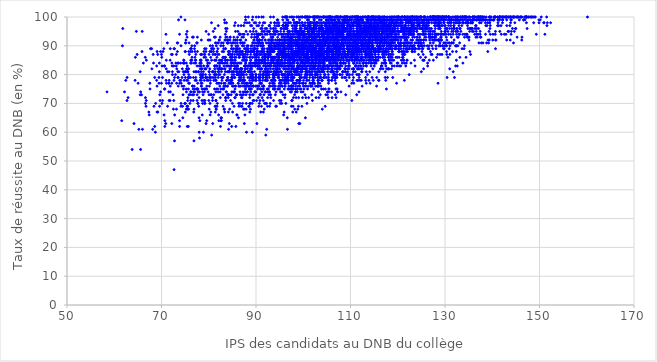
| Category | reu_brut_G |
|---|---|
| 98.0574247389712 | 77 |
| 108.193614128385 | 91 |
| 93.5356917426993 | 86 |
| 92.8418094473348 | 80 |
| 101.205676694996 | 96 |
| 116.446866718269 | 89 |
| 109.258582033633 | 90 |
| 111.375158061735 | 86 |
| 81.3347429428689 | 69 |
| 106.955762096414 | 79 |
| 111.204639375103 | 89 |
| 96.8448099599751 | 90 |
| 99.0614620617843 | 83 |
| 118.5859451224 | 92 |
| 108.109020622198 | 93 |
| 103.301721868707 | 81 |
| 120.106388388778 | 92 |
| 121.941097410415 | 96 |
| 116.118729919025 | 98 |
| 126.486569555355 | 99 |
| 116.167020654096 | 90 |
| 108.315897839998 | 97 |
| 114.581822259317 | 79 |
| 116.686599782313 | 95 |
| 122.552704291567 | 99 |
| 113.837405544335 | 85 |
| 117.96437181888 | 89 |
| 77.0780023997472 | 75 |
| 106.456765999776 | 81 |
| 107.01725673328 | 89 |
| 107.043779699806 | 82 |
| 110.637995663218 | 79 |
| 133.145594501586 | 86 |
| 109.605824070029 | 87 |
| 107.067110280555 | 90 |
| 121.437952500692 | 84 |
| 98.7329528992017 | 75 |
| 105.294921391208 | 78 |
| 85.9032099187627 | 82 |
| 97.5856100515473 | 83 |
| 102.027804708924 | 82 |
| 95.0484700527107 | 85 |
| 99.7457374137633 | 82 |
| 112.153949127509 | 83 |
| 114.113837464095 | 85 |
| 114.254080368575 | 98 |
| 113.263477756213 | 84 |
| 124.993335642129 | 81 |
| 95.5030437477275 | 74 |
| 113.231829508771 | 90 |
| 121.067253404027 | 96 |
| 102.33762497167 | 88 |
| 104.025497241884 | 78 |
| 121.815705125743 | 84 |
| 121.747476679914 | 90 |
| 116.389227861052 | 90 |
| 109.260514147983 | 94 |
| 118.226684289135 | 94 |
| 101.674026981906 | 80 |
| 96.0004730470147 | 88 |
| 83.5022837879018 | 76 |
| 71.8072071404106 | 71 |
| 99.7278803569167 | 81 |
| 99.4653942298451 | 79 |
| 99.6411804665782 | 92 |
| 91.9883689302437 | 78 |
| 104.063093188227 | 87 |
| 88.0046069839354 | 76 |
| 90.9920180135138 | 67 |
| 104.598450243948 | 86 |
| 80.0689516939292 | 73 |
| 102.703146605309 | 98 |
| 96.8004421657071 | 85 |
| 83.0701516807762 | 91 |
| 90.8840809101393 | 94 |
| 83.8784089952797 | 96 |
| 103.069580627837 | 82 |
| 65.2059770990001 | 61 |
| 92.5644137724826 | 81 |
| 78.0460605851833 | 58 |
| 93.8992744819904 | 76 |
| 96.9541776623181 | 87 |
| 100.576905750399 | 85 |
| 92.6222425913395 | 92 |
| 78.2162139168631 | 85 |
| 81.824517609393 | 70 |
| 88.3739179428429 | 76 |
| 99.426692316183 | 83 |
| 90.9054517611376 | 73 |
| 117.398801063767 | 91 |
| 103.974104948353 | 92 |
| 104.305712594663 | 96 |
| 115.957575967666 | 94 |
| 116.690049929823 | 98 |
| 103.205790893712 | 94 |
| 104.032813939675 | 89 |
| 79.4053929585136 | 88 |
| 87.7904919881352 | 83 |
| 98.7716899887666 | 78 |
| 62.1707063816819 | 74 |
| 94.2492921697877 | 74 |
| 89.9969502472228 | 74 |
| 84.0251683052644 | 79 |
| 95.8851634203459 | 88 |
| 105.79144386819 | 95 |
| 96.3426620957065 | 77 |
| 90.2780611427279 | 89 |
| 104.64829265874 | 69 |
| 96.8095213115768 | 77 |
| 93.2448667989566 | 78 |
| 82.6829598467108 | 79 |
| 113.251441880224 | 86 |
| 87.6744295666942 | 81 |
| 96.1726902980408 | 85 |
| 83.0339107670087 | 86 |
| 100.803885782538 | 78 |
| 97.2340987586138 | 91 |
| 97.0645779259505 | 84 |
| 101.710062764314 | 88 |
| 84.7225256098806 | 77 |
| 87.7332138432147 | 83 |
| 96.3153263943336 | 70 |
| 92.4569260892036 | 81 |
| 106.949494445913 | 100 |
| 95.6850049213676 | 89 |
| 110.350393178366 | 100 |
| 101.850577600192 | 88 |
| 99.7289132053266 | 90 |
| 98.5021347907808 | 87 |
| 90.0291035319273 | 95 |
| 104.874539059055 | 92 |
| 102.321736098607 | 89 |
| 100.248113556155 | 89 |
| 100.657506838771 | 81 |
| 75.0561528237236 | 81 |
| 108.888021981404 | 82 |
| 103.942974406324 | 88 |
| 110.894321900581 | 98 |
| 103.517396251497 | 93 |
| 98.1272471514093 | 85 |
| 95.3180967082642 | 94 |
| 86.2389095604921 | 97 |
| 103.186050723386 | 88 |
| 96.298395588593 | 83 |
| 100.932412392007 | 92 |
| 116.307114853338 | 99 |
| 108.215530364293 | 83 |
| 100.629757057938 | 88 |
| 94.5368254303244 | 81 |
| 100.944441624714 | 91 |
| 103.503391078981 | 81 |
| 108.946934697407 | 86 |
| 91.4398765168401 | 85 |
| 100.684081032557 | 82 |
| 94.9521149224812 | 83 |
| 97.0804344254613 | 86 |
| 102.560734757539 | 79 |
| 117.287401489386 | 93 |
| 102.974313574432 | 80 |
| 97.9068351540819 | 72 |
| 95.1882784006547 | 84 |
| 96.6186930693029 | 89 |
| 95.1977056424576 | 95 |
| 114.798568588777 | 92 |
| 100.872631020171 | 89 |
| 111.640345425327 | 92 |
| 102.60167468368 | 87 |
| 98.2962292350084 | 93 |
| 118.976758231174 | 95 |
| 107.269298451811 | 97 |
| 113.675951220406 | 100 |
| 123.019123774507 | 97 |
| 112.00855812854 | 92 |
| 111.192894467184 | 90 |
| 150.901952321083 | 98 |
| 111.805980054562 | 89 |
| 110.962759526253 | 94 |
| 118.676555552209 | 99 |
| 107.187130351579 | 94 |
| 110.21636373705 | 90 |
| 120.460707885276 | 99 |
| 104.86596622771 | 98 |
| 105.256393899577 | 97 |
| 110.394383006424 | 91 |
| 109.708482481194 | 97 |
| 122.633212263559 | 99 |
| 106.552620044588 | 95 |
| 107.261546831707 | 93 |
| 105.353442145622 | 78 |
| 105.152171490641 | 94 |
| 99.6817097223279 | 89 |
| 106.598401598027 | 90 |
| 81.5388260857913 | 91 |
| 112.804189039337 | 95 |
| 101.46717918471 | 92 |
| 97.4457556466883 | 89 |
| 114.45178445713 | 97 |
| 108.06693639027 | 95 |
| 118.330021630803 | 95 |
| 93.8630311409056 | 95 |
| 108.313920494036 | 92 |
| 81.4836914439088 | 83 |
| 106.830298157602 | 90 |
| 119.749790263322 | 100 |
| 122.57172685526 | 100 |
| 113.914221991477 | 100 |
| 123.082528395615 | 100 |
| 109.413259059074 | 100 |
| 127.729279650973 | 100 |
| 121.880069785269 | 99 |
| 106.350983620062 | 89 |
| 82.8499358402688 | 88 |
| 118.894450753376 | 100 |
| 72.315518823474 | 80 |
| 86.275504072547 | 77 |
| 90.8646658814288 | 87 |
| 106.273319095269 | 96 |
| 88.1757171798136 | 82 |
| 110.207422593523 | 93 |
| 69.7010297548434 | 71 |
| 84.0136020973719 | 85 |
| 83.1653700426442 | 88 |
| 116.380819015534 | 96 |
| 102.615362766181 | 89 |
| 132.790285507794 | 100 |
| 125.666218940558 | 100 |
| 64.1803841982182 | 63 |
| 94.0459445374687 | 89 |
| 74.6430741570371 | 75 |
| 99.0932600949378 | 85 |
| 113.996938788982 | 90 |
| 83.8985833255245 | 91 |
| 111.994327067766 | 98 |
| 115.009500497606 | 97 |
| 82.2121707029223 | 84 |
| 102.459444110861 | 94 |
| 96.8710483788591 | 88 |
| 88.8538684850587 | 97 |
| 89.1164344633275 | 80 |
| 118.104555790078 | 87 |
| 106.568365698264 | 91 |
| 85.8748105541331 | 88 |
| 105.736675447956 | 93 |
| 98.7573549854232 | 88 |
| 92.8604292134196 | 92 |
| 124.937933274909 | 96 |
| 110.610642875087 | 96 |
| 127.321988909502 | 100 |
| 134.298824924555 | 100 |
| 116.699067910876 | 98 |
| 133.748856214386 | 100 |
| 128.840878834378 | 100 |
| 141.565959078196 | 100 |
| 125.53114823215 | 99 |
| 100.700463887564 | 92 |
| 132.952946322859 | 98 |
| 122.473089167185 | 98 |
| 98.5498033674546 | 80 |
| 115.708488894155 | 95 |
| 115.072302358284 | 95 |
| 118.424240810692 | 99 |
| 110.451055334901 | 94 |
| 99.1114072723168 | 88 |
| 113.291996748088 | 95 |
| 123.355294989635 | 100 |
| 109.368526202601 | 94 |
| 142.163866212088 | 98 |
| 107.873673779139 | 98 |
| 146.641439750682 | 99 |
| 146.659181537649 | 99 |
| 115.592535516618 | 93 |
| 91.374119466831 | 86 |
| 98.5298176129301 | 96 |
| 113.318913273043 | 88 |
| 109.097076752031 | 100 |
| 103.608704762495 | 73 |
| 106.4700235177 | 92 |
| 103.143025258202 | 76 |
| 114.300248825494 | 92 |
| 99.8299577514553 | 92 |
| 105.901739381282 | 93 |
| 111.624162463741 | 88 |
| 102.09585190975599 | 92 |
| 100.158530493361 | 94 |
| 115.764542721635 | 99 |
| 108.601460815901 | 97 |
| 108.83665175844 | 98 |
| 96.8469498568071 | 98 |
| 113.047330855116 | 90 |
| 108.247916050497 | 80 |
| 102.73211448121 | 86 |
| 102.070674997897 | 90 |
| 103.02121178806 | 80 |
| 111.230343977809 | 95 |
| 108.803512854659 | 95 |
| 109.698867681161 | 76 |
| 100.57763853994 | 86 |
| 101.476646959692 | 98 |
| 87.5178302280522 | 83 |
| 105.142047068719 | 90 |
| 104.131251606494 | 89 |
| 103.199502799602 | 78 |
| 103.668482635804 | 89 |
| 106.593764449264 | 98 |
| 99.8918322391302 | 85 |
| 124.401326857653 | 90 |
| 122.675279211492 | 99 |
| 99.6227443953337 | 92 |
| 92.5295599339278 | 87 |
| 108.484678507965 | 84 |
| 108.248440670152 | 93 |
| 88.715761834736 | 79 |
| 110.187054202942 | 98 |
| 108.21749403257 | 79 |
| 89.8742894440454 | 89 |
| 86.6252401619704 | 74 |
| 89.6018706935523 | 88 |
| 118.254149643856 | 98 |
| 118.118007644136 | 98 |
| 78.4269917309882 | 78 |
| 81.2675195557081 | 83 |
| 90.3311348197297 | 94 |
| 92.6374982098962 | 89 |
| 83.9948213424662 | 92 |
| 69.2030385330398 | 87 |
| 98.1504294039256 | 96 |
| 101.991404252326 | 79 |
| 103.606729584363 | 83 |
| 87.188896946704 | 88 |
| 68.4071668043647 | 69 |
| 93.2738665257265 | 89 |
| 80.5740340507961 | 89 |
| 101.162177867007 | 100 |
| 115.290353821419 | 100 |
| 112.036213739794 | 99 |
| 91.0960368024663 | 84 |
| 90.0343217783026 | 100 |
| 99.4431652872274 | 84 |
| 87.260651958208 | 91 |
| 84.232934458741 | 87 |
| 104.908338444056 | 97 |
| 95.7077525290049 | 80 |
| 86.6979314540655 | 78 |
| 93.3384412949489 | 84 |
| 93.1715340875867 | 91 |
| 102.5539478344 | 93 |
| 91.96890607956 | 82 |
| 104.619552009873 | 92 |
| 110.638131126581 | 82 |
| 107.4189004928 | 95 |
| 105.303601722895 | 92 |
| 102.299416560467 | 98 |
| 100.179322917492 | 82 |
| 102.102402346717 | 84 |
| 117.575553595035 | 91 |
| 98.5713348032205 | 95 |
| 99.0265212365103 | 82 |
| 106.68711363418 | 85 |
| 109.370158043736 | 89 |
| 115.070474359653 | 99 |
| 94.7008915480288 | 84 |
| 91.7809469451007 | 87 |
| 103.714193224115 | 82 |
| 83.668444890223 | 74 |
| 94.583217533078 | 93 |
| 100.82409958373 | 86 |
| 100.400834329045 | 93 |
| 88.2985484992726 | 79 |
| 94.8691878501104 | 94 |
| 98.8300279174435 | 81 |
| 110.910966865129 | 88 |
| 71.2604492406317 | 81 |
| 112.620494492166 | 98 |
| 114.862866047861 | 100 |
| 123.8153321587 | 100 |
| 97.0993241957941 | 95 |
| 117.92466889256 | 97 |
| 88.3188440487565 | 88 |
| 111.309654796846 | 98 |
| 93.9241450902668 | 89 |
| 98.5854804664609 | 97 |
| 113.865871134319 | 96 |
| 98.075242716165 | 86 |
| 95.8150779895708 | 91 |
| 88.8873671748382 | 74 |
| 102.971809051643 | 84 |
| 87.9488435994388 | 85 |
| 101.763954966782 | 87 |
| 82.6195483169899 | 85 |
| 87.2473285407118 | 74 |
| 124.128995580773 | 100 |
| 127.653837704897 | 100 |
| 95.4059847288263 | 81 |
| 101.682655765948 | 87 |
| 108.183186425417 | 89 |
| 79.672252946835 | 83 |
| 104.899745131942 | 79 |
| 114.141461933959 | 92 |
| 98.4917509750934 | 72 |
| 90.8407244718507 | 82 |
| 124.792015789459 | 98 |
| 113.495444744105 | 99 |
| 114.692306413567 | 86 |
| 107.154944751846 | 75 |
| 87.0448455117371 | 72 |
| 107.228001429627 | 87 |
| 106.788457007778 | 79 |
| 96.8529612375812 | 80 |
| 90.1303657811656 | 71 |
| 96.9167947319566 | 82 |
| 97.5670624995927 | 100 |
| 107.134880330267 | 88 |
| 110.930029534395 | 94 |
| 95.9980890394858 | 84 |
| 86.4088793189587 | 84 |
| 98.0909810611521 | 86 |
| 95.1029637536384 | 78 |
| 106.278110484197 | 83 |
| 98.9413495016351 | 82 |
| 104.293235647462 | 86 |
| 99.6320077291649 | 87 |
| 100.335855422055 | 91 |
| 107.110349696792 | 93 |
| 115.136872725956 | 89 |
| 97.6606820299681 | 97 |
| 109.391768052197 | 100 |
| 96.8201777608856 | 98 |
| 103.126459759256 | 91 |
| 114.812376703172 | 90 |
| 103.751250510786 | 91 |
| 112.300747471582 | 99 |
| 115.648635212388 | 94 |
| 107.903679350106 | 100 |
| 105.237705230107 | 98 |
| 94.4384837146785 | 97 |
| 106.942307706977 | 100 |
| 107.083717211307 | 93 |
| 93.5378076658594 | 85 |
| 103.378886116722 | 92 |
| 114.767149465216 | 89 |
| 107.236402616969 | 97 |
| 106.129719099427 | 82 |
| 108.460452863807 | 95 |
| 107.775872187399 | 100 |
| 103.38872176537 | 93 |
| 105.279668117315 | 100 |
| 109.955549137674 | 97 |
| 107.706396224524 | 88 |
| 99.1874542356718 | 94 |
| 107.004410721853 | 89 |
| 120.722966958172 | 97 |
| 113.675643578392 | 98 |
| 84.1490555429446 | 67 |
| 107.414806888368 | 90 |
| 129.660276346593 | 94 |
| 120.704676743426 | 90 |
| 141.360031390042 | 97 |
| 119.157069325398 | 95 |
| 103.152312852561 | 77 |
| 107.559943892647 | 87 |
| 76.7585145932488 | 79 |
| 86.455676282647 | 88 |
| 117.829977594367 | 96 |
| 120.913137821835 | 93 |
| 108.081242169953 | 86 |
| 114.989126208928 | 94 |
| 122.741200505596 | 96 |
| 78.8126757230777 | 80 |
| 78.3072449879254 | 84 |
| 70.111328789388 | 83 |
| 76.1820341895981 | 74 |
| 75.6954104584861 | 75 |
| 110.333607071564 | 92 |
| 133.687229574321 | 98 |
| 104.274687507594 | 100 |
| 119.864251395734 | 99 |
| 130.756847727879 | 100 |
| 133.425554761582 | 100 |
| 114.652590342955 | 100 |
| 124.838186300422 | 100 |
| 114.119479413565 | 99 |
| 87.0780820727724 | 88 |
| 129.463891529811 | 97 |
| 92.4761533728266 | 81 |
| 73.3285300972531 | 91 |
| 123.144887157001 | 100 |
| 92.8650031148529 | 97 |
| 125.686244751991 | 100 |
| 137.666811241395 | 100 |
| 122.783079257083 | 100 |
| 110.133789976719 | 96 |
| 118.239900311317 | 90 |
| 100.551690433624 | 79 |
| 131.733284149573 | 81 |
| 72.0884461841473 | 87 |
| 79.6382647440004 | 78 |
| 99.9849490385245 | 85 |
| 100.366373522005 | 73 |
| 104.321410627146 | 95 |
| 90.914405086698 | 79 |
| 92.4582070270438 | 86 |
| 101.788502584628 | 94 |
| 96.5684224102461 | 100 |
| 114.561657976337 | 86 |
| 90.6131667888017 | 76 |
| 61.7356558485258 | 90 |
| 69.5482161585706 | 81 |
| 93.4211797797179 | 89 |
| 108.074778625177 | 96 |
| 103.933889536455 | 90 |
| 123.003940512744 | 90 |
| 119.632436313401 | 90 |
| 109.784371127199 | 97 |
| 102.485606563271 | 92 |
| 97.5226886188168 | 83 |
| 97.7981351896429 | 83 |
| 99.0255629934069 | 72 |
| 103.134984984588 | 82 |
| 105.185822574263 | 99 |
| 114.059288964611 | 88 |
| 71.8621967150278 | 89 |
| 77.9488569590919 | 72 |
| 103.724968395339 | 88 |
| 95.9351586538306 | 80 |
| 127.232638660656 | 90 |
| 116.203078393451 | 94 |
| 112.307869596897 | 92 |
| 107.85269944398 | 95 |
| 65.9134052296267 | 95 |
| 98.5511900547049 | 87 |
| 96.1256172557579 | 78 |
| 89.2354813158663 | 78 |
| 110.032994819661 | 87 |
| 97.1171862269252 | 89 |
| 75.0487994897378 | 70 |
| 112.372529935565 | 89 |
| 74.5516856474012 | 73 |
| 92.0560377282697 | 82 |
| 76.8872384658953 | 68 |
| 76.1954983751966 | 71 |
| 97.4569982340616 | 91 |
| 110.673477661624 | 82 |
| 96.3167228841219 | 93 |
| 111.823406009606 | 94 |
| 70.7069023615538 | 64 |
| 90.8170369984782 | 91 |
| 94.0470406859435 | 78 |
| 104.477565510517 | 88 |
| 93.837888348899 | 83 |
| 87.8453089924819 | 88 |
| 119.532611713299 | 95 |
| 130.621587259371 | 86 |
| 84.813168253172 | 78 |
| 72.3049310304474 | 81 |
| 95.1888609106681 | 81 |
| 123.098044173811 | 92 |
| 75.701811753467 | 82 |
| 69.9928431447097 | 87 |
| 64.8496892791668 | 87 |
| 68.9715591423696 | 78 |
| 103.793622466937 | 85 |
| 97.5789334558182 | 91 |
| 76.4502962165649 | 86 |
| 101.857486891813 | 89 |
| 89.6638934206404 | 81 |
| 91.1593678696764 | 82 |
| 74.1246689923551 | 90 |
| 117.116445606358 | 94 |
| 127.537516826348 | 91 |
| 84.9250437456378 | 80 |
| 106.454656880947 | 91 |
| 98.2587476132335 | 91 |
| 77.2570182553073 | 84 |
| 113.484817092387 | 87 |
| 70.2234737337398 | 79 |
| 115.907721822343 | 89 |
| 140.167308215522 | 99 |
| 132.303476731051 | 95 |
| 110.53981154498 | 94 |
| 118.216097171396 | 100 |
| 111.167185759224 | 100 |
| 130.366504991315 | 100 |
| 129.791379882124 | 100 |
| 147.201092604602 | 100 |
| 150.371337928995 | 100 |
| 142.673215329922 | 100 |
| 135.818051255579 | 98 |
| 127.80276087535 | 99 |
| 138.416141486947 | 100 |
| 119.264540383385 | 97 |
| 141.544218969166 | 100 |
| 131.749215847551 | 100 |
| 117.095859851655 | 95 |
| 129.68862357786 | 100 |
| 130.223893173349 | 100 |
| 139.378211075441 | 98 |
| 88.5648339736615 | 98 |
| 117.187572279873 | 98 |
| 120.958696479318 | 84 |
| 121.380829743927 | 91 |
| 126.830181793508 | 93 |
| 121.807757973737 | 98 |
| 114.776904374589 | 98 |
| 102.829249914848 | 86 |
| 123.450097926739 | 96 |
| 99.7914313032527 | 100 |
| 121.73378512085 | 93 |
| 126.32262283663 | 100 |
| 125.167676583775 | 94 |
| 89.6685320560567 | 90 |
| 133.093401167427 | 96 |
| 121.409043411796 | 100 |
| 112.473942253515 | 92 |
| 134.406629220092 | 98 |
| 124.71212018512 | 94 |
| 126.629123874374 | 96 |
| 117.912452435784 | 82 |
| 102.684594770442 | 89 |
| 120.678179090572 | 92 |
| 113.489723577909 | 100 |
| 105.19679774306 | 83 |
| 115.937268683967 | 93 |
| 90.6755786069048 | 83 |
| 72.4301032195479 | 73 |
| 71.5326657994567 | 77 |
| 127.955690862617 | 94 |
| 121.899984577135 | 96 |
| 102.5523051609 | 84 |
| 119.528720482842 | 90 |
| 86.2386647577274 | 82 |
| 124.38905928301 | 98 |
| 111.535126025457 | 88 |
| 93.234977815891 | 88 |
| 152.356745341408 | 98 |
| 104.430005987578 | 88 |
| 115.333748098815 | 93 |
| 101.160368085373 | 94 |
| 117.661985653028 | 96 |
| 111.420751534455 | 86 |
| 126.329229218386 | 83 |
| 98.4819354386853 | 92 |
| 116.749425634798 | 95 |
| 94.8110563437533 | 84 |
| 115.037537252939 | 83 |
| 120.885756909026 | 98 |
| 89.3886311974642 | 89 |
| 99.2177679175862 | 77 |
| 94.8781738542106 | 97 |
| 106.75308856433 | 98 |
| 102.099024060581 | 85 |
| 93.6544356848994 | 94 |
| 109.734884673331 | 93 |
| 96.081584543815 | 92 |
| 96.3393310858182 | 97 |
| 119.715152376759 | 98 |
| 107.631451461801 | 86 |
| 98.9142725634373 | 92 |
| 89.2633919234502 | 86 |
| 132.840715459333 | 99 |
| 133.750108987672 | 100 |
| 126.726686905363 | 99 |
| 95.8573319641989 | 90 |
| 100.684154947449 | 100 |
| 117.142634497193 | 100 |
| 106.08172787654 | 100 |
| 111.7706693775 | 99 |
| 125.647361586003 | 99 |
| 113.939744276573 | 98 |
| 105.683762869695 | 100 |
| 104.128182394135 | 83 |
| 79.9824384923656 | 94 |
| 92.0574890599149 | 84 |
| 85.4390086094475 | 74 |
| 88.7953763142047 | 83 |
| 115.980834223152 | 88 |
| 93.2341482838148 | 92 |
| 93.5303777091927 | 86 |
| 102.463976357862 | 87 |
| 112.287307760436 | 90 |
| 87.7879751328846 | 75 |
| 85.5981617957153 | 76 |
| 89.0468090984264 | 88 |
| 93.869660312836 | 86 |
| 126.881274474 | 91 |
| 105.822817523557 | 84 |
| 113.389431014109 | 95 |
| 101.426228439377 | 85 |
| 97.4334534347503 | 86 |
| 110.644052550261 | 87 |
| 111.929887325933 | 84 |
| 115.376589561007 | 85 |
| 108.362190839532 | 94 |
| 113.464311676706 | 91 |
| 113.296891112516 | 90 |
| 111.683910828283 | 88 |
| 127.219439459499 | 100 |
| 114.159088388391 | 77 |
| 115.746657898703 | 99 |
| 122.719804492403 | 99 |
| 105.478234312756 | 98 |
| 102.442447409752 | 81 |
| 98.5118280891376 | 67 |
| 96.4958620457255 | 78 |
| 107.684678737594 | 93 |
| 104.071369612082 | 81 |
| 99.8490117425122 | 100 |
| 106.070906132282 | 97 |
| 102.379743668878 | 86 |
| 98.3837676772011 | 95 |
| 100.938778795964 | 87 |
| 98.2898194851879 | 97 |
| 102.546708076979 | 92 |
| 107.649695873273 | 94 |
| 107.52830392833 | 100 |
| 101.519445866656 | 97 |
| 117.874454730034 | 93 |
| 120.497423567894 | 98 |
| 99.8870025530255 | 89 |
| 114.083324761297 | 100 |
| 106.153836209742 | 95 |
| 115.992171751121 | 81 |
| 105.28450569954 | 72 |
| 92.7874850467305 | 89 |
| 95.0928298870983 | 76 |
| 99.3619032019867 | 79 |
| 101.670264455219 | 91 |
| 103.461624790845 | 95 |
| 88.6373379339122 | 86 |
| 97.7337626823038 | 88 |
| 104.432879756115 | 89 |
| 102.726005591555 | 88 |
| 82.1593732133117 | 77 |
| 100.117736774474 | 94 |
| 94.5549058141544 | 95 |
| 96.6239749280344 | 65 |
| 123.606093943879 | 88 |
| 110.021098176495 | 100 |
| 105.247803273696 | 89 |
| 108.039536955068 | 90 |
| 109.165136298397 | 86 |
| 71.8456009206686 | 76 |
| 107.369239252493 | 92 |
| 63.7904244860599 | 54 |
| 107.551095699375 | 90 |
| 102.271881530282 | 77 |
| 89.0801091308945 | 82 |
| 80.7551928574126 | 89 |
| 100.617845621312 | 76 |
| 91.5188784200577 | 75 |
| 102.577564073054 | 83 |
| 107.687493942517 | 88 |
| 94.3368126340488 | 91 |
| 92.912070645119 | 83 |
| 114.663584139416 | 96 |
| 92.6093935188199 | 86 |
| 98.3319489457078 | 87 |
| 105.331744475253 | 93 |
| 126.089695409767 | 99 |
| 105.921553184842 | 95 |
| 100.061835564116 | 90 |
| 107.092646024886 | 96 |
| 102.511527999943 | 89 |
| 100.5402247585 | 91 |
| 105.087848641541 | 95 |
| 101.22908997382 | 83 |
| 102.057445999892 | 89 |
| 98.1611955376497 | 94 |
| 115.216703621331 | 87 |
| 102.272531441498 | 85 |
| 92.5410327826826 | 91 |
| 94.5107508165944 | 81 |
| 118.10543297415 | 94 |
| 110.71702016808 | 88 |
| 90.8286257085984 | 71 |
| 92.0951681258362 | 80 |
| 99.0412112910869 | 82 |
| 102.602309077199 | 76 |
| 103.069634129041 | 76 |
| 111.597974444926 | 90 |
| 99.9713000813143 | 87 |
| 105.535628530647 | 83 |
| 94.8275141414619 | 88 |
| 89.2235251669604 | 86 |
| 73.8378053255141 | 77 |
| 99.1452691707645 | 77 |
| 99.2795249421605 | 95 |
| 112.175964862168 | 86 |
| 128.688510091191 | 98 |
| 118.166828740943 | 96 |
| 111.355433006047 | 100 |
| 111.22125268253 | 93 |
| 107.127665093999 | 83 |
| 114.667760318861 | 87 |
| 119.763660125941 | 97 |
| 99.2679549109059 | 79 |
| 110.16080826013 | 88 |
| 102.370318297092 | 91 |
| 96.2550245836117 | 91 |
| 98.9295433417366 | 95 |
| 116.361940431599 | 96 |
| 104.132111370033 | 85 |
| 110.488717573683 | 89 |
| 112.016290315882 | 88 |
| 109.629724999891 | 88 |
| 109.329235896 | 85 |
| 100.200108521616 | 88 |
| 103.336963192542 | 95 |
| 115.872225602942 | 92 |
| 103.729273281586 | 79 |
| 95.1707565138724 | 77 |
| 90.2971389050407 | 84 |
| 130.578630462767 | 98 |
| 109.456795333923 | 85 |
| 118.807231914156 | 85 |
| 91.014315651739 | 77 |
| 102.029448683604 | 77 |
| 121.06637774435 | 86 |
| 94.6406824354787 | 89 |
| 101.758347213934 | 86 |
| 87.9016317431448 | 73 |
| 111.52788000706 | 97 |
| 95.5157080511129 | 94 |
| 100.915930590364 | 75 |
| 107.795320492909 | 95 |
| 109.514489034491 | 98 |
| 91.3400994207201 | 97 |
| 74.1429161851905 | 70 |
| 112.725319406952 | 94 |
| 101.548717835303 | 90 |
| 108.233745966227 | 86 |
| 102.34115504279 | 92 |
| 87.1132932514498 | 78 |
| 108.132282805996 | 90 |
| 105.357172069941 | 91 |
| 103.835603430483 | 99 |
| 93.856437240038 | 86 |
| 96.8828058348983 | 88 |
| 115.18617999776 | 96 |
| 103.117499474186 | 87 |
| 102.242564205466 | 82 |
| 86.8592051983127 | 69 |
| 84.5809362624159 | 82 |
| 96.2001399625291 | 91 |
| 107.763810833699 | 88 |
| 122.817607958844 | 96 |
| 101.934743649758 | 85 |
| 101.782403980241 | 87 |
| 103.380748454634 | 97 |
| 110.526150971392 | 97 |
| 97.2561705467288 | 91 |
| 102.434458739384 | 93 |
| 98.4943326308858 | 98 |
| 101.791874194115 | 83 |
| 108.13281282232 | 90 |
| 101.261591896525 | 91 |
| 109.557606879161 | 94 |
| 129.188681129145 | 99 |
| 104.737849643067 | 91 |
| 104.689474530303 | 91 |
| 102.601431738293 | 85 |
| 113.972647447347 | 86 |
| 101.194297025007 | 88 |
| 76.7016806107099 | 71 |
| 90.4818971585006 | 72 |
| 97.9111144202015 | 88 |
| 107.738199650509 | 89 |
| 106.058002418864 | 86 |
| 108.411842631894 | 90 |
| 110.767999597932 | 84 |
| 99.5970556048929 | 89 |
| 115.861721844335 | 97 |
| 111.726220409972 | 89 |
| 97.9448677576283 | 85 |
| 95.8090218115935 | 94 |
| 103.634000163594 | 80 |
| 91.1002970853017 | 82 |
| 103.463231273568 | 85 |
| 117.701855631687 | 94 |
| 114.262673403427 | 95 |
| 104.660753672903 | 92 |
| 114.506629376619 | 97 |
| 116.30258225653 | 93 |
| 99.8950906950568 | 90 |
| 106.678428141137 | 82 |
| 101.681561917788 | 91 |
| 95.7019736260428 | 73 |
| 117.732525272677 | 97 |
| 100.9153894186 | 87 |
| 127.99644018603 | 100 |
| 123.866231600403 | 99 |
| 125.059831787936 | 99 |
| 112.896361342685 | 95 |
| 92.9994369848379 | 92 |
| 113.213762576908 | 87 |
| 111.10084881847 | 92 |
| 118.958486843735 | 93 |
| 103.051362791763 | 91 |
| 132.98218222762 | 100 |
| 101.247114150924 | 93 |
| 98.760255166788 | 95 |
| 70.9397036793807 | 94 |
| 100.492306035549 | 81 |
| 108.45808038037 | 88 |
| 107.977475565769 | 87 |
| 87.0479496233052 | 87 |
| 93.2393097851956 | 88 |
| 114.055313351108 | 94 |
| 111.594374834029 | 80 |
| 100.780359889289 | 96 |
| 101.123614692538 | 91 |
| 111.872792721631 | 93 |
| 115.45626386533 | 93 |
| 109.51093393616 | 94 |
| 101.094809859896 | 81 |
| 121.788888496718 | 99 |
| 112.406076470456 | 91 |
| 124.131973929724 | 98 |
| 100.475852775236 | 92 |
| 106.774472608782 | 92 |
| 87.7783379933573 | 100 |
| 103.828409958 | 97 |
| 94.2503431966573 | 83 |
| 96.7692802537964 | 75 |
| 98.8180485048606 | 90 |
| 98.6375077275444 | 98 |
| 109.882029825229 | 89 |
| 112.021011586721 | 94 |
| 99.2595453984528 | 83 |
| 110.802826537725 | 88 |
| 111.470729159166 | 92 |
| 132.213862356589 | 90 |
| 109.077422083999 | 98 |
| 117.175830106215 | 92 |
| 116.291126857532 | 99 |
| 110.22561954466 | 99 |
| 97.7536970568364 | 95 |
| 100.124703523015 | 92 |
| 115.668721958405 | 100 |
| 107.221894578082 | 95 |
| 96.7077928741408 | 95 |
| 123.24177901678 | 97 |
| 107.347828667715 | 96 |
| 118.841259348566 | 91 |
| 105.208589300734 | 98 |
| 96.9138702269268 | 83 |
| 112.020633130044 | 85 |
| 103.212857226477 | 84 |
| 104.052861073988 | 96 |
| 125.234272669736 | 96 |
| 83.5125967298044 | 94 |
| 105.894028738012 | 96 |
| 118.208972319525 | 85 |
| 115.265517151906 | 94 |
| 95.50031206945 | 86 |
| 94.8661734382294 | 87 |
| 112.075517034189 | 92 |
| 103.414676013355 | 93 |
| 104.637569202645 | 95 |
| 104.54789847698 | 86 |
| 93.7739940435837 | 96 |
| 86.8437325431206 | 97 |
| 96.4011048810808 | 86 |
| 114.459314801993 | 91 |
| 93.6878980122505 | 80 |
| 101.449090840094 | 82 |
| 98.1549395479474 | 86 |
| 105.610608766506 | 100 |
| 107.653744385426 | 87 |
| 105.413063293173 | 88 |
| 95.8868925287928 | 82 |
| 124.600793752822 | 97 |
| 121.006342774854 | 98 |
| 105.614002058806 | 97 |
| 108.257288621381 | 97 |
| 105.583290807111 | 98 |
| 128.686110300952 | 90 |
| 122.251026196028 | 99 |
| 126.588349051174 | 93 |
| 134.337083276619 | 100 |
| 119.36092567121 | 96 |
| 105.299978597641 | 85 |
| 104.444359896266 | 92 |
| 104.607274678936 | 86 |
| 105.74439467773 | 100 |
| 98.8579923316857 | 90 |
| 100.871619423956 | 86 |
| 102.0931568665 | 92 |
| 97.3517181353931 | 86 |
| 107.659519154045 | 98 |
| 90.3428313276215 | 92 |
| 107.042497570935 | 100 |
| 106.606509631307 | 80 |
| 98.6644366862194 | 91 |
| 111.57354588439 | 86 |
| 104.543862313489 | 79 |
| 105.337946979453 | 96 |
| 107.667521369347 | 82 |
| 115.357873120098 | 86 |
| 102.80342092238 | 89 |
| 92.3685670741621 | 89 |
| 97.5021737944836 | 87 |
| 99.1716168332273 | 92 |
| 95.9020352222911 | 98 |
| 93.4418560178447 | 76 |
| 97.2083685112557 | 76 |
| 90.7649957367728 | 98 |
| 99.0166153998965 | 100 |
| 113.589653846451 | 80 |
| 95.9952867145209 | 84 |
| 97.5849302654531 | 89 |
| 104.425829223582 | 87 |
| 89.2665209081505 | 80 |
| 98.549067574029 | 88 |
| 103.186165540206 | 87 |
| 81.6130625499929 | 90 |
| 104.456605155804 | 93 |
| 97.6499688015675 | 82 |
| 97.4183319656241 | 93 |
| 97.3467388659549 | 83 |
| 106.382499872858 | 89 |
| 97.45521650071 | 89 |
| 93.3265311568825 | 91 |
| 116.329683624555 | 93 |
| 98.1691038643565 | 73 |
| 93.8406166948987 | 79 |
| 88.0449345414341 | 86 |
| 105.500482721528 | 85 |
| 96.1144828607582 | 85 |
| 108.089547119604 | 97 |
| 108.198769178681 | 92 |
| 97.1162371608797 | 80 |
| 104.961728249242 | 95 |
| 95.4455299763062 | 80 |
| 95.5423391235428 | 90 |
| 99.8569905770131 | 84 |
| 101.05459553421 | 87 |
| 97.6048410759674 | 88 |
| 94.7945597628137 | 85 |
| 118.806623105329 | 94 |
| 111.566181094211 | 82 |
| 126.109723726442 | 99 |
| 109.959899913312 | 86 |
| 87.9151593179305 | 68 |
| 109.477475566684 | 89 |
| 107.816669572833 | 82 |
| 128.763746973818 | 92 |
| 102.630003111933 | 93 |
| 94.6275272340745 | 79 |
| 99.1763561828042 | 94 |
| 97.8632604608302 | 76 |
| 88.4839220521667 | 76 |
| 107.334420272305 | 93 |
| 100.519548250925 | 94 |
| 109.463026905837 | 87 |
| 97.5036926150968 | 74 |
| 103.014855696771 | 88 |
| 97.8746754696702 | 94 |
| 97.6913905343256 | 84 |
| 81.3713895182119 | 78 |
| 90.5639218317642 | 97 |
| 101.499270108168 | 98 |
| 113.450757483946 | 98 |
| 112.766289505923 | 83 |
| 106.88679178328 | 93 |
| 121.664137497427 | 97 |
| 106.946271308185 | 98 |
| 96.3762563666834 | 100 |
| 75.5027104399085 | 68 |
| 98.6019248582213 | 95 |
| 100.023663410289 | 86 |
| 103.766631978824 | 90 |
| 114.158559135888 | 87 |
| 91.5562422601444 | 67 |
| 69.4697520682388 | 77 |
| 108.591761352115 | 89 |
| 96.6335570684876 | 80 |
| 90.3068161281296 | 87 |
| 106.599948447455 | 92 |
| 104.703908433699 | 88 |
| 90.0534529643268 | 87 |
| 90.4745452996699 | 83 |
| 119.174107721843 | 97 |
| 111.481248675915 | 89 |
| 70.1050913773486 | 70 |
| 82.9886125451519 | 86 |
| 96.6352412954491 | 83 |
| 114.634769510581 | 91 |
| 112.019880353982 | 92 |
| 128.592630467762 | 96 |
| 124.951485575479 | 100 |
| 105.552424414755 | 93 |
| 79.18001643064 | 82 |
| 113.220484911977 | 93 |
| 98.0617063386191 | 98 |
| 123.193358593026 | 95 |
| 99.7611889604359 | 91 |
| 113.476960652427 | 94 |
| 112.645734987717 | 98 |
| 122.021280165057 | 96 |
| 122.278948161593 | 94 |
| 118.635532552343 | 93 |
| 115.856469891801 | 98 |
| 109.268907643787 | 80 |
| 97.6984087031023 | 90 |
| 101.929549192784 | 84 |
| 107.747724435487 | 80 |
| 115.712864304045 | 92 |
| 87.4398437715391 | 79 |
| 97.820260383185 | 75 |
| 92.214544368644 | 78 |
| 118.890033831372 | 88 |
| 106.274098861633 | 96 |
| 97.8373584941504 | 77 |
| 115.048087238494 | 88 |
| 115.371145370442 | 98 |
| 122.876055882116 | 98 |
| 114.706449350125 | 92 |
| 110.915974669442 | 91 |
| 114.489920202069 | 94 |
| 101.256148540923 | 81 |
| 100.884235340007 | 89 |
| 106.223945096316 | 88 |
| 78.5898769737238 | 77 |
| 93.9275762633024 | 81 |
| 99.8165032630348 | 83 |
| 95.5366884144514 | 76 |
| 117.231113732288 | 87 |
| 95.6586787340018 | 92 |
| 113.263397421395 | 92 |
| 91.678101902565 | 73 |
| 111.256115918027 | 91 |
| 118.182123594004 | 93 |
| 82.3418948838389 | 84 |
| 105.76371052537 | 90 |
| 106.791766720011 | 92 |
| 75.5280820397444 | 69 |
| 76.8707164170175 | 57 |
| 109.626667537276 | 93 |
| 108.943384093611 | 84 |
| 106.111636872124 | 72 |
| 101.175466600678 | 90 |
| 136.181184230614 | 100 |
| 116.588137600758 | 96 |
| 116.429427784264 | 91 |
| 123.870217713141 | 100 |
| 124.267841730717 | 92 |
| 94.4296560617701 | 87 |
| 102.348700584281 | 96 |
| 112.785890584981 | 93 |
| 83.5772497023083 | 89 |
| 92.7980818614206 | 95 |
| 98.4298481054265 | 88 |
| 103.348899489737 | 90 |
| 98.8809353586973 | 94 |
| 101.430222109785 | 80 |
| 92.3558965891542 | 75 |
| 95.6076740913615 | 88 |
| 105.087234136392 | 88 |
| 93.4118602516577 | 89 |
| 101.541635852327 | 91 |
| 104.441427783133 | 91 |
| 83.9250229321161 | 91 |
| 95.3413490896867 | 90 |
| 99.2545614048961 | 78 |
| 99.9689659539108 | 90 |
| 114.618373472866 | 100 |
| 104.597184102571 | 95 |
| 109.336955958496 | 95 |
| 118.764719203845 | 100 |
| 117.842035636424 | 100 |
| 102.318749344627 | 89 |
| 90.0282683710569 | 78 |
| 107.496446343069 | 91 |
| 94.1034167537382 | 94 |
| 98.0335552430245 | 84 |
| 84.1802537680469 | 87 |
| 108.285641286671 | 96 |
| 98.7338966858728 | 87 |
| 104.905951856266 | 85 |
| 94.0870191143697 | 73 |
| 88.790443558144 | 80 |
| 116.178606546115 | 96 |
| 105.143044778458 | 89 |
| 117.505682685828 | 96 |
| 123.129645440095 | 99 |
| 103.392340965591 | 85 |
| 98.3945288198235 | 81 |
| 103.378651200761 | 83 |
| 102.584330213546 | 97 |
| 80.9506800492201 | 95 |
| 113.551523564803 | 89 |
| 87.2386423853529 | 86 |
| 94.3291150911747 | 83 |
| 112.705465664402 | 93 |
| 89.1756106039427 | 90 |
| 105.026935435434 | 83 |
| 113.10691615459 | 87 |
| 95.3578691185814 | 83 |
| 89.6409361222679 | 89 |
| 102.471031741741 | 84 |
| 106.578424179311 | 80 |
| 128.72090482543 | 97 |
| 114.890446419133 | 88 |
| 120.882903908569 | 93 |
| 120.119038237681 | 95 |
| 106.972069246694 | 96 |
| 104.519884139458 | 95 |
| 100.267496934288 | 86 |
| 101.27546705838 | 81 |
| 108.603839797238 | 89 |
| 101.14267978534 | 86 |
| 107.481132297583 | 85 |
| 93.069772057766 | 84 |
| 101.631301828199 | 87 |
| 89.6538641149385 | 84 |
| 107.12405064716 | 86 |
| 112.326510421603 | 95 |
| 82.9961119198624 | 73 |
| 116.674506824907 | 96 |
| 97.0333848581179 | 83 |
| 113.198638708201 | 89 |
| 93.2621870008126 | 78 |
| 97.7461530306619 | 86 |
| 84.2670684225127 | 87 |
| 99.0699102905374 | 78 |
| 117.140619236913 | 96 |
| 113.93760462752 | 89 |
| 107.982884088043 | 94 |
| 118.411689573148 | 84 |
| 118.038154633704 | 87 |
| 100.828701517411 | 88 |
| 77.2534145336025 | 85 |
| 98.441421694367 | 74 |
| 89.7998115578936 | 84 |
| 116.215995488768 | 91 |
| 105.491877710039 | 78 |
| 104.271819446685 | 81 |
| 84.6016524638882 | 78 |
| 106.810705576802 | 85 |
| 98.3954620084446 | 76 |
| 101.348777164143 | 89 |
| 93.5389694444004 | 80 |
| 88.6198080857857 | 84 |
| 95.1286777167171 | 88 |
| 121.431006048131 | 93 |
| 112.269986672527 | 78 |
| 80.5990877757948 | 85 |
| 91.4737273004344 | 87 |
| 117.997483065684 | 91 |
| 127.947736991028 | 99 |
| 117.134586371181 | 91 |
| 111.159819848365 | 89 |
| 113.856129385872 | 87 |
| 89.2905295412174 | 83 |
| 124.511401834577 | 94 |
| 112.987184124247 | 96 |
| 111.876395399478 | 96 |
| 112.797123459799 | 95 |
| 102.290972095634 | 96 |
| 119.979640975092 | 93 |
| 102.035107982506 | 90 |
| 112.931735644189 | 92 |
| 110.729748804739 | 97 |
| 106.801484966957 | 93 |
| 104.619463664685 | 88 |
| 97.8591739782967 | 91 |
| 101.506250571142 | 96 |
| 99.6057413032724 | 100 |
| 115.814226198966 | 97 |
| 108.262897977084 | 88 |
| 110.309474162009 | 98 |
| 116.505368561783 | 100 |
| 117.907683580622 | 93 |
| 92.9872040564248 | 94 |
| 103.864806649911 | 85 |
| 108.126380176322 | 92 |
| 101.942527339462 | 95 |
| 107.388556146051 | 96 |
| 102.502315806811 | 92 |
| 106.562265146641 | 84 |
| 72.7888928091301 | 66 |
| 119.569637741551 | 100 |
| 89.2073047289647 | 78 |
| 117.191456437285 | 97 |
| 114.417826776947 | 94 |
| 117.952660310966 | 99 |
| 105.709401764861 | 100 |
| 97.4647687922736 | 91 |
| 118.342720594212 | 98 |
| 105.984140217454 | 99 |
| 110.302035065322 | 98 |
| 102.99563073215 | 91 |
| 93.8897303369055 | 98 |
| 115.719023556295 | 90 |
| 102.345485202755 | 97 |
| 120.76394466929 | 96 |
| 121.06815167394 | 86 |
| 109.398074223266 | 97 |
| 102.769471507108 | 94 |
| 113.474977082867 | 99 |
| 107.839914547463 | 83 |
| 96.1411745283361 | 96 |
| 90.1931853072755 | 63 |
| 99.797677520271 | 97 |
| 120.374403676952 | 88 |
| 105.681789053127 | 92 |
| 102.694333423967 | 88 |
| 114.125434399641 | 97 |
| 106.613186954538 | 92 |
| 115.054147251213 | 96 |
| 117.977982932777 | 93 |
| 118.612845937116 | 87 |
| 113.470455499828 | 95 |
| 100.413952070485 | 80 |
| 100.930964668394 | 85 |
| 109.228159999334 | 99 |
| 108.818021925331 | 93 |
| 112.210160241337 | 95 |
| 106.85243904235 | 100 |
| 118.505740017 | 96 |
| 113.210631348237 | 78 |
| 124.853859380352 | 100 |
| 119.431858126913 | 92 |
| 114.2818216805 | 99 |
| 124.81506896904 | 86 |
| 108.777564602964 | 92 |
| 118.15964253717 | 91 |
| 125.725839867959 | 100 |
| 137.570135656884 | 100 |
| 114.329986599947 | 97 |
| 111.736001681752 | 97 |
| 113.819673817797 | 95 |
| 115.32772418684 | 99 |
| 112.197269798148 | 99 |
| 115.387627948059 | 99 |
| 126.417504220466 | 99 |
| 113.879418526372 | 91 |
| 119.881536132494 | 92 |
| 115.98119372401 | 96 |
| 114.791937575176 | 95 |
| 119.508938752312 | 93 |
| 125.980235462321 | 96 |
| 113.251215296019 | 91 |
| 90.2141547049227 | 93 |
| 135.883990421236 | 100 |
| 142.882142953599 | 100 |
| 106.988728982411 | 95 |
| 98.6151838492956 | 81 |
| 100.355203072896 | 96 |
| 86.2880272631512 | 65 |
| 64.4103808959872 | 78 |
| 100.613749584497 | 85 |
| 110.289153730408 | 77 |
| 109.256025185187 | 86 |
| 98.1998361794921 | 68 |
| 84.73662953885 | 73 |
| 106.959346884146 | 72 |
| 98.9709974501049 | 87 |
| 113.205054714284 | 91 |
| 108.786403114674 | 82 |
| 106.114005303194 | 87 |
| 77.9798698169082 | 60 |
| 79.5732208915878 | 64 |
| 125.352200002672 | 94 |
| 117.868123724479 | 94 |
| 108.017754922723 | 93 |
| 85.8112382543045 | 73 |
| 116.278971600328 | 100 |
| 111.342973504707 | 97 |
| 131.38527869573 | 99 |
| 68.5684528427788 | 62 |
| 116.974402069933 | 97 |
| 116.373169593473 | 82 |
| 91.2707025218584 | 85 |
| 120.033914921634 | 84 |
| 86.348926934832 | 76 |
| 114.048033242306 | 89 |
| 82.3423033290117 | 76 |
| 81.2926930728417 | 96 |
| 81.1028880949423 | 79 |
| 87.8300527460745 | 84 |
| 95.6441627349638 | 79 |
| 84.8904753800191 | 74 |
| 85.3293090831129 | 80 |
| 109.44457604127 | 88 |
| 99.1609118182105 | 78 |
| 104.06507140769 | 93 |
| 125.373885861194 | 95 |
| 112.445942193352 | 81 |
| 109.379911958814 | 92 |
| 84.5782882236312 | 85 |
| 109.102497586777 | 93 |
| 104.824938307775 | 86 |
| 99.9505358422176 | 74 |
| 100.843944636103 | 80 |
| 107.600743413944 | 89 |
| 119.070645502658 | 99 |
| 114.349206547919 | 96 |
| 120.115800574465 | 98 |
| 114.751901339807 | 99 |
| 116.694065122301 | 96 |
| 105.222887190464 | 94 |
| 118.323757337932 | 89 |
| 106.229605123233 | 91 |
| 116.840376640457 | 92 |
| 100.152597871508 | 75 |
| 110.294936685733 | 86 |
| 123.105082505702 | 99 |
| 105.87322897051 | 85 |
| 101.661263252723 | 76 |
| 107.14333923663 | 94 |
| 104.645934444402 | 91 |
| 111.529821841963 | 96 |
| 101.167207540518 | 91 |
| 106.728309567675 | 93 |
| 107.902171943061 | 85 |
| 109.771679454956 | 92 |
| 97.0349909246755 | 87 |
| 125.501101738288 | 97 |
| 112.280622227367 | 91 |
| 94.4243902630238 | 89 |
| 109.952109480598 | 93 |
| 109.978368656118 | 86 |
| 117.48714154925 | 93 |
| 103.867085449282 | 75 |
| 103.371285910168 | 88 |
| 112.20461690797 | 93 |
| 115.411115311674 | 86 |
| 77.2399056875005 | 81 |
| 123.085297513799 | 94 |
| 101.483957020361 | 80 |
| 116.253998598341 | 88 |
| 127.78801701971 | 93 |
| 92.356743368871 | 81 |
| 91.6735963747975 | 76 |
| 126.251564776115 | 96 |
| 118.200091296381 | 96 |
| 126.951145248615 | 99 |
| 113.117521360063 | 100 |
| 122.101926316609 | 99 |
| 127.914803245951 | 100 |
| 141.182036166749 | 99 |
| 97.467674574907 | 80 |
| 102.944295485416 | 87 |
| 69.0591299465203 | 67 |
| 124.338505812131 | 89 |
| 110.360572245543 | 85 |
| 112.772781187731 | 88 |
| 130.337352343126 | 88 |
| 84.8307572321155 | 85 |
| 81.5526883715812 | 68 |
| 130.632289571994 | 95 |
| 99.3479168914764 | 86 |
| 92.0443464465993 | 70 |
| 101.293749418748 | 84 |
| 121.73293653664 | 92 |
| 124.003719405134 | 92 |
| 108.125117149312 | 86 |
| 117.449816500601 | 84 |
| 125.072020914683 | 90 |
| 139.581119729169 | 97 |
| 136.030835037307 | 95 |
| 112.715504792755 | 85 |
| 113.896303649807 | 78 |
| 112.009746599546 | 95 |
| 117.824088746181 | 79 |
| 137.285172853926 | 99 |
| 111.064326372564 | 90 |
| 122.563331212494 | 91 |
| 126.917106192926 | 94 |
| 99.4301202478639 | 81 |
| 121.953821228509 | 92 |
| 136.294388133633 | 94 |
| 107.250193758738 | 91 |
| 117.051991117566 | 93 |
| 87.8805528819748 | 77 |
| 118.058117849308 | 88 |
| 121.424030790696 | 96 |
| 125.260311941815 | 89 |
| 109.4306368837 | 96 |
| 112.514167540756 | 92 |
| 101.378810203148 | 82 |
| 126.758958218181 | 92 |
| 97.6166836173121 | 78 |
| 118.628498373955 | 84 |
| 145.512805528164 | 100 |
| 131.227620790329 | 99 |
| 140.507123010495 | 100 |
| 135.480526250817 | 99 |
| 136.048083988722 | 99 |
| 108.074559621275 | 95 |
| 142.956946390943 | 100 |
| 119.637757393532 | 86 |
| 133.787910147356 | 84 |
| 107.973764822236 | 74 |
| 129.731169501616 | 98 |
| 118.411296353536 | 86 |
| 127.534743202211 | 85 |
| 134.635858885853 | 94 |
| 116.466266356243 | 94 |
| 112.221043416516 | 88 |
| 122.725632121384 | 90 |
| 136.537270161273 | 93 |
| 117.894142708919 | 90 |
| 114.490380765709 | 85 |
| 118.935805997077 | 91 |
| 108.580050407979 | 95 |
| 127.676379459994 | 95 |
| 122.352194151006 | 95 |
| 125.192962599062 | 96 |
| 113.585144463176 | 90 |
| 136.738407430816 | 96 |
| 134.667134905894 | 94 |
| 113.408894796725 | 94 |
| 104.270727790474 | 84 |
| 118.009824435464 | 86 |
| 113.684334045366 | 87 |
| 108.735327139984 | 88 |
| 99.0412038290876 | 91 |
| 94.3385145785678 | 90 |
| 100.045864297154 | 88 |
| 116.569450635549 | 94 |
| 114.146125184198 | 93 |
| 106.322309886071 | 95 |
| 128.357009230959 | 94 |
| 120.655928707658 | 93 |
| 98.9702434286854 | 86 |
| 96.806798905858 | 94 |
| 107.178095515824 | 94 |
| 114.085776424126 | 93 |
| 108.537782879385 | 96 |
| 104.575483530475 | 94 |
| 143.761036676396 | 100 |
| 107.004717114165 | 91 |
| 93.7265824225904 | 85 |
| 109.797446881992 | 89 |
| 104.492248307976 | 86 |
| 104.612835700731 | 95 |
| 119.835296372799 | 100 |
| 120.437675012608 | 99 |
| 127.023196139103 | 93 |
| 115.423895830651 | 84 |
| 103.390085688869 | 92 |
| 102.780142061532 | 86 |
| 111.637985336422 | 85 |
| 98.7922316287028 | 83 |
| 86.9978779234333 | 81 |
| 118.936911258477 | 79 |
| 131.430230708843 | 95 |
| 102.003686121058 | 87 |
| 100.115668431975 | 83 |
| 113.952158600764 | 85 |
| 100.051986169968 | 77 |
| 103.34711981601 | 87 |
| 103.703160004003 | 89 |
| 84.0463875904388 | 73 |
| 88.1948330185199 | 74 |
| 96.6398494561198 | 81 |
| 110.358762566982 | 82 |
| 94.9760826126313 | 78 |
| 99.6458832399594 | 85 |
| 94.1167211384709 | 82 |
| 125.440405132891 | 91 |
| 106.429156287437 | 83 |
| 94.3336447536296 | 69 |
| 103.767318262062 | 86 |
| 89.1406851786732 | 81 |
| 99.8986630832803 | 89 |
| 100.168135597051 | 90 |
| 115.163338708092 | 84 |
| 87.039056643157 | 69 |
| 113.214592421411 | 79 |
| 107.581199340345 | 87 |
| 110.870856930119 | 90 |
| 122.74794937163 | 94 |
| 143.723219264682 | 97 |
| 110.529798127805 | 91 |
| 93.7221924023982 | 71 |
| 129.256324414714 | 97 |
| 133.846619825623 | 99 |
| 119.928278609347 | 86 |
| 126.035755352649 | 99 |
| 106.114357644501 | 100 |
| 112.271263861087 | 94 |
| 138.005493714174 | 100 |
| 135.91674922607 | 100 |
| 122.209451741523 | 100 |
| 103.893916311139 | 94 |
| 119.265714564237 | 95 |
| 93.6525475401007 | 75 |
| 105.575568575533 | 87 |
| 93.9313055437845 | 89 |
| 105.370182670358 | 82 |
| 74.9323871701231 | 70 |
| 127.260442997457 | 87 |
| 82.4478277764479 | 72 |
| 127.730967056862 | 93 |
| 126.241591415431 | 90 |
| 114.210519868158 | 96 |
| 143.075913518135 | 97 |
| 130.40653345036 | 92 |
| 123.539547752096 | 85 |
| 114.936001349146 | 88 |
| 101.270365354228 | 89 |
| 115.107600674488 | 88 |
| 125.954936564916 | 93 |
| 90.9387654372011 | 75 |
| 120.20998801835 | 88 |
| 99.4828955039164 | 86 |
| 126.695660325806 | 94 |
| 118.443785531043 | 91 |
| 90.6543575660305 | 78 |
| 90.0518254045028 | 84 |
| 85.9595933089282 | 80 |
| 94.8170050805031 | 79 |
| 113.544120613096 | 88 |
| 81.4483221643327 | 85 |
| 83.7477878067861 | 74 |
| 86.9131893971065 | 72 |
| 107.057290615445 | 91 |
| 114.715539266665 | 92 |
| 128.128806788913 | 92 |
| 96.6564646955533 | 61 |
| 113.374124244505 | 83 |
| 110.437334206389 | 86 |
| 107.389164196758 | 82 |
| 126.316403652303 | 84 |
| 121.261689617429 | 90 |
| 100.61207730994 | 90 |
| 115.914960709664 | 93 |
| 93.0147446287822 | 70 |
| 102.782866616146 | 93 |
| 111.363473274467 | 95 |
| 112.418861331856 | 87 |
| 103.149981435789 | 90 |
| 134.441300844897 | 94 |
| 125.927367677832 | 95 |
| 101.808147848428 | 73 |
| 121.923676271155 | 85 |
| 113.387342569972 | 97 |
| 124.523355106682 | 98 |
| 136.461648462754 | 97 |
| 129.044535132209 | 94 |
| 139.522925094771 | 100 |
| 136.259083724723 | 100 |
| 129.60922789352 | 100 |
| 132.583292797105 | 100 |
| 131.416091594106 | 99 |
| 109.167833900493 | 89 |
| 108.849517439771 | 87 |
| 113.095079181441 | 86 |
| 111.227487095774 | 83 |
| 107.41039377494 | 88 |
| 97.625269137724 | 82 |
| 124.141742398159 | 97 |
| 119.748899821025 | 77 |
| 125.467568609503 | 82 |
| 106.375052490105 | 89 |
| 118.081491915261 | 82 |
| 134.86718337643 | 96 |
| 117.456667527038 | 78 |
| 110.926740609174 | 93 |
| 102.590372468091 | 86 |
| 110.679327728708 | 90 |
| 121.366795858996 | 87 |
| 95.1138260715865 | 70 |
| 95.7004696532296 | 84 |
| 117.409228435795 | 84 |
| 115.753582953062 | 88 |
| 91.0525001054294 | 84 |
| 81.7544175230981 | 69 |
| 99.7843859475636 | 81 |
| 105.308931371648 | 82 |
| 101.232735533182 | 78 |
| 77.7280121083186 | 70 |
| 106.965353999437 | 79 |
| 95.2494096183724 | 89 |
| 94.1756205288506 | 69 |
| 143.053511963274 | 92 |
| 105.473396892681 | 75 |
| 105.991754023596 | 83 |
| 103.373318531197 | 79 |
| 112.92936707824 | 85 |
| 101.882254384688 | 86 |
| 98.6841108823734 | 81 |
| 106.748495385588 | 96 |
| 118.370758507384 | 91 |
| 77.6555755324894 | 77 |
| 127.798362832488 | 93 |
| 99.7655567784393 | 77 |
| 118.420054392092 | 97 |
| 97.4342345008166 | 90 |
| 79.1614585890485 | 87 |
| 96.835437416958 | 91 |
| 70.7172232530698 | 75 |
| 107.396538484604 | 88 |
| 126.868660937704 | 100 |
| 119.422840832357 | 93 |
| 137.578977286781 | 99 |
| 134.793644959271 | 98 |
| 116.567554818575 | 98 |
| 116.62110066162 | 99 |
| 121.871410981522 | 94 |
| 110.256756431538 | 87 |
| 111.440430542872 | 99 |
| 113.097125337921 | 98 |
| 100.385380182949 | 98 |
| 117.536746231347 | 95 |
| 131.509380130295 | 100 |
| 139.605443727303 | 99 |
| 118.805810459324 | 92 |
| 121.24230373647 | 89 |
| 123.581184334205 | 100 |
| 92.8179134953137 | 79 |
| 104.411891857997 | 85 |
| 112.666614329401 | 84 |
| 110.99942088534 | 86 |
| 118.647871827231 | 82 |
| 122.505199686553 | 96 |
| 89.223055345347 | 60 |
| 79.3250091878048 | 79 |
| 95.4509299150309 | 70 |
| 120.629367268582 | 83 |
| 101.943497719619 | 71 |
| 122.444659402964 | 89 |
| 79.772728786284 | 84 |
| 121.497456835527 | 87 |
| 82.9720979025293 | 75 |
| 109.998156037089 | 94 |
| 104.846883699734 | 91 |
| 121.530699939886 | 88 |
| 114.610468231427 | 90 |
| 108.509350346405 | 85 |
| 102.095475658636 | 78 |
| 113.562863397285 | 89 |
| 113.423816008401 | 87 |
| 120.304664756777 | 83 |
| 122.519836674575 | 96 |
| 85.4227222859559 | 83 |
| 114.64754895969 | 96 |
| 130.059483129597 | 97 |
| 128.392533251028 | 97 |
| 107.334563309482 | 91 |
| 131.702267906767 | 94 |
| 114.52869061702 | 93 |
| 92.4355089036623 | 78 |
| 131.447797445021 | 96 |
| 104.411481404969 | 83 |
| 111.875311489857 | 80 |
| 100.128668829012 | 89 |
| 110.531014213084 | 87 |
| 112.757236039837 | 84 |
| 105.151011471617 | 92 |
| 119.928996039257 | 99 |
| 102.409530825286 | 82 |
| 100.575934463599 | 86 |
| 75.2527835386591 | 68 |
| 114.455895882415 | 89 |
| 112.803735294 | 89 |
| 133.860763756728 | 98 |
| 104.784319210383 | 73 |
| 127.928566512579 | 94 |
| 106.481200262656 | 86 |
| 100.677952982321 | 81 |
| 95.8169096519602 | 84 |
| 113.172057011658 | 91 |
| 137.116195887211 | 96 |
| 118.093620438351 | 93 |
| 98.4083849556065 | 87 |
| 93.1813295871628 | 94 |
| 91.4289050064774 | 78 |
| 115.50522570706 | 95 |
| 113.710996573691 | 97 |
| 112.079848289646 | 93 |
| 97.2413596328206 | 93 |
| 85.746979968306 | 89 |
| 124.074027276561 | 93 |
| 102.147246909085 | 83 |
| 107.618572799275 | 88 |
| 108.538434138623 | 98 |
| 107.444333918841 | 95 |
| 123.382349008211 | 95 |
| 116.878555411201 | 100 |
| 137.946253220712 | 99 |
| 127.514082406826 | 99 |
| 120.573680545785 | 99 |
| 122.813795419707 | 95 |
| 119.12837970011 | 100 |
| 132.698352394868 | 95 |
| 102.838011736183 | 98 |
| 107.610493211327 | 96 |
| 126.839380574436 | 95 |
| 108.435621245797 | 94 |
| 117.165747413556 | 100 |
| 125.952146995045 | 99 |
| 113.101828800909 | 97 |
| 98.6682820194587 | 100 |
| 105.446519868642 | 100 |
| 110.671373851903 | 100 |
| 126.451783659626 | 99 |
| 106.546501548108 | 100 |
| 97.4886806723775 | 93 |
| 113.804131261833 | 99 |
| 104.138840941931 | 94 |
| 102.494678635182 | 100 |
| 102.004484795089 | 93 |
| 109.848552231777 | 99 |
| 99.3636657553522 | 100 |
| 116.405422599703 | 98 |
| 128.68732735589 | 97 |
| 113.459744090643 | 98 |
| 113.744289933357 | 91 |
| 85.5638283937378 | 75 |
| 110.868140328459 | 85 |
| 95.720508504072 | 87 |
| 111.689561618552 | 92 |
| 96.9350502933096 | 76 |
| 122.376610746585 | 94 |
| 101.360441253974 | 98 |
| 95.6064031521278 | 88 |
| 102.384756985073 | 88 |
| 110.632021020584 | 91 |
| 137.43983445546 | 95 |
| 111.231672733753 | 98 |
| 124.636484128313 | 92 |
| 113.986808640173 | 97 |
| 111.636307670174 | 90 |
| 113.863406292081 | 88 |
| 97.0358654525703 | 80 |
| 116.131776761749 | 89 |
| 117.44280455285 | 94 |
| 96.2165152094996 | 78 |
| 79.391386498652 | 79 |
| 116.242288184042 | 92 |
| 118.558964437369 | 93 |
| 96.703247322949 | 91 |
| 134.91691214818 | 98 |
| 104.412505240316 | 93 |
| 105.045685042963 | 83 |
| 106.087543264663 | 86 |
| 101.919767995829 | 87 |
| 119.768985103082 | 90 |
| 140.234692415423 | 99 |
| 139.757127504879 | 99 |
| 127.858240552988 | 97 |
| 120.820594075892 | 88 |
| 104.405079903337 | 90 |
| 131.072731708037 | 99 |
| 119.496301338695 | 93 |
| 123.862786836329 | 91 |
| 133.676579488118 | 100 |
| 109.455101715824 | 92 |
| 119.521042541434 | 92 |
| 99.959119561508 | 85 |
| 116.980574035064 | 87 |
| 133.550565505855 | 97 |
| 115.670014898364 | 96 |
| 104.50349538837 | 85 |
| 114.678522723493 | 89 |
| 128.530663562691 | 100 |
| 123.041779970074 | 98 |
| 95.8372549001641 | 88 |
| 109.531440754474 | 91 |
| 96.8400362057025 | 94 |
| 94.4988243439973 | 83 |
| 96.9297651878525 | 92 |
| 103.404571540384 | 96 |
| 92.0438794753419 | 86 |
| 100.525706554592 | 89 |
| 99.8886252752906 | 82 |
| 86.3773967885869 | 86 |
| 99.8911390660571 | 77 |
| 101.114753979947 | 86 |
| 97.1412902104718 | 86 |
| 108.422702583022 | 95 |
| 96.5944927083154 | 96 |
| 69.0541730053963 | 76 |
| 102.715127602148 | 91 |
| 91.7583222026508 | 68 |
| 91.371967609865 | 88 |
| 120.607035972125 | 98 |
| 113.315554292962 | 95 |
| 112.112975941669 | 94 |
| 105.8049020672 | 91 |
| 101.240487512882 | 93 |
| 106.763765440378 | 89 |
| 95.3646890982293 | 90 |
| 97.7848442636557 | 78 |
| 98.6020447272919 | 77 |
| 92.1706721120697 | 91 |
| 100.319299568575 | 89 |
| 110.982843387229 | 88 |
| 96.5039512131232 | 86 |
| 105.608812287451 | 96 |
| 105.498869045541 | 97 |
| 106.831901704651 | 93 |
| 80.0545698731466 | 87 |
| 100.285565917069 | 92 |
| 104.460826587876 | 80 |
| 92.5369625029093 | 84 |
| 102.061322474444 | 89 |
| 97.9824599711384 | 86 |
| 115.554328291817 | 79 |
| 97.365838276667 | 78 |
| 70.8992069731961 | 63 |
| 143.472363191931 | 100 |
| 121.669853483808 | 96 |
| 126.029300380119 | 97 |
| 113.843561196132 | 87 |
| 103.864954152657 | 84 |
| 120.069748531981 | 95 |
| 132.993360423462 | 94 |
| 123.532744094236 | 98 |
| 123.300044882474 | 97 |
| 90.7256676879803 | 84 |
| 113.982965855082 | 92 |
| 75.1469591299916 | 91 |
| 102.237858005606 | 100 |
| 105.161408786348 | 88 |
| 84.8377716600223 | 81 |
| 76.2795159390381 | 89 |
| 112.21422904554 | 88 |
| 118.768970331815 | 88 |
| 114.035834385969 | 91 |
| 104.373948588306 | 84 |
| 104.864919976182 | 85 |
| 99.6674563566459 | 85 |
| 130.972182496226 | 96 |
| 107.200073980147 | 84 |
| 112.966353856229 | 94 |
| 108.248356191633 | 97 |
| 103.898032251185 | 82 |
| 113.279866787203 | 88 |
| 104.865188976723 | 91 |
| 107.725919033173 | 88 |
| 112.160478205377 | 93 |
| 132.208665578601 | 99 |
| 100.735608335257 | 92 |
| 101.847469597568 | 87 |
| 123.537752574048 | 89 |
| 104.582450600558 | 88 |
| 100.917773897611 | 100 |
| 118.914040693833 | 98 |
| 101.40953351599 | 88 |
| 114.301243631501 | 98 |
| 106.337745618268 | 85 |
| 103.533014780823 | 79 |
| 124.504678953614 | 97 |
| 121.540374239525 | 95 |
| 138.042351069997 | 91 |
| 131.812600371395 | 99 |
| 115.573640591653 | 93 |
| 94.6160902389577 | 82 |
| 129.215629634102 | 95 |
| 126.931084258265 | 93 |
| 104.742526941713 | 95 |
| 120.118624790957 | 89 |
| 104.485002648539 | 91 |
| 113.309472480504 | 91 |
| 95.543810153454 | 78 |
| 84.8509219909175 | 62 |
| 102.406235592183 | 86 |
| 132.414338746971 | 85 |
| 112.721270152578 | 91 |
| 116.191912869898 | 90 |
| 110.832827495545 | 92 |
| 117.660606016797 | 93 |
| 97.4359161575714 | 76 |
| 99.1824402539888 | 89 |
| 109.665836230007 | 82 |
| 84.1255432034378 | 72 |
| 113.864688009902 | 100 |
| 130.735934982819 | 94 |
| 112.11231077146 | 91 |
| 110.679780379743 | 98 |
| 86.4561287653899 | 87 |
| 112.949991269157 | 89 |
| 99.4027032469409 | 86 |
| 110.981213434791 | 93 |
| 110.092171633082 | 92 |
| 105.157845879867 | 81 |
| 105.569770079445 | 85 |
| 98.4318832052279 | 87 |
| 92.748298714376 | 83 |
| 83.8824959696796 | 76 |
| 132.397354381806 | 98 |
| 114.612552351569 | 99 |
| 100.863768217656 | 92 |
| 134.422041997607 | 100 |
| 135.767080263133 | 98 |
| 111.712848562474 | 94 |
| 128.949343308489 | 96 |
| 114.266263109936 | 97 |
| 119.111574647234 | 98 |
| 111.046061876544 | 83 |
| 139.312450880317 | 95 |
| 128.170737797436 | 98 |
| 118.349577430738 | 90 |
| 70.6833659068673 | 83 |
| 91.1510669696764 | 88 |
| 92.7787114893044 | 90 |
| 75.2404953729814 | 75 |
| 124.346303812175 | 97 |
| 103.027514705697 | 79 |
| 119.400962581608 | 89 |
| 72.761062808125 | 89 |
| 112.299493468342 | 88 |
| 119.768842932185 | 94 |
| 115.728612618681 | 94 |
| 138.804054871976 | 91 |
| 124.604116628597 | 89 |
| 96.2122540604399 | 80 |
| 77.9509574732929 | 65 |
| 124.555610575289 | 96 |
| 141.595611482745 | 95 |
| 101.042854219816 | 85 |
| 118.344108346601 | 90 |
| 77.8797356877355 | 69 |
| 92.4469861963736 | 88 |
| 124.295745770771 | 94 |
| 111.648955396276 | 82 |
| 110.250500944136 | 86 |
| 102.202419519127 | 75 |
| 88.6885496833279 | 75 |
| 105.251828742291 | 83 |
| 121.374211191156 | 95 |
| 135.491122600895 | 98 |
| 110.334074711046 | 90 |
| 114.093232424804 | 92 |
| 121.471490523147 | 93 |
| 106.793425602224 | 86 |
| 103.550785465857 | 83 |
| 103.52759559907 | 77 |
| 133.241560550776 | 96 |
| 109.651291067399 | 88 |
| 131.082626431569 | 98 |
| 134.112181558574 | 90 |
| 131.752009918657 | 91 |
| 94.9498755032747 | 71 |
| 109.708124504981 | 83 |
| 144.048041146134 | 99 |
| 123.911135533432 | 96 |
| 105.672105430785 | 97 |
| 120.632449478786 | 99 |
| 129.40908751725 | 100 |
| 108.573559691486 | 93 |
| 118.620823871072 | 90 |
| 111.321840965499 | 89 |
| 101.399625775301 | 79 |
| 131.030944392443 | 87 |
| 127.942242481252 | 96 |
| 81.3968268612701 | 87 |
| 95.3261253763219 | 85 |
| 129.94898174478 | 95 |
| 89.5676067842028 | 71 |
| 116.90372612938 | 88 |
| 147.811368681007 | 100 |
| 100.819588771167 | 85 |
| 118.802363290587 | 89 |
| 124.759114945502 | 92 |
| 115.868031311914 | 86 |
| 109.27206246391 | 93 |
| 90.370375831945 | 82 |
| 116.515862615853 | 92 |
| 117.253833449607 | 86 |
| 115.956160133298 | 100 |
| 96.0958299301644 | 72 |
| 110.521332566279 | 87 |
| 100.935960925067 | 87 |
| 111.577534602529 | 94 |
| 112.047821784666 | 93 |
| 102.844025717032 | 86 |
| 111.905451384002 | 95 |
| 86.7536857968832 | 94 |
| 94.8373827954449 | 80 |
| 106.202261563265 | 91 |
| 108.200444536039 | 100 |
| 104.770690852529 | 97 |
| 102.776898012593 | 96 |
| 91.6917809930066 | 84 |
| 97.6322592699128 | 93 |
| 102.709946918433 | 90 |
| 96.9450283550272 | 92 |
| 95.4405505968807 | 86 |
| 106.872632801011 | 77 |
| 103.510662071345 | 93 |
| 109.576450449683 | 94 |
| 100.877282928801 | 99 |
| 93.1257395356454 | 72 |
| 110.611538005906 | 93 |
| 104.234662530178 | 87 |
| 104.898659506176 | 88 |
| 93.0716131091321 | 89 |
| 112.883515263555 | 90 |
| 86.9415567834951 | 80 |
| 111.795261155222 | 74 |
| 105.785835229912 | 86 |
| 108.876678741792 | 82 |
| 102.394755439003 | 95 |
| 108.771135087968 | 96 |
| 99.7294508814843 | 82 |
| 91.8551170975721 | 84 |
| 103.93078178461 | 96 |
| 116.082352646048 | 91 |
| 102.931057612299 | 98 |
| 107.16164241069 | 92 |
| 96.0370028802153 | 77 |
| 104.10402541018 | 86 |
| 100.334450074845 | 100 |
| 104.902997062367 | 86 |
| 104.003561634096 | 97 |
| 97.152273721567 | 85 |
| 96.5410028530165 | 92 |
| 102.81895922327 | 95 |
| 105.288853579667 | 90 |
| 104.391510721438 | 100 |
| 106.161240717051 | 93 |
| 115.114922494846 | 98 |
| 108.860309318964 | 100 |
| 108.839172626838 | 100 |
| 100.023068309158 | 95 |
| 104.670587784977 | 88 |
| 111.481255602469 | 85 |
| 108.190859060183 | 98 |
| 92.7205995118152 | 91 |
| 102.190812198606 | 88 |
| 103.8651971767 | 94 |
| 106.120456754961 | 86 |
| 93.9281108601504 | 81 |
| 99.3667703333635 | 93 |
| 109.621893492342 | 92 |
| 108.185955811171 | 87 |
| 106.219876903954 | 94 |
| 106.241502640447 | 85 |
| 110.877236060112 | 85 |
| 117.722521701623 | 95 |
| 108.408543572248 | 93 |
| 117.127108627977 | 91 |
| 104.396156621265 | 84 |
| 120.702612879611 | 97 |
| 116.023625535658 | 78 |
| 104.838346032042 | 85 |
| 110.722110354629 | 84 |
| 93.7094893130132 | 88 |
| 112.282325570961 | 90 |
| 76.3458138981539 | 84 |
| 116.564004249379 | 96 |
| 103.741135042181 | 88 |
| 98.9031535343213 | 92 |
| 97.7205035166398 | 85 |
| 107.233559186483 | 83 |
| 102.406953065578 | 83 |
| 105.277665425004 | 90 |
| 96.1691820532642 | 92 |
| 104.650666406147 | 86 |
| 115.854200071507 | 86 |
| 103.261672735788 | 86 |
| 87.4149453336814 | 97 |
| 88.8024740153515 | 83 |
| 100.586717222894 | 80 |
| 99.2051033600544 | 83 |
| 86.9879854912648 | 80 |
| 110.786397976812 | 94 |
| 106.276729745557 | 91 |
| 124.380966227854 | 90 |
| 89.6225611766827 | 84 |
| 117.083363247936 | 95 |
| 110.975771850201 | 89 |
| 87.6331405546048 | 86 |
| 99.6756324014516 | 82 |
| 115.736648453519 | 89 |
| 112.712437554688 | 97 |
| 117.299443581667 | 85 |
| 80.019069807036 | 71 |
| 100.832771388694 | 89 |
| 102.483688413798 | 91 |
| 129.660547436119 | 99 |
| 66.6064527952781 | 72 |
| 108.7937069339 | 100 |
| 105.418750885914 | 86 |
| 109.440132018694 | 80 |
| 101.851842504077 | 95 |
| 103.951767355242 | 94 |
| 108.068312110834 | 87 |
| 93.3283379726051 | 85 |
| 102.134321287953 | 83 |
| 107.75464676024 | 96 |
| 102.901481745778 | 100 |
| 73.8312664888991 | 62 |
| 88.1163448960881 | 74 |
| 101.053600380451 | 88 |
| 85.0524255767398 | 67 |
| 115.622885022855 | 98 |
| 117.897754132163 | 94 |
| 116.52932330055 | 99 |
| 118.218747531831 | 96 |
| 115.356866978668 | 96 |
| 97.3383491387753 | 79 |
| 105.396453402536 | 87 |
| 102.3702015627 | 77 |
| 101.389338105171 | 90 |
| 104.039048429637 | 91 |
| 111.805992074592 | 92 |
| 109.322502523904 | 89 |
| 103.742284199326 | 91 |
| 67.5754942647092 | 75 |
| 66.5645234691988 | 86 |
| 95.9519989513478 | 82 |
| 108.035692183244 | 84 |
| 96.9592379295707 | 90 |
| 101.342698097392 | 94 |
| 102.947334285944 | 88 |
| 89.8716426553185 | 85 |
| 109.825257309875 | 91 |
| 102.756884997218 | 98 |
| 122.394388631315 | 98 |
| 94.2017311227785 | 83 |
| 81.2588929552216 | 82 |
| 102.359089129687 | 82 |
| 120.259619377717 | 88 |
| 108.872669966985 | 99 |
| 90.7154604027716 | 70 |
| 103.39530250991 | 86 |
| 88.4170154742255 | 83 |
| 103.480921011737 | 85 |
| 93.0658836631346 | 82 |
| 81.9670050175339 | 77 |
| 98.8440934626293 | 84 |
| 86.8539497267967 | 84 |
| 71.5703970490223 | 77 |
| 87.8018607348177 | 84 |
| 69.2283073513564 | 67 |
| 114.870578886251 | 85 |
| 116.7584783411 | 91 |
| 102.096973651203 | 83 |
| 118.747724426258 | 99 |
| 98.4539430545411 | 88 |
| 112.089433740948 | 97 |
| 104.579718696585 | 97 |
| 117.87491698584 | 99 |
| 98.5919239167616 | 91 |
| 121.158649731133 | 95 |
| 85.1701487330539 | 74 |
| 84.2700337755472 | 78 |
| 100.374858723359 | 85 |
| 117.220611563385 | 92 |
| 109.009391686445 | 95 |
| 97.812834641958 | 93 |
| 100.948824538579 | 83 |
| 111.597336111193 | 78 |
| 114.561233311185 | 100 |
| 108.539835756218 | 89 |
| 88.7803820900225 | 70 |
| 111.361749343038 | 99 |
| 96.0804438667281 | 79 |
| 108.934889801986 | 96 |
| 104.921922233682 | 94 |
| 104.659357126434 | 90 |
| 110.550484962581 | 97 |
| 102.370998335391 | 87 |
| 101.445932028469 | 98 |
| 101.666752945944 | 94 |
| 102.320235029219 | 100 |
| 99.1151803011591 | 98 |
| 95.7559429951025 | 97 |
| 107.274965118859 | 92 |
| 112.742004848015 | 95 |
| 101.2397798276 | 94 |
| 104.909820888384 | 96 |
| 109.534558051413 | 98 |
| 108.504120070735 | 100 |
| 110.841293916455 | 100 |
| 111.349328909047 | 99 |
| 99.7366236823582 | 95 |
| 92.8634394314897 | 97 |
| 118.713520368131 | 95 |
| 112.520711439394 | 90 |
| 96.5001921006016 | 87 |
| 99.7091753487008 | 85 |
| 120.682162248094 | 89 |
| 101.869373779088 | 77 |
| 131.924409254693 | 92 |
| 122.076709076614 | 89 |
| 115.184084166462 | 84 |
| 141.846310578184 | 97 |
| 118.723819869436 | 92 |
| 127.267589083944 | 93 |
| 99.3488166542919 | 97 |
| 119.157115373436 | 85 |
| 117.696269181872 | 90 |
| 111.635957089013 | 98 |
| 129.932527092819 | 94 |
| 103.803908340047 | 91 |
| 125.611801300077 | 97 |
| 111.375887506431 | 90 |
| 112.292055909525 | 95 |
| 122.603039509423 | 94 |
| 116.012459332358 | 97 |
| 122.143513662588 | 99 |
| 104.884529579896 | 99 |
| 122.052256091145 | 95 |
| 104.402786355154 | 93 |
| 101.141536779783 | 95 |
| 123.17767009402 | 96 |
| 118.666195633223 | 95 |
| 112.785149936538 | 100 |
| 89.1400024338339 | 88 |
| 110.295428056891 | 71 |
| 125.966880955677 | 92 |
| 110.717159636544 | 98 |
| 100.665005743875 | 92 |
| 107.022343160465 | 98 |
| 117.765692869818 | 97 |
| 110.001501761503 | 95 |
| 107.440098698427 | 93 |
| 116.320255391993 | 96 |
| 124.913781364691 | 96 |
| 123.448465181948 | 99 |
| 103.080680105906 | 88 |
| 101.718954627278 | 93 |
| 114.26735752152 | 97 |
| 110.281092164718 | 94 |
| 111.355361632138 | 96 |
| 101.279307444129 | 93 |
| 116.04530920798 | 99 |
| 115.132796177076 | 99 |
| 113.683107296693 | 99 |
| 99.6201889658795 | 95 |
| 128.952454901947 | 96 |
| 109.18041423982 | 78 |
| 80.2553850481945 | 70 |
| 140.732955995826 | 92 |
| 66.7756095119898 | 71 |
| 108.524874166652 | 91 |
| 111.135252535132 | 94 |
| 111.71666211809 | 86 |
| 104.743091914047 | 82 |
| 94.2115906189744 | 84 |
| 107.545358483602 | 87 |
| 71.6097910151572 | 71 |
| 90.5773813245587 | 79 |
| 103.628154786855 | 87 |
| 111.487568000722 | 93 |
| 116.304858129919 | 92 |
| 89.2219088185033 | 80 |
| 109.509461199094 | 94 |
| 132.391222759911 | 99 |
| 102.654144661001 | 87 |
| 105.08557762346 | 74 |
| 98.9834431941323 | 69 |
| 114.368430652528 | 95 |
| 93.7162418521367 | 81 |
| 102.022207868955 | 88 |
| 106.192855487044 | 81 |
| 128.046842539887 | 94 |
| 123.095462288546 | 89 |
| 74.3413993455465 | 76 |
| 100.787026147732 | 70 |
| 104.12916914653 | 85 |
| 72.516864151798 | 68 |
| 88.0785455127986 | 89 |
| 117.551923655145 | 91 |
| 98.8444968300881 | 90 |
| 117.320443863461 | 91 |
| 114.798842243683 | 95 |
| 116.916176238879 | 89 |
| 117.242117280076 | 91 |
| 84.8976518826197 | 84 |
| 97.5748070289655 | 93 |
| 140.793008794095 | 92 |
| 129.390865776691 | 94 |
| 131.323618605391 | 98 |
| 118.776898166315 | 92 |
| 121.577226092171 | 93 |
| 94.6882393599772 | 90 |
| 92.0152741944231 | 83 |
| 118.929756862304 | 99 |
| 107.075747399905 | 93 |
| 113.828345111071 | 98 |
| 143.051369140148 | 100 |
| 136.65763399727 | 99 |
| 134.845755450671 | 98 |
| 140.721983383664 | 100 |
| 123.406093455767 | 95 |
| 137.834543566162 | 99 |
| 135.010247690494 | 93 |
| 135.812099757546 | 99 |
| 100.83055253694 | 96 |
| 130.795346869068 | 100 |
| 126.52229077367 | 98 |
| 133.110724920457 | 98 |
| 118.0268503782 | 91 |
| 131.867408984225 | 97 |
| 114.297559112192 | 86 |
| 132.003311535382 | 79 |
| 107.846776960611 | 94 |
| 126.962420730037 | 95 |
| 110.617945740159 | 81 |
| 130.836882433295 | 100 |
| 122.652999704096 | 99 |
| 125.960902388299 | 96 |
| 111.385699533109 | 78 |
| 123.562477819997 | 97 |
| 112.516843803502 | 94 |
| 114.167612899521 | 94 |
| 113.811978263212 | 98 |
| 110.664227377544 | 93 |
| 119.810350129274 | 93 |
| 109.176329678096 | 93 |
| 109.792964016137 | 94 |
| 111.106732658852 | 83 |
| 109.854219355872 | 97 |
| 101.503632237397 | 83 |
| 106.170098016083 | 88 |
| 87.5298755572595 | 86 |
| 95.7505803495255 | 80 |
| 87.9222952271149 | 88 |
| 97.5237958397374 | 88 |
| 97.4343953373881 | 90 |
| 99.7649408909378 | 85 |
| 119.274732732254 | 94 |
| 104.740645626638 | 83 |
| 111.633771095635 | 92 |
| 87.9916334217006 | 60 |
| 103.299200910192 | 72 |
| 121.012590732151 | 88 |
| 121.781938405471 | 91 |
| 91.2304959198256 | 74 |
| 104.200161379866 | 93 |
| 97.4824693817911 | 81 |
| 84.8667058068311 | 86 |
| 115.964446732482 | 86 |
| 138.079240731993 | 99 |
| 125.203390466405 | 98 |
| 111.511720244077 | 100 |
| 107.346144515219 | 89 |
| 96.0838188277715 | 78 |
| 107.731295987373 | 91 |
| 95.2988945368461 | 71 |
| 88.0956390745436 | 83 |
| 90.9840196526183 | 90 |
| 84.8267127918746 | 83 |
| 78.6329733648952 | 66 |
| 81.0573220993228 | 89 |
| 105.471380935648 | 95 |
| 73.201001859227 | 77 |
| 102.179935397189 | 90 |
| 91.9387866480774 | 96 |
| 115.627870142425 | 93 |
| 108.858006959346 | 92 |
| 78.5192359752222 | 87 |
| 122.766532492852 | 92 |
| 120.667859330554 | 95 |
| 88.0451083291011 | 77 |
| 90.9042870680054 | 81 |
| 99.1108567251993 | 80 |
| 75.4319322698512 | 95 |
| 87.805069710997 | 99 |
| 107.146683552818 | 79 |
| 128.757907970013 | 99 |
| 137.301658280625 | 98 |
| 113.925609170457 | 90 |
| 100.115684047432 | 90 |
| 130.910276495917 | 98 |
| 129.75254589318 | 98 |
| 114.141480518958 | 91 |
| 88.8253014020862 | 68 |
| 127.801104690837 | 97 |
| 114.528404357616 | 90 |
| 106.742542472251 | 89 |
| 80.8968043220106 | 87 |
| 116.736025195536 | 87 |
| 92.0063443084977 | 74 |
| 101.992405846431 | 95 |
| 117.283085442042 | 95 |
| 105.824955038329 | 89 |
| 114.782106416773 | 93 |
| 119.83540353713 | 98 |
| 88.2366156751604 | 77 |
| 94.3002764913559 | 81 |
| 105.32703598306 | 93 |
| 117.109989267187 | 85 |
| 128.005693342106 | 98 |
| 110.730767749744 | 91 |
| 102.389102050577 | 88 |
| 99.073146698865 | 95 |
| 97.3839329817371 | 83 |
| 108.93629634398 | 92 |
| 117.847215844855 | 96 |
| 105.782983480632 | 95 |
| 108.577473734713 | 92 |
| 106.721621598527 | 80 |
| 102.824180614953 | 87 |
| 107.87967800513 | 95 |
| 100.801717385359 | 93 |
| 117.633602935928 | 91 |
| 112.327428614224 | 90 |
| 110.845950048261 | 100 |
| 110.659566759096 | 81 |
| 101.176609990253 | 84 |
| 89.0362637805587 | 75 |
| 97.4145798463977 | 89 |
| 103.888422447359 | 86 |
| 94.9977657404913 | 83 |
| 97.340511719633 | 92 |
| 96.5247438235837 | 82 |
| 106.048387643032 | 78 |
| 103.232773342609 | 88 |
| 103.554324573024 | 90 |
| 100.000823537308 | 95 |
| 91.5561704506117 | 76 |
| 94.9911553678653 | 84 |
| 102.453144187034 | 93 |
| 98.7522660962333 | 82 |
| 85.1565404800282 | 91 |
| 94.0896145392096 | 89 |
| 92.8690920183452 | 69 |
| 101.791735698437 | 88 |
| 88.7354164297379 | 83 |
| 87.262112185411 | 76 |
| 95.104161350835 | 87 |
| 97.638849827073 | 78 |
| 103.239987021585 | 85 |
| 82.644220985421 | 64 |
| 95.210304756515 | 84 |
| 99.6999902650577 | 85 |
| 94.0054525610255 | 78 |
| 113.702797321851 | 92 |
| 109.769072287632 | 90 |
| 105.319388242116 | 95 |
| 111.0643993256 | 89 |
| 116.906879419554 | 97 |
| 106.751093096505 | 97 |
| 120.968383530435 | 96 |
| 113.394484990017 | 95 |
| 110.298763508381 | 100 |
| 115.196432840718 | 93 |
| 128.069548116633 | 93 |
| 102.348082783379 | 95 |
| 117.728017822276 | 92 |
| 94.5363169228626 | 82 |
| 90.732964284935 | 91 |
| 99.2143008825905 | 89 |
| 105.014532547041 | 88 |
| 111.348938857812 | 92 |
| 93.6624110193179 | 96 |
| 101.539540377 | 77 |
| 118.695339101417 | 94 |
| 98.9438012370444 | 89 |
| 88.7392854470668 | 86 |
| 96.7176000605838 | 79 |
| 88.4697458892181 | 69 |
| 115.404229751814 | 95 |
| 84.2574060514001 | 77 |
| 112.220875202926 | 89 |
| 62.6923459620288 | 71 |
| 98.6569290361395 | 78 |
| 65.973459702475 | 61 |
| 116.882377810963 | 95 |
| 124.798598735824 | 100 |
| 102.557576656129 | 100 |
| 119.17942235064 | 96 |
| 106.406267633874 | 91 |
| 105.882305086457 | 92 |
| 106.688564985365 | 96 |
| 111.319309437495 | 94 |
| 102.264403117085 | 100 |
| 113.426059026035 | 96 |
| 106.731402089085 | 99 |
| 107.2991516903 | 100 |
| 113.595553977795 | 96 |
| 118.56058794528 | 94 |
| 103.695385779102 | 100 |
| 102.856987546975 | 100 |
| 103.116000005772 | 100 |
| 99.9129945102607 | 97 |
| 102.317016218649 | 98 |
| 93.137896697025 | 98 |
| 96.0392750093509 | 100 |
| 107.392948433499 | 100 |
| 106.426225878153 | 96 |
| 105.864485797009 | 99 |
| 100.980778042035 | 98 |
| 102.573972988837 | 96 |
| 109.765995369647 | 99 |
| 102.205791465115 | 97 |
| 95.1675072293451 | 76 |
| 104.62546444897 | 92 |
| 86.3555868851283 | 78 |
| 91.7045377148825 | 85 |
| 112.351975220653 | 81 |
| 99.2217510321673 | 87 |
| 109.918835628773 | 91 |
| 113.984422803865 | 91 |
| 115.47421924654 | 93 |
| 84.9348430283098 | 78 |
| 124.500446810499 | 98 |
| 116.817071529684 | 93 |
| 105.568470061874 | 88 |
| 91.4371274355408 | 86 |
| 111.118840516917 | 91 |
| 118.60724250521 | 97 |
| 97.135022326723 | 85 |
| 116.760699370853 | 91 |
| 82.0611395768216 | 81 |
| 77.5078152103438 | 91 |
| 99.8381788144275 | 91 |
| 102.319955100523 | 94 |
| 84.9556378865845 | 86 |
| 87.6887292879317 | 74 |
| 115.325851417115 | 96 |
| 104.20664380555 | 94 |
| 101.297489721733 | 94 |
| 109.424466395468 | 94 |
| 134.478102475476 | 100 |
| 122.186240833693 | 98 |
| 136.733598880595 | 99 |
| 112.54005255383 | 99 |
| 114.569681972788 | 100 |
| 127.335491149321 | 100 |
| 121.891847739242 | 93 |
| 118.669802710656 | 98 |
| 115.388161496226 | 96 |
| 106.801211812585 | 88 |
| 103.447381660638 | 90 |
| 96.0990064210322 | 93 |
| 97.9258104044242 | 99 |
| 94.5346443741243 | 84 |
| 99.2336623322336 | 92 |
| 96.7762649993489 | 78 |
| 101.93600521702 | 77 |
| 98.138804804524 | 95 |
| 106.849587537878 | 89 |
| 94.7069371271983 | 85 |
| 100.536803656359 | 90 |
| 89.6781486262305 | 93 |
| 118.639507565546 | 94 |
| 99.2090252574839 | 86 |
| 94.7452651313797 | 97 |
| 97.3882060387975 | 85 |
| 96.0852902420823 | 89 |
| 96.9215385282005 | 85 |
| 110.87373995682 | 92 |
| 101.037911804469 | 92 |
| 105.056540204303 | 92 |
| 95.0366294488917 | 90 |
| 95.9742279380331 | 89 |
| 105.565590576833 | 88 |
| 96.3221583257694 | 98 |
| 99.7100216462115 | 89 |
| 104.927801289745 | 96 |
| 99.2560532480572 | 93 |
| 112.300358593674 | 85 |
| 105.834051279988 | 93 |
| 105.321077064645 | 89 |
| 108.647053262778 | 95 |
| 106.454454517037 | 97 |
| 103.41724767559 | 99 |
| 112.386594289485 | 94 |
| 104.73347751244 | 100 |
| 106.166216290644 | 97 |
| 99.8394483395722 | 98 |
| 111.308128575505 | 100 |
| 82.0810940151046 | 80 |
| 112.287373107462 | 85 |
| 99.4231470022932 | 92 |
| 98.123441569368 | 98 |
| 98.864271980427 | 87 |
| 110.58374899831 | 95 |
| 102.269648547035 | 91 |
| 98.7883152279097 | 85 |
| 96.0125007129408 | 92 |
| 95.1512607426451 | 89 |
| 95.073311793389 | 81 |
| 100.757577660771 | 100 |
| 86.9356254072047 | 82 |
| 97.3367852103109 | 91 |
| 98.9227393257098 | 89 |
| 120.295840225765 | 100 |
| 117.091725566506 | 99 |
| 113.755701145428 | 100 |
| 109.792447945449 | 96 |
| 118.228035387196 | 92 |
| 103.379937562117 | 100 |
| 93.0646003955389 | 100 |
| 117.364001067763 | 81 |
| 95.579579696946 | 84 |
| 101.695236180758 | 92 |
| 106.879779761102 | 89 |
| 94.938134986141 | 90 |
| 98.0433092258896 | 86 |
| 88.812099827838 | 84 |
| 93.3192275396481 | 89 |
| 88.3776114437399 | 100 |
| 98.8894849817349 | 94 |
| 97.5532536398309 | 71 |
| 110.708141161264 | 91 |
| 75.0203394820521 | 88 |
| 121.424716510944 | 96 |
| 114.998391416907 | 98 |
| 86.2004936911703 | 80 |
| 98.6768249682014 | 92 |
| 94.3445111708343 | 80 |
| 101.422602634403 | 90 |
| 106.977361849888 | 97 |
| 90.5069370422974 | 84 |
| 125.495030403779 | 92 |
| 92.8728618940767 | 87 |
| 71.5949120868858 | 81 |
| 118.672677519023 | 99 |
| 132.739365632176 | 98 |
| 107.84088553728 | 100 |
| 108.734904500892 | 99 |
| 112.213018807259 | 99 |
| 108.807291338267 | 96 |
| 98.0219287858629 | 100 |
| 116.879861825845 | 100 |
| 103.609424097913 | 86 |
| 108.619239742982 | 97 |
| 101.810660172886 | 92 |
| 111.400359498837 | 90 |
| 105.962066780998 | 88 |
| 95.3831400473186 | 77 |
| 79.3228456179368 | 80 |
| 109.068649039002 | 91 |
| 64.6795117187943 | 95 |
| 84.1203947137582 | 81 |
| 88.9593707830002 | 82 |
| 97.8687163447028 | 92 |
| 109.37480648944 | 100 |
| 88.7497552850739 | 81 |
| 107.522518857613 | 99 |
| 85.621792905425 | 98 |
| 93.6089642248818 | 82 |
| 85.1018591506733 | 91 |
| 99.6462150723212 | 94 |
| 94.7374371073655 | 88 |
| 121.746043789913 | 99 |
| 90.0460162280032 | 93 |
| 108.710203439078 | 100 |
| 131.448936038819 | 99 |
| 128.662432871513 | 100 |
| 75.0398176142321 | 79 |
| 97.7361713973213 | 85 |
| 110.984184832953 | 98 |
| 93.2524458463878 | 86 |
| 96.7425815210443 | 97 |
| 92.8791033194129 | 90 |
| 102.126590981949 | 93 |
| 90.2156810879733 | 97 |
| 99.4996075031915 | 90 |
| 91.2774902892929 | 88 |
| 90.3241025914207 | 92 |
| 107.404314430462 | 98 |
| 107.865213636199 | 85 |
| 98.743185789017 | 87 |
| 76.1455986132493 | 88 |
| 83.8459369278009 | 78 |
| 92.545549513001 | 75 |
| 91.3440394457402 | 76 |
| 96.2594625270605 | 82 |
| 96.0398144412534 | 88 |
| 116.646664151187 | 88 |
| 90.7013879736343 | 85 |
| 103.255997286208 | 96 |
| 90.8099040956948 | 91 |
| 87.9187947460187 | 95 |
| 91.8625081415713 | 81 |
| 111.147018165878 | 100 |
| 102.842802353234 | 100 |
| 112.285586153966 | 98 |
| 96.998528011126 | 98 |
| 110.14553989306 | 93 |
| 93.1028934550558 | 89 |
| 105.397825791494 | 95 |
| 104.008064585668 | 87 |
| 114.763283265661 | 89 |
| 100.98159213342 | 90 |
| 100.181853519487 | 84 |
| 101.022163805907 | 93 |
| 93.1366914064066 | 90 |
| 92.052314952776 | 79 |
| 116.982957491751 | 98 |
| 105.234856550459 | 93 |
| 94.4839457428563 | 99 |
| 96.2738281070091 | 100 |
| 110.678621729002 | 98 |
| 104.203917703575 | 91 |
| 100.428649264615 | 100 |
| 97.6880042757337 | 93 |
| 94.2269075226709 | 95 |
| 93.2650382834238 | 91 |
| 104.17884868346 | 91 |
| 112.618881236441 | 95 |
| 90.8550484709332 | 88 |
| 98.5891926104511 | 91 |
| 85.6359428665351 | 92 |
| 100.347280359298 | 100 |
| 111.061192533037 | 100 |
| 108.306702791604 | 81 |
| 106.700324112111 | 92 |
| 107.792631003476 | 95 |
| 95.9231476392905 | 95 |
| 101.746512937782 | 98 |
| 93.7699690966019 | 89 |
| 108.883935711123 | 91 |
| 106.361096097617 | 93 |
| 108.345373891749 | 98 |
| 124.916323975718 | 100 |
| 105.581921096472 | 100 |
| 112.150946751569 | 86 |
| 98.0222930465015 | 83 |
| 103.742850960858 | 96 |
| 98.6677033366702 | 91 |
| 99.9322795698252 | 87 |
| 94.832268771239 | 86 |
| 103.407377344578 | 87 |
| 114.354538398403 | 88 |
| 102.0054150251 | 92 |
| 118.832021479033 | 96 |
| 106.476396204593 | 87 |
| 105.015916468134 | 88 |
| 104.145760540155 | 90 |
| 114.731786855207 | 93 |
| 114.969271423537 | 85 |
| 105.113638907016 | 86 |
| 113.499441848976 | 99 |
| 115.234494017952 | 96 |
| 70.3209858567225 | 88 |
| 127.790236798179 | 95 |
| 106.292853547776 | 93 |
| 89.4630533712222 | 76 |
| 100.014498470287 | 76 |
| 84.7877052206698 | 89 |
| 113.248816221268 | 93 |
| 120.975275323924 | 87 |
| 104.495397930433 | 90 |
| 82.5454739277164 | 90 |
| 139.572727584297 | 100 |
| 112.850223584969 | 95 |
| 92.267568009213 | 61 |
| 75.3305695134502 | 82 |
| 99.2085373122571 | 94 |
| 113.03547454842 | 95 |
| 98.7005730845651 | 80 |
| 91.7547380874792 | 86 |
| 91.9458165667791 | 84 |
| 82.6817926052939 | 81 |
| 106.291865348583 | 97 |
| 137.069735496687 | 100 |
| 111.613529599827 | 95 |
| 117.856256550861 | 99 |
| 109.747796591977 | 95 |
| 74.7179990550844 | 84 |
| 95.4769180119895 | 93 |
| 75.5456511608999 | 71 |
| 122.413587904028 | 95 |
| 91.5534724598803 | 81 |
| 85.9456807815742 | 73 |
| 97.8951002841636 | 79 |
| 109.423613002142 | 87 |
| 118.502704354953 | 89 |
| 99.9441567054706 | 92 |
| 106.582871976397 | 92 |
| 112.46739076959 | 92 |
| 97.0264568389306 | 89 |
| 83.8995828170172 | 84 |
| 113.940599302072 | 92 |
| 108.489903676946 | 86 |
| 125.746476641814 | 96 |
| 130.13208288116 | 91 |
| 79.1194641798892 | 89 |
| 108.635535117191 | 96 |
| 113.137235512797 | 94 |
| 119.034061056165 | 95 |
| 99.148788420843 | 98 |
| 114.330757433898 | 85 |
| 137.337813896875 | 100 |
| 126.139836801039 | 99 |
| 93.8096646273164 | 88 |
| 112.531254662447 | 95 |
| 93.7383972676667 | 84 |
| 107.575674577342 | 86 |
| 83.4665730505548 | 84 |
| 97.1896267478808 | 86 |
| 84.5469741412554 | 93 |
| 90.6659815663825 | 79 |
| 96.8919996461753 | 87 |
| 99.8049336981492 | 91 |
| 92.340258401234 | 78 |
| 84.8564870585883 | 90 |
| 95.622917253979 | 87 |
| 95.7961285024854 | 97 |
| 115.706237666249 | 97 |
| 95.1092149306149 | 92 |
| 97.0813018715643 | 95 |
| 114.504107196 | 100 |
| 108.36403655304 | 86 |
| 81.9300086712755 | 75 |
| 106.259597982819 | 93 |
| 92.0500071266073 | 83 |
| 105.757772530254 | 95 |
| 102.57368709086 | 89 |
| 100.804151943497 | 86 |
| 98.8010808547667 | 84 |
| 99.3251111734506 | 90 |
| 109.745143111221 | 94 |
| 96.2785477296117 | 100 |
| 119.774713765099 | 93 |
| 119.443482873088 | 89 |
| 114.680554403238 | 94 |
| 93.5561000822275 | 88 |
| 109.324879206376 | 80 |
| 98.4270086521164 | 93 |
| 100.582628202656 | 91 |
| 110.019343565009 | 96 |
| 96.66646454152 | 80 |
| 106.441057147702 | 90 |
| 91.5683229994578 | 95 |
| 100.857812179798 | 92 |
| 105.854619741362 | 100 |
| 107.084566692178 | 92 |
| 107.592420676567 | 91 |
| 91.5832712088264 | 93 |
| 115.583443845101 | 91 |
| 120.478154272821 | 93 |
| 97.0686172389515 | 93 |
| 114.236795401941 | 88 |
| 101.790946493597 | 93 |
| 75.5171245886227 | 81 |
| 103.270421528998 | 96 |
| 132.688450415108 | 99 |
| 109.730448403238 | 99 |
| 111.574834084347 | 99 |
| 110.307254453027 | 92 |
| 120.187845112685 | 100 |
| 110.104886011059 | 89 |
| 103.369263508657 | 94 |
| 116.183319839104 | 96 |
| 111.845973066737 | 97 |
| 109.876823065497 | 100 |
| 121.688822095756 | 98 |
| 103.321155260001 | 98 |
| 107.544537065415 | 98 |
| 125.178305011024 | 96 |
| 106.569894943599 | 99 |
| 101.076820634413 | 95 |
| 105.582752965502 | 100 |
| 104.788916021799 | 91 |
| 101.278194544975 | 97 |
| 102.438370220176 | 100 |
| 100.09853788402 | 93 |
| 103.90364403558 | 90 |
| 106.215504540157 | 94 |
| 104.226953144612 | 84 |
| 107.263310059429 | 82 |
| 105.110329560877 | 96 |
| 126.126094120093 | 97 |
| 103.817926021961 | 91 |
| 96.1695255739604 | 73 |
| 102.693846877557 | 96 |
| 107.539991231628 | 96 |
| 94.4009678056151 | 90 |
| 101.999532094543 | 96 |
| 103.668538015741 | 98 |
| 98.8998425561379 | 95 |
| 109.361448769799 | 99 |
| 99.0081931511219 | 93 |
| 109.609304816871 | 93 |
| 98.2038472707309 | 91 |
| 102.292761183148 | 99 |
| 98.5219757390128 | 88 |
| 114.334330178742 | 96 |
| 103.195338965881 | 94 |
| 114.965529687265 | 96 |
| 102.484560518451 | 97 |
| 86.5986553961355 | 78 |
| 129.415356445027 | 99 |
| 114.877510922473 | 97 |
| 100.810250939958 | 94 |
| 122.69980368776 | 95 |
| 116.363685801845 | 99 |
| 115.22088736036 | 93 |
| 130.283541180517 | 100 |
| 116.173647147299 | 98 |
| 111.884021569366 | 98 |
| 115.726745130301 | 99 |
| 104.939980645592 | 87 |
| 107.097075465343 | 88 |
| 93.1186841074802 | 86 |
| 108.35967091657 | 97 |
| 102.721720918029 | 92 |
| 112.931398155749 | 97 |
| 112.36356609018 | 97 |
| 76.2361048076059 | 74 |
| 91.955123366525 | 86 |
| 98.7227355509373 | 88 |
| 100.498342933001 | 96 |
| 98.3116554571466 | 85 |
| 104.006233342487 | 87 |
| 82.1641232414283 | 87 |
| 101.580653096347 | 76 |
| 58.4626984527195 | 74 |
| 121.786554997987 | 95 |
| 105.545342525143 | 84 |
| 99.602471881572 | 94 |
| 110.993062723436 | 100 |
| 112.352658662287 | 99 |
| 79.5919944493048 | 75 |
| 72.7533703786716 | 57 |
| 75.7207106603318 | 82 |
| 103.088438589625 | 87 |
| 101.326539898627 | 92 |
| 114.150405310657 | 92 |
| 89.0770559093602 | 83 |
| 116.364333678912 | 92 |
| 111.466463165392 | 90 |
| 88.8049911065858 | 77 |
| 99.1423911184531 | 88 |
| 93.6066535462278 | 88 |
| 92.6423341467011 | 86 |
| 87.5233429870844 | 87 |
| 113.987969381601 | 93 |
| 111.426949817958 | 93 |
| 112.596405595621 | 95 |
| 97.25664622989 | 84 |
| 104.22084599444 | 87 |
| 92.1665692784772 | 82 |
| 81.0512042123006 | 73 |
| 90.5101712407839 | 94 |
| 85.0585874507605 | 79 |
| 101.986097500708 | 82 |
| 88.5789135611569 | 75 |
| 90.3920867935488 | 94 |
| 104.311910233586 | 92 |
| 71.0483195069133 | 77 |
| 92.8629379808054 | 89 |
| 99.0387282870974 | 91 |
| 125.640599470413 | 90 |
| 85.3174919481488 | 84 |
| 121.906227903463 | 92 |
| 100.647227296486 | 92 |
| 124.681536023032 | 90 |
| 115.562760535539 | 92 |
| 94.9270102656975 | 77 |
| 99.2227299826835 | 99 |
| 103.271987764968 | 90 |
| 109.028678447026 | 91 |
| 103.841276361711 | 87 |
| 112.364737417134 | 85 |
| 92.8625971683212 | 90 |
| 78.4372269531644 | 92 |
| 96.0015867229905 | 86 |
| 99.7399765073951 | 95 |
| 77.1759583005416 | 85 |
| 79.4389773465239 | 95 |
| 102.058782189292 | 95 |
| 72.5870888713041 | 83 |
| 103.091255992259 | 78 |
| 98.6733047269743 | 86 |
| 93.4423063653624 | 85 |
| 103.678385082706 | 89 |
| 84.2710658357972 | 73 |
| 106.233751223975 | 93 |
| 96.0729186289666 | 90 |
| 74.591925056281 | 81 |
| 97.7783976354383 | 92 |
| 115.36658439653 | 88 |
| 120.452363541915 | 95 |
| 101.042568381704 | 87 |
| 104.538089149859 | 83 |
| 90.3510397545832 | 75 |
| 103.699863747116 | 88 |
| 99.9684600988764 | 92 |
| 98.2405304652566 | 91 |
| 112.964063246289 | 93 |
| 132.257706784448 | 98 |
| 130.402635672121 | 96 |
| 107.528853539 | 96 |
| 123.631236773243 | 99 |
| 117.569506789019 | 95 |
| 127.439797860765 | 100 |
| 120.033730413144 | 100 |
| 99.9531284434441 | 91 |
| 65.8728209043738 | 88 |
| 78.394413628231 | 84 |
| 96.7523513525297 | 94 |
| 114.154836204959 | 93 |
| 110.059241016265 | 90 |
| 96.4862579354327 | 97 |
| 104.702646049088 | 92 |
| 113.900503542505 | 90 |
| 96.713932110811 | 93 |
| 102.668394697252 | 93 |
| 96.8891390250156 | 95 |
| 104.996951232869 | 83 |
| 107.377213380576 | 86 |
| 96.0392953415099 | 91 |
| 124.96322853141 | 90 |
| 117.255619222224 | 88 |
| 85.7366159846685 | 62 |
| 103.075921529365 | 87 |
| 95.5558609882876 | 76 |
| 105.599433940859 | 91 |
| 100.764614533838 | 79 |
| 100.934661435846 | 98 |
| 100.136654702533 | 91 |
| 95.3638461307994 | 92 |
| 108.499598941022 | 90 |
| 94.1041450974459 | 76 |
| 105.919993819934 | 86 |
| 81.5969229697127 | 68 |
| 72.5973455098707 | 71 |
| 90.4584555964599 | 85 |
| 109.34220239265 | 98 |
| 79.7804064107329 | 85 |
| 79.8616912960201 | 74 |
| 75.2873627033515 | 74 |
| 93.7070144099977 | 100 |
| 121.699463698728 | 93 |
| 83.1415267681989 | 89 |
| 70.6286662297483 | 75 |
| 90.3620661341193 | 87 |
| 111.559314152111 | 93 |
| 98.1381522165722 | 91 |
| 75.5275736533413 | 81 |
| 90.1481875917289 | 86 |
| 93.2027005270466 | 92 |
| 89.6348826695971 | 92 |
| 74.7901813151101 | 78 |
| 109.657151881138 | 90 |
| 85.3029604041221 | 92 |
| 117.22639390848 | 88 |
| 90.1687758284783 | 85 |
| 87.0004183852581 | 88 |
| 90.3505948285349 | 76 |
| 80.203592649834 | 79 |
| 120.384619705375 | 97 |
| 91.6449902935362 | 80 |
| 110.545950034485 | 89 |
| 62.7233217399871 | 79 |
| 65.4960258833739 | 73 |
| 83.5813001543247 | 85 |
| 91.4647227031552 | 90 |
| 119.004745213972 | 95 |
| 101.836128134169 | 91 |
| 87.6102841046899 | 76 |
| 76.6885293903204 | 75 |
| 91.7461322436893 | 85 |
| 85.7552708348949 | 86 |
| 75.3780565393062 | 82 |
| 111.8339950289 | 93 |
| 73.5385404888902 | 76 |
| 104.286769426678 | 90 |
| 91.893974153308 | 87 |
| 83.6276997582104 | 72 |
| 87.6346156191431 | 83 |
| 85.5502522199052 | 91 |
| 99.0512029976755 | 100 |
| 125.368064333245 | 99 |
| 128.552501840799 | 100 |
| 112.587708243735 | 100 |
| 128.77265951303 | 97 |
| 114.117951843724 | 100 |
| 115.192924398789 | 100 |
| 139.569747298618 | 99 |
| 115.142793400792 | 100 |
| 112.89101471274 | 100 |
| 122.264677132434 | 97 |
| 111.073830594436 | 98 |
| 114.451745793649 | 97 |
| 110.357007633027 | 100 |
| 108.498742181637 | 98 |
| 133.21204052902 | 99 |
| 95.6416982421188 | 100 |
| 114.441323958152 | 98 |
| 106.958015398209 | 98 |
| 106.265648739604 | 98 |
| 105.733195168771 | 99 |
| 121.077791216653 | 97 |
| 108.84461669309 | 98 |
| 91.9115018467425 | 92 |
| 130.864653974171 | 99 |
| 109.096898999499 | 100 |
| 96.4462524627411 | 96 |
| 132.652553327131 | 99 |
| 95.6709550342102 | 99 |
| 91.2044431436336 | 100 |
| 93.6346113893467 | 86 |
| 115.723191141963 | 96 |
| 118.650764177447 | 99 |
| 107.172000469811 | 95 |
| 116.109124494859 | 100 |
| 107.630305434334 | 99 |
| 110.488819366812 | 100 |
| 139.587512558724 | 94 |
| 117.184997306617 | 100 |
| 87.3503993866978 | 93 |
| 80.8220233872896 | 90 |
| 87.1909553314679 | 78 |
| 100.039064491316 | 89 |
| 87.1929667766491 | 80 |
| 93.4545121301811 | 77 |
| 80.3412177286608 | 78 |
| 107.693602738753 | 82 |
| 107.277198094216 | 83 |
| 103.961024819521 | 96 |
| 109.37331952417 | 96 |
| 125.496509777591 | 94 |
| 119.028820812305 | 93 |
| 112.372719150997 | 86 |
| 102.106379628255 | 93 |
| 89.0994874780038 | 77 |
| 107.180128023027 | 92 |
| 97.1745219824883 | 90 |
| 96.7115593967891 | 87 |
| 91.4021290755532 | 85 |
| 91.1581216865223 | 91 |
| 102.733185895211 | 97 |
| 78.1746853433767 | 80 |
| 88.8976153870328 | 89 |
| 89.9529025008047 | 86 |
| 108.334912876669 | 93 |
| 87.4614186545195 | 81 |
| 65.5784620941346 | 54 |
| 119.111245774102 | 92 |
| 114.301401720678 | 93 |
| 111.068470498288 | 93 |
| 101.418297501242 | 96 |
| 84.8258301491957 | 79 |
| 90.9828573543567 | 80 |
| 84.3529864813135 | 63 |
| 72.6418655913189 | 78 |
| 95.3388575684612 | 85 |
| 92.406366430507 | 79 |
| 105.827012512269 | 88 |
| 90.2212251630849 | 87 |
| 108.155188946204 | 95 |
| 78.6956405302074 | 74 |
| 105.382681463906 | 85 |
| 72.1882500705708 | 84 |
| 82.0069586114768 | 97 |
| 110.208854513403 | 96 |
| 65.6015638202229 | 74 |
| 106.151292968364 | 90 |
| 90.7009465921367 | 85 |
| 96.3143671633403 | 87 |
| 88.0901388170974 | 90 |
| 94.5734241907357 | 90 |
| 85.9897621674822 | 87 |
| 67.3254904383264 | 67 |
| 99.5000625085506 | 90 |
| 97.9414870216343 | 87 |
| 65.7774816939402 | 73 |
| 121.412892504998 | 97 |
| 105.048267511046 | 89 |
| 81.3940375434386 | 67 |
| 115.086313815003 | 93 |
| 70.0596923306893 | 86 |
| 81.2562803192629 | 83 |
| 110.374506698563 | 90 |
| 73.4501188472616 | 81 |
| 87.4876483383157 | 85 |
| 80.4472024528172 | 67 |
| 100.125009883112 | 93 |
| 68.7591528329717 | 70 |
| 73.0408470433839 | 84 |
| 77.5061886184199 | 91 |
| 81.5242055280652 | 71 |
| 91.4116862314138 | 79 |
| 80.440230200975 | 73 |
| 77.3708799645217 | 78 |
| 62.4375848599656 | 78 |
| 106.381450264154 | 87 |
| 67.9643591039827 | 82 |
| 88.7921384945312 | 76 |
| 84.9113310781711 | 79 |
| 77.8768190143103 | 81 |
| 80.8534783720599 | 81 |
| 101.794253889633 | 91 |
| 76.9267810276615 | 76 |
| 86.1152478237766 | 83 |
| 76.8319753831531 | 67 |
| 73.2323786487824 | 82 |
| 103.585015065993 | 96 |
| 112.441907559747 | 96 |
| 82.005337011098 | 74 |
| 89.228047229131 | 99 |
| 70.9705156090398 | 78 |
| 119.585133649959 | 98 |
| 102.293039946847 | 96 |
| 77.5546458907886 | 75 |
| 89.9609434156765 | 79 |
| 102.704252908441 | 90 |
| 79.1925708267729 | 71 |
| 86.6688511965668 | 73 |
| 96.9832128890918 | 80 |
| 87.4259568337898 | 90 |
| 120.108292207248 | 91 |
| 89.9451450033002 | 78 |
| 77.6739101716741 | 70 |
| 108.956925354964 | 98 |
| 103.960255195166 | 98 |
| 82.2395454477386 | 85 |
| 91.4458348257203 | 93 |
| 98.564041942647 | 94 |
| 96.2267388390621 | 86 |
| 96.1938341692149 | 86 |
| 92.5789982702814 | 86 |
| 94.4982280004524 | 87 |
| 111.306449780054 | 100 |
| 89.4190017424721 | 95 |
| 123.445639304561 | 90 |
| 103.276940245865 | 100 |
| 86.1068433262535 | 88 |
| 81.3730331020928 | 81 |
| 98.6419191971664 | 78 |
| 106.254315841454 | 81 |
| 121.995846799387 | 93 |
| 81.1866338552128 | 93 |
| 71.8714124673142 | 74 |
| 88.9547687557521 | 84 |
| 102.917222126381 | 98 |
| 113.23572203289 | 84 |
| 115.620502151348 | 90 |
| 122.198610976727 | 91 |
| 99.2798692097425 | 88 |
| 97.7946892644439 | 89 |
| 91.4325355761967 | 91 |
| 81.4219323890101 | 79 |
| 93.7669062124506 | 88 |
| 77.0002761674536 | 74 |
| 82.5450331532655 | 84 |
| 139.447376189782 | 100 |
| 102.098105805838 | 95 |
| 80.7444483534482 | 81 |
| 80.2214088141083 | 82 |
| 135.991100218057 | 100 |
| 127.317094397904 | 100 |
| 109.341886658846 | 80 |
| 106.933414401068 | 98 |
| 135.298280438531 | 99 |
| 89.3159848389067 | 100 |
| 121.162786633154 | 99 |
| 99.3056397417616 | 75 |
| 125.2592397262 | 97 |
| 125.479173476815 | 100 |
| 130.028506111497 | 96 |
| 112.205792296903 | 99 |
| 140.429100349418 | 100 |
| 144.266347417663 | 100 |
| 111.475954896214 | 99 |
| 124.995549752779 | 100 |
| 117.051092626181 | 99 |
| 136.334520234504 | 100 |
| 104.457976026802 | 98 |
| 88.7888318600972 | 83 |
| 120.18458098269 | 94 |
| 103.797387132972 | 95 |
| 112.170793095519 | 83 |
| 85.6654780421503 | 95 |
| 108.255310692635 | 95 |
| 91.0226628341588 | 96 |
| 98.9369808155561 | 94 |
| 74.3463441511422 | 79 |
| 113.05089578072 | 94 |
| 99.7039779308763 | 95 |
| 112.369960579248 | 99 |
| 84.5817832667615 | 77 |
| 89.808541238151 | 91 |
| 84.678107303347 | 91 |
| 81.3485056919254 | 87 |
| 111.481722890917 | 99 |
| 81.3810095015395 | 80 |
| 129.169145358484 | 99 |
| 107.718710658762 | 95 |
| 80.2827944178966 | 92 |
| 109.628055227459 | 98 |
| 80.1579848846518 | 84 |
| 113.100168442833 | 93 |
| 81.7057433809404 | 77 |
| 66.7302925335954 | 69 |
| 101.785570472176 | 92 |
| 103.937682478256 | 81 |
| 92.0310597810593 | 83 |
| 95.8074915924165 | 91 |
| 85.0059671729645 | 70 |
| 107.649367953439 | 88 |
| 97.7831099631357 | 67 |
| 116.671967179432 | 83 |
| 107.597859557687 | 87 |
| 123.198932186025 | 96 |
| 116.367672105773 | 97 |
| 130.657029071858 | 99 |
| 128.341364924729 | 99 |
| 116.782921009765 | 99 |
| 138.222443030966 | 100 |
| 114.214715045119 | 95 |
| 112.475374206397 | 91 |
| 111.702101813443 | 100 |
| 101.69766858516 | 88 |
| 75.2893048320102 | 78 |
| 82.8152363893606 | 85 |
| 86.5311881700212 | 86 |
| 89.7459927691818 | 74 |
| 110.701572791474 | 77 |
| 97.5808107978071 | 92 |
| 79.1670941503114 | 75 |
| 84.358457146378 | 81 |
| 125.479361734618 | 98 |
| 105.232636430428 | 82 |
| 96.6875313176804 | 87 |
| 99.2115582059953 | 83 |
| 97.8248853793735 | 91 |
| 107.563569023468 | 82 |
| 86.4547778347284 | 76 |
| 93.7000162323266 | 79 |
| 101.090995684481 | 76 |
| 113.247625934109 | 88 |
| 122.024369664897 | 91 |
| 92.4841036943199 | 80 |
| 103.979407138685 | 82 |
| 106.027885273863 | 78 |
| 123.22014522289 | 94 |
| 106.788947482245 | 73 |
| 107.193066862975 | 90 |
| 99.3982217403019 | 81 |
| 94.0644521836851 | 80 |
| 98.0646505165284 | 82 |
| 105.781522143485 | 84 |
| 89.4155311920365 | 73 |
| 87.4760005067274 | 77 |
| 102.96622123613 | 76 |
| 101.538214916471 | 90 |
| 126.63371776344 | 90 |
| 77.0314977469015 | 90 |
| 85.7499014549016 | 82 |
| 122.419962735296 | 80 |
| 103.623035716746 | 92 |
| 94.2091975199797 | 86 |
| 124.46422331601 | 91 |
| 109.694739964927 | 86 |
| 104.277199371273 | 82 |
| 88.6417068173669 | 78 |
| 110.392784077262 | 80 |
| 109.942201725388 | 93 |
| 110.774469215314 | 86 |
| 131.228398189778 | 97 |
| 106.534528890589 | 86 |
| 114.105157818242 | 86 |
| 106.296505272086 | 84 |
| 98.7387971981844 | 91 |
| 94.2872518401919 | 81 |
| 109.639261180372 | 84 |
| 107.140258066664 | 88 |
| 100.449736941669 | 86 |
| 103.220309993287 | 78 |
| 93.1799466685649 | 81 |
| 96.1674333308618 | 94 |
| 100.450572274123 | 94 |
| 96.4650149126265 | 92 |
| 99.6311768454993 | 91 |
| 96.5676000787264 | 100 |
| 105.371433176072 | 95 |
| 100.577826720062 | 85 |
| 92.3006221949765 | 83 |
| 95.4227289015776 | 96 |
| 92.7412885864518 | 73 |
| 108.650368505298 | 93 |
| 98.7726370365781 | 90 |
| 80.1426950093057 | 79 |
| 106.29020862694 | 97 |
| 103.97357490244 | 94 |
| 105.959990502592 | 89 |
| 106.369621851079 | 94 |
| 92.0070433647576 | 86 |
| 108.452446575067 | 94 |
| 117.377001564746 | 97 |
| 91.9875425227932 | 80 |
| 95.0450307533139 | 82 |
| 96.5498394219276 | 100 |
| 95.9905883826931 | 87 |
| 92.8025019088976 | 90 |
| 98.1583577343418 | 88 |
| 67.6639608417591 | 89 |
| 118.888422127702 | 98 |
| 112.038990904334 | 97 |
| 116.061775948819 | 100 |
| 107.753987031404 | 93 |
| 113.671525196622 | 100 |
| 89.4834043078742 | 88 |
| 95.4403181394458 | 94 |
| 91.5522061587132 | 98 |
| 104.377887795816 | 85 |
| 109.911008245468 | 99 |
| 77.5257543259202 | 83 |
| 90.6696582291915 | 94 |
| 93.8581562897496 | 90 |
| 95.3448589628723 | 87 |
| 83.970856453421 | 76 |
| 90.5695288348193 | 76 |
| 108.056512303468 | 90 |
| 80.586029063889 | 98 |
| 61.8022415752127 | 96 |
| 83.5453998058606 | 86 |
| 94.4909630993574 | 85 |
| 103.471066596515 | 91 |
| 83.3373959125718 | 99 |
| 90.7635172614551 | 92 |
| 92.5639825490307 | 85 |
| 86.7988751220598 | 92 |
| 84.1912542105911 | 73 |
| 94.8992393348723 | 92 |
| 88.0917587643729 | 98 |
| 96.2869028982789 | 87 |
| 79.4291754158998 | 89 |
| 91.8824096636279 | 94 |
| 95.7559505620477 | 97 |
| 89.6416938330845 | 88 |
| 86.7688789891967 | 91 |
| 98.1659376809396 | 86 |
| 81.0163015860286 | 88 |
| 102.317197140008 | 99 |
| 73.8245216299575 | 94 |
| 104.295700102757 | 98 |
| 81.7729570677808 | 88 |
| 98.5555523978789 | 91 |
| 93.4422469007893 | 93 |
| 83.8667210461703 | 93 |
| 99.9891366762705 | 95 |
| 84.5448725196196 | 86 |
| 91.4911254020638 | 88 |
| 76.1566036032654 | 84 |
| 108.36845806262 | 97 |
| 121.155661498396 | 94 |
| 97.4041800928931 | 92 |
| 94.4171370938103 | 95 |
| 93.9873248916819 | 98 |
| 82.0668517483213 | 81 |
| 93.2675726131335 | 84 |
| 105.667120384302 | 88 |
| 86.5112762818829 | 94 |
| 96.745599146501 | 99 |
| 78.6384791702423 | 79 |
| 99.8254125146922 | 94 |
| 87.2555128600943 | 94 |
| 86.4681514481749 | 94 |
| 114.784359895476 | 100 |
| 128.333619647639 | 99 |
| 105.071977677539 | 100 |
| 121.567688570711 | 99 |
| 106.164962655851 | 99 |
| 109.035868631429 | 100 |
| 116.038724303073 | 99 |
| 120.092677675204 | 100 |
| 94.8407698376865 | 98 |
| 107.328057418294 | 100 |
| 130.752310001881 | 100 |
| 111.990340957259 | 99 |
| 120.646063169136 | 98 |
| 106.893891862365 | 97 |
| 101.557634907282 | 96 |
| 114.766043901859 | 100 |
| 111.724000854553 | 98 |
| 107.307192976684 | 99 |
| 102.271930045104 | 97 |
| 107.057781700727 | 100 |
| 117.011616775796 | 99 |
| 97.1791759713018 | 100 |
| 109.297568204959 | 97 |
| 83.9546923843119 | 79 |
| 85.0701773681094 | 85 |
| 85.7484343011055 | 88 |
| 95.0049079188593 | 92 |
| 92.9505910274805 | 88 |
| 88.7855489687233 | 88 |
| 87.0300429022466 | 93 |
| 69.7974152606953 | 88 |
| 118.218545995166 | 99 |
| 76.4351576463625 | 85 |
| 82.0047161617509 | 79 |
| 76.4792097610565 | 88 |
| 87.501136505165 | 94 |
| 76.5535047627126 | 93 |
| 80.0367896702929 | 92 |
| 81.7278713521431 | 86 |
| 111.722270673849 | 95 |
| 83.5991919564682 | 93 |
| 91.2843456497302 | 94 |
| 99.4605426468299 | 86 |
| 86.0247183751588 | 80 |
| 91.4225181174334 | 90 |
| 85.4390119069101 | 97 |
| 93.116231438397 | 96 |
| 91.5598662849178 | 90 |
| 66.7963891785015 | 85 |
| 87.1691481939137 | 87 |
| 107.976677956977 | 92 |
| 83.2323339438581 | 86 |
| 78.5909261891805 | 82 |
| 92.4594856446734 | 72 |
| 75.7540183926705 | 79 |
| 96.1170550163424 | 89 |
| 84.2634780178102 | 81 |
| 100.216472219091 | 87 |
| 104.315267482056 | 92 |
| 90.5651316989952 | 86 |
| 110.769559368596 | 99 |
| 105.242412929033 | 92 |
| 97.495173120932 | 92 |
| 88.3671787216885 | 89 |
| 97.3829871796078 | 94 |
| 73.4529167019231 | 79 |
| 88.8975824233167 | 85 |
| 97.5040797716062 | 91 |
| 91.2886411437111 | 96 |
| 75.5703176838519 | 81 |
| 83.5645029318773 | 92 |
| 85.5715837985421 | 84 |
| 91.9735123874096 | 81 |
| 96.715274528466 | 93 |
| 107.868756454226 | 90 |
| 104.973454084758 | 97 |
| 85.9066027250608 | 89 |
| 87.1299945330984 | 91 |
| 84.1697579714596 | 91 |
| 83.0834909234356 | 90 |
| 91.2807998098361 | 92 |
| 92.3722077160189 | 95 |
| 104.212819187967 | 91 |
| 96.2349494501681 | 97 |
| 83.5686704608902 | 96 |
| 80.4217685980299 | 86 |
| 84.500889896394 | 92 |
| 90.3290535377653 | 93 |
| 124.357073535546 | 99 |
| 113.64121195147 | 99 |
| 132.240371554161 | 100 |
| 130.36828572775 | 100 |
| 125.078772630839 | 99 |
| 122.752029922811 | 98 |
| 91.4085241343382 | 93 |
| 110.660727615835 | 97 |
| 78.4132006882747 | 79 |
| 87.427919125607 | 80 |
| 114.108180474555 | 92 |
| 115.630681834222 | 94 |
| 108.47942935005 | 96 |
| 115.307578096699 | 95 |
| 117.17846019848 | 93 |
| 114.020534879116 | 95 |
| 110.00155579238 | 95 |
| 103.179089540681 | 95 |
| 100.866093323791 | 97 |
| 113.183014279567 | 93 |
| 97.670014898133 | 80 |
| 113.647291374501 | 96 |
| 103.12375823848 | 87 |
| 90.1524208600969 | 93 |
| 107.015299383676 | 88 |
| 123.255907917812 | 98 |
| 95.9736924165304 | 87 |
| 116.194312727291 | 93 |
| 113.8963618409 | 94 |
| 116.251294779208 | 91 |
| 108.7066019208 | 87 |
| 141.644558695183 | 100 |
| 109.449896206825 | 81 |
| 110.227729182794 | 98 |
| 107.460874535117 | 96 |
| 113.959242647818 | 93 |
| 114.715145977129 | 90 |
| 76.0200963627142 | 73 |
| 117.629728628708 | 93 |
| 132.596443133555 | 93 |
| 99.5258373736799 | 75 |
| 99.7689421568927 | 92 |
| 102.68111061017 | 83 |
| 75.59295984384 | 72 |
| 88.926310225832 | 83 |
| 109.712084752523 | 79 |
| 99.0670482230905 | 80 |
| 99.3349489683407 | 90 |
| 106.941082135493 | 90 |
| 117.995120347045 | 89 |
| 125.364592318158 | 96 |
| 105.869371200013 | 85 |
| 94.9767726951926 | 90 |
| 78.7630928710264 | 79 |
| 97.1053366099985 | 86 |
| 74.9692587417165 | 81 |
| 98.6300445285308 | 95 |
| 117.467259912489 | 83 |
| 102.673837598255 | 84 |
| 112.465971967337 | 86 |
| 121.42610205283 | 100 |
| 125.815524498072 | 100 |
| 113.017846129395 | 96 |
| 113.236818303961 | 100 |
| 124.212360831381 | 99 |
| 89.6474590051564 | 87 |
| 113.66084538783 | 95 |
| 99.5476097038781 | 84 |
| 111.902923618445 | 89 |
| 107.607735583292 | 97 |
| 107.217099710391 | 98 |
| 105.038349233559 | 86 |
| 103.693891693356 | 90 |
| 104.256287530344 | 82 |
| 98.7757175101084 | 98 |
| 121.23770971524 | 93 |
| 105.735133563954 | 92 |
| 100.748279203616 | 90 |
| 110.629889199681 | 82 |
| 110.223981903305 | 93 |
| 105.96198130735 | 99 |
| 115.030734260189 | 95 |
| 101.086215659758 | 91 |
| 101.787879860701 | 96 |
| 101.730882336388 | 94 |
| 123.371033899913 | 94 |
| 119.477483980576 | 97 |
| 130.921019747508 | 99 |
| 113.218318447848 | 100 |
| 111.989096133415 | 96 |
| 104.220426247265 | 82 |
| 136.600385759183 | 100 |
| 115.63259192335 | 100 |
| 99.2989105951894 | 94 |
| 128.512561044642 | 98 |
| 119.189861983478 | 90 |
| 104.503778545185 | 100 |
| 111.161916750147 | 89 |
| 111.678041376189 | 100 |
| 102.944014966413 | 100 |
| 113.60154603605 | 93 |
| 130.896645808593 | 89 |
| 105.144237277432 | 93 |
| 101.003509223556 | 89 |
| 105.258632790116 | 93 |
| 110.927465740186 | 86 |
| 107.017341829296 | 98 |
| 106.797108657441 | 87 |
| 123.988458240455 | 95 |
| 92.5049510855054 | 80 |
| 81.5755243938151 | 85 |
| 98.4638266627752 | 98 |
| 122.327340496225 | 96 |
| 113.240809308239 | 95 |
| 103.975328505496 | 91 |
| 108.737274798324 | 98 |
| 111.070052780136 | 91 |
| 115.264913774606 | 86 |
| 128.213705014387 | 94 |
| 125.304185665076 | 89 |
| 115.336475056355 | 94 |
| 108.423283186709 | 87 |
| 114.858758353622 | 89 |
| 91.2345796543253 | 85 |
| 122.79439887775 | 98 |
| 128.517558625565 | 100 |
| 101.410740973244 | 94 |
| 120.677027723483 | 99 |
| 112.250659248504 | 94 |
| 119.301415641755 | 99 |
| 120.66832842075 | 90 |
| 112.047362743012 | 91 |
| 91.2616607851757 | 95 |
| 114.538322381725 | 99 |
| 103.196083921825 | 91 |
| 104.276625154688 | 94 |
| 107.432860115969 | 91 |
| 90.5425147738757 | 79 |
| 102.392714455402 | 89 |
| 87.9759529085389 | 80 |
| 119.74067310035 | 90 |
| 101.694088344522 | 81 |
| 100.242022047091 | 84 |
| 104.642190633935 | 97 |
| 105.642450007279 | 93 |
| 110.888533637181 | 95 |
| 103.358043599092 | 83 |
| 118.444895765908 | 95 |
| 115.723757335303 | 97 |
| 111.861272239388 | 97 |
| 105.930700426544 | 98 |
| 117.104956133782 | 99 |
| 117.624942651159 | 97 |
| 115.076106904279 | 96 |
| 98.3280718862294 | 92 |
| 99.5576922636251 | 80 |
| 101.875101572353 | 86 |
| 78.4726888605047 | 87 |
| 78.7023337596165 | 70 |
| 84.6579337470285 | 86 |
| 104.631055575062 | 80 |
| 99.6319263223032 | 88 |
| 98.1228252288676 | 81 |
| 107.306421045227 | 86 |
| 95.8911448652984 | 88 |
| 100.322692422935 | 79 |
| 109.717417691176 | 83 |
| 66.1589250168515 | 84 |
| 117.915577341331 | 97 |
| 122.596894999735 | 98 |
| 106.213562141961 | 98 |
| 115.41575114661 | 97 |
| 102.985529490566 | 86 |
| 94.6482907704586 | 90 |
| 110.623944880135 | 84 |
| 65.4869387684025 | 81 |
| 100.460655321276 | 89 |
| 118.542875330182 | 94 |
| 107.287111247025 | 74 |
| 101.219410510055 | 86 |
| 122.744955005995 | 99 |
| 107.201613943942 | 89 |
| 108.272154314486 | 96 |
| 106.322867027107 | 91 |
| 88.6220064321972 | 81 |
| 106.828472607105 | 95 |
| 103.403768080508 | 89 |
| 88.7750161763172 | 95 |
| 112.230021718143 | 92 |
| 115.338274179049 | 89 |
| 99.7220129868355 | 90 |
| 106.55171753464 | 90 |
| 110.698067604079 | 98 |
| 96.8964295537039 | 82 |
| 98.7365459813885 | 98 |
| 84.1269631181774 | 73 |
| 82.6330512681569 | 77 |
| 93.1544918440377 | 90 |
| 106.588097855664 | 99 |
| 107.67822463228 | 96 |
| 123.6219039294 | 91 |
| 91.6465099482067 | 76 |
| 77.9731038528414 | 83 |
| 78.1241522012636 | 84 |
| 85.9898512280064 | 81 |
| 102.213361411511 | 82 |
| 99.1826529787669 | 90 |
| 101.109181191875 | 97 |
| 105.531842577652 | 91 |
| 98.2245240128889 | 85 |
| 98.8481767427242 | 89 |
| 113.548807522429 | 94 |
| 125.525344344659 | 98 |
| 123.422154280907 | 89 |
| 132.318974513403 | 99 |
| 136.317323863486 | 100 |
| 116.10064689571 | 100 |
| 121.647911068655 | 97 |
| 101.99711328021 | 98 |
| 127.349345919602 | 94 |
| 85.5409179720124 | 79 |
| 75.6901898644014 | 62 |
| 68.2364813683 | 87 |
| 93.6302973905089 | 88 |
| 87.6303941472663 | 68 |
| 107.020556395111 | 93 |
| 97.1750877339276 | 92 |
| 99.5049516149588 | 85 |
| 96.5018485144715 | 94 |
| 73.1518181391437 | 87 |
| 118.371301866559 | 96 |
| 69.0687819991039 | 88 |
| 102.135646192949 | 91 |
| 102.342187361697 | 94 |
| 109.82968424674 | 91 |
| 72.7665085929981 | 79 |
| 119.632549495253 | 98 |
| 115.919948805986 | 97 |
| 99.6714458229296 | 94 |
| 122.622833562232 | 98 |
| 111.604758693015 | 88 |
| 99.6267070714987 | 98 |
| 119.830727988879 | 95 |
| 103.255627152068 | 91 |
| 116.359357871845 | 89 |
| 115.630833677149 | 93 |
| 99.9777955793462 | 94 |
| 104.927597861586 | 93 |
| 101.525736168382 | 98 |
| 107.598142716388 | 91 |
| 103.15961514262 | 85 |
| 116.574367188118 | 97 |
| 115.474896894084 | 88 |
| 109.613739709791 | 87 |
| 83.7455278258695 | 83 |
| 102.615038124311 | 97 |
| 107.645292970261 | 97 |
| 109.911973963084 | 94 |
| 86.4352402930326 | 79 |
| 87.7935839377733 | 87 |
| 110.40485499342 | 97 |
| 126.215166148798 | 96 |
| 109.128501064128 | 98 |
| 106.679956378377 | 90 |
| 100.614081444177 | 86 |
| 131.865005086384 | 98 |
| 116.528318489517 | 98 |
| 114.78215109641 | 96 |
| 109.659257596118 | 85 |
| 119.286233341693 | 100 |
| 134.986667020417 | 100 |
| 118.698873109034 | 97 |
| 117.255162915225 | 98 |
| 143.057716241763 | 99 |
| 73.4331514890602 | 84 |
| 112.6455948348 | 93 |
| 113.97935082191 | 97 |
| 94.7733718406886 | 94 |
| 119.677570719435 | 89 |
| 120.215271569289 | 100 |
| 106.384042532117 | 90 |
| 102.21310918264 | 95 |
| 80.5253410479202 | 88 |
| 103.007542029834 | 90 |
| 108.83193675491 | 92 |
| 111.953762681048 | 96 |
| 106.245003480154 | 94 |
| 106.569843293717 | 90 |
| 79.6425023788503 | 83 |
| 118.247314919537 | 95 |
| 106.879503914693 | 97 |
| 100.095687009102 | 95 |
| 84.6862450670377 | 87 |
| 98.9517292909769 | 93 |
| 90.2996486314049 | 87 |
| 69.9878181617577 | 77 |
| 117.232650131432 | 91 |
| 114.42928318596 | 96 |
| 75.7218417745335 | 77 |
| 72.9596112898713 | 80 |
| 103.800308824042 | 87 |
| 111.451558475831 | 94 |
| 98.3876811581761 | 95 |
| 121.518080804149 | 100 |
| 126.49912566635 | 97 |
| 108.643762031906 | 96 |
| 119.882063580009 | 100 |
| 111.745668671117 | 91 |
| 119.847844756066 | 97 |
| 117.172637033878 | 98 |
| 104.258330459906 | 93 |
| 92.6300943047601 | 87 |
| 97.6422666454439 | 87 |
| 68.1332404709306 | 61 |
| 113.72678488261 | 84 |
| 103.062204256276 | 100 |
| 90.2940915161429 | 83 |
| 107.226692332521 | 95 |
| 116.95916392777 | 99 |
| 100.939461550787 | 87 |
| 94.5190122432415 | 84 |
| 114.458211349899 | 94 |
| 111.165704166623 | 97 |
| 96.7086733457343 | 85 |
| 93.1776162097122 | 93 |
| 90.7989201096951 | 82 |
| 101.551603514395 | 94 |
| 95.5236865126474 | 90 |
| 107.975397291145 | 89 |
| 103.897779759017 | 94 |
| 104.941462169693 | 100 |
| 108.266251578044 | 90 |
| 117.755876076672 | 99 |
| 134.086700638023 | 100 |
| 121.158244946473 | 96 |
| 129.909060698339 | 100 |
| 115.592206789427 | 97 |
| 78.6384566404423 | 80 |
| 77.78492079012 | 81 |
| 86.444897611365 | 81 |
| 116.816477117286 | 94 |
| 89.5089614423848 | 92 |
| 81.9547036030104 | 91 |
| 107.009848816906 | 98 |
| 116.830982818409 | 96 |
| 99.7883406039896 | 87 |
| 92.4283373631998 | 83 |
| 118.083139471419 | 86 |
| 115.168695180111 | 92 |
| 100.559567424417 | 84 |
| 119.249933061234 | 93 |
| 91.8741555631801 | 98 |
| 104.293286289201 | 100 |
| 75.8819904002848 | 87 |
| 115.932906343743 | 78 |
| 83.9136313086568 | 81 |
| 100.907363577407 | 100 |
| 94.6997886767844 | 89 |
| 71.2394379800864 | 91 |
| 111.471727218271 | 87 |
| 112.912367338371 | 96 |
| 69.5942295791922 | 69 |
| 78.2767782748847 | 87 |
| 114.220718380468 | 97 |
| 107.524962535616 | 89 |
| 100.228539722417 | 94 |
| 71.0033860195741 | 82 |
| 81.6332589975229 | 75 |
| 129.07883678859 | 99 |
| 137.587347903881 | 99 |
| 120.842625963957 | 100 |
| 115.12933437368 | 99 |
| 121.975726461928 | 98 |
| 114.922612578332 | 96 |
| 133.355196365136 | 95 |
| 122.259564999651 | 98 |
| 118.645396611648 | 91 |
| 110.025244460802 | 92 |
| 130.980653602581 | 99 |
| 109.801326816339 | 99 |
| 117.000935009567 | 97 |
| 107.539578579808 | 95 |
| 122.0708231926 | 88 |
| 137.538333406723 | 100 |
| 104.593803126747 | 91 |
| 96.685005617254 | 85 |
| 90.0950012209193 | 85 |
| 80.3272234083981 | 90 |
| 98.5879426048984 | 90 |
| 117.198414393507 | 92 |
| 78.9959284050736 | 71 |
| 100.519754016117 | 83 |
| 100.454452016964 | 65 |
| 123.306283041515 | 90 |
| 89.1015325149614 | 79 |
| 77.7725748992981 | 74 |
| 122.124536507261 | 90 |
| 74.1105619900658 | 69 |
| 114.383862454202 | 92 |
| 134.41510614781 | 98 |
| 118.236287346462 | 99 |
| 126.90924108809 | 88 |
| 128.931454257786 | 91 |
| 81.5272449943824 | 71 |
| 76.1455996736353 | 89 |
| 99.0346861029581 | 95 |
| 90.0156692584272 | 84 |
| 100.595094458925 | 87 |
| 90.222611728366 | 88 |
| 124.499512478784 | 91 |
| 100.715796222519 | 82 |
| 111.775679924821 | 88 |
| 78.5659148814483 | 71 |
| 116.883011218954 | 82 |
| 85.6057419814109 | 72 |
| 99.2733583479303 | 76 |
| 89.1944116991545 | 70 |
| 117.438634224068 | 88 |
| 91.526763861959 | 84 |
| 85.5049615711912 | 82 |
| 74.4669155047033 | 69 |
| 100.153338870806 | 87 |
| 123.129310337656 | 89 |
| 111.157303332567 | 85 |
| 98.8444936754152 | 68 |
| 79.7883925300491 | 83 |
| 75.0405638678866 | 67 |
| 141.913686122091 | 94 |
| 98.7167233603562 | 75 |
| 80.289496698935 | 66 |
| 68.5588505019666 | 79 |
| 121.308580956469 | 95 |
| 109.353705088308 | 90 |
| 106.872492836993 | 84 |
| 112.625568543463 | 86 |
| 89.3831133820457 | 71 |
| 95.9587298747053 | 67 |
| 95.1382895054181 | 87 |
| 123.056843203428 | 88 |
| 110.693049588215 | 94 |
| 135.746766382068 | 95 |
| 91.5489181346121 | 75 |
| 106.095533064038 | 83 |
| 122.008980552938 | 85 |
| 87.131606251436 | 85 |
| 103.199239526217 | 83 |
| 121.155471216206 | 85 |
| 80.8065754218721 | 71 |
| 122.9642482966 | 91 |
| 132.399671579284 | 90 |
| 100.102848129701 | 90 |
| 129.368947830879 | 87 |
| 109.899346921077 | 90 |
| 105.403597459178 | 75 |
| 103.883805692729 | 78 |
| 97.7999855701937 | 75 |
| 112.746184904024 | 88 |
| 116.524012443433 | 83 |
| 105.993212412229 | 81 |
| 137.214067921036 | 99 |
| 127.628094672755 | 100 |
| 127.690054125228 | 100 |
| 127.18910175661 | 99 |
| 118.323110371466 | 99 |
| 141.501807652174 | 100 |
| 132.608939318615 | 95 |
| 135.224298295447 | 96 |
| 136.180109372932 | 99 |
| 131.25026146461 | 99 |
| 140.664322848041 | 100 |
| 128.604123308992 | 99 |
| 135.969625338687 | 99 |
| 123.972287664976 | 98 |
| 132.100930463728 | 100 |
| 142.147763959363 | 99 |
| 108.438616420595 | 92 |
| 142.185466518408 | 100 |
| 126.461746670477 | 99 |
| 119.107151713772 | 95 |
| 129.1200955123 | 94 |
| 119.837138589795 | 83 |
| 93.1078020118951 | 73 |
| 128.65267640835 | 99 |
| 131.588026013409 | 88 |
| 111.322039024031 | 73 |
| 128.693945807014 | 92 |
| 130.21974391844 | 90 |
| 84.1901618592496 | 92 |
| 128.714628965026 | 92 |
| 128.629765343559 | 92 |
| 109.765583018075 | 85 |
| 117.078895654513 | 84 |
| 119.142278038891 | 95 |
| 136.724705346348 | 94 |
| 127.715375058607 | 92 |
| 92.0744971932794 | 59 |
| 74.7523923076411 | 76 |
| 98.3586031021556 | 75 |
| 97.6055480210823 | 90 |
| 90.3854990420064 | 92 |
| 93.5909392491411 | 80 |
| 93.7579733342667 | 83 |
| 107.552152360963 | 92 |
| 90.2236741093501 | 88 |
| 111.481227052025 | 87 |
| 104.281760747741 | 91 |
| 112.815853121555 | 90 |
| 90.2893086076198 | 92 |
| 97.7539163239255 | 87 |
| 104.332318108175 | 85 |
| 98.8437094221948 | 90 |
| 106.150210975119 | 98 |
| 105.309129963254 | 98 |
| 106.063791389383 | 90 |
| 88.8290288506962 | 79 |
| 99.3090294402489 | 78 |
| 89.5419349338835 | 79 |
| 94.2916958830629 | 85 |
| 101.839462584928 | 88 |
| 99.3283893042514 | 90 |
| 93.6638364156611 | 76 |
| 94.980451041485 | 92 |
| 110.334742443259 | 97 |
| 102.182129910959 | 96 |
| 94.3052219546278 | 81 |
| 100.370526547941 | 96 |
| 114.525323009534 | 94 |
| 105.463180441204 | 100 |
| 104.190036039769 | 95 |
| 105.558801429491 | 96 |
| 111.446521789725 | 93 |
| 101.689813283472 | 95 |
| 104.389311266082 | 81 |
| 95.4955596506345 | 88 |
| 105.629512256882 | 98 |
| 94.4690800420335 | 98 |
| 105.8718658954 | 95 |
| 110.347410637996 | 100 |
| 86.6324356192739 | 84 |
| 98.0508041050096 | 97 |
| 100.176306210823 | 94 |
| 97.4815452043895 | 82 |
| 100.725614129038 | 78 |
| 99.4492336436637 | 94 |
| 90.3877929003482 | 93 |
| 109.557170374292 | 83 |
| 94.6381030407145 | 99 |
| 122.563167600654 | 99 |
| 112.631475978638 | 99 |
| 124.07311434263 | 99 |
| 111.097088678463 | 91 |
| 83.5854518014757 | 71 |
| 107.3406510657 | 90 |
| 91.9569670283227 | 92 |
| 86.050625251062 | 92 |
| 105.174486407013 | 92 |
| 97.1885254069069 | 91 |
| 94.6695677721798 | 81 |
| 103.566720325257 | 91 |
| 106.518537891421 | 97 |
| 91.8079277172834 | 70 |
| 89.6227699224696 | 98 |
| 97.7956765486768 | 96 |
| 99.3883621708993 | 96 |
| 109.933613498932 | 97 |
| 96.9461617971839 | 87 |
| 100.739928769284 | 96 |
| 120.708804852499 | 100 |
| 107.805050901242 | 89 |
| 77.485466836594 | 75 |
| 93.349612818114 | 86 |
| 95.834225711468 | 96 |
| 111.53600832209 | 93 |
| 100.774178275396 | 93 |
| 94.6189282375541 | 86 |
| 105.29403006786 | 99 |
| 105.167109200414 | 88 |
| 93.95597573211 | 94 |
| 117.534423132526 | 100 |
| 98.6706714801949 | 98 |
| 103.959016302508 | 89 |
| 110.674878507117 | 92 |
| 102.296780950877 | 86 |
| 98.8434455471954 | 92 |
| 97.272618055875 | 94 |
| 106.24225246424 | 95 |
| 97.9755527865756 | 91 |
| 97.5125224170239 | 76 |
| 105.01310716885 | 89 |
| 100.104392579167 | 86 |
| 118.383007055312 | 87 |
| 115.232011325171 | 91 |
| 97.6567388762911 | 100 |
| 99.3563414518058 | 96 |
| 101.361389696678 | 86 |
| 89.9483759885163 | 98 |
| 92.0905385957349 | 94 |
| 104.165714822366 | 96 |
| 94.4298923631429 | 80 |
| 95.9632450464763 | 90 |
| 108.284561394082 | 91 |
| 83.3891220541322 | 67 |
| 71.0221369843262 | 85 |
| 119.730588724103 | 98 |
| 106.623519511194 | 89 |
| 104.100948037077 | 82 |
| 113.822802181015 | 92 |
| 98.4982099705326 | 96 |
| 114.960255963094 | 99 |
| 125.117092914081 | 98 |
| 101.295989888951 | 97 |
| 128.713488490562 | 97 |
| 116.198192726128 | 99 |
| 109.103515171637 | 100 |
| 87.353801420375 | 73 |
| 103.365932798697 | 90 |
| 96.0492160946444 | 89 |
| 104.897913612902 | 93 |
| 103.353809212862 | 86 |
| 93.5092192458467 | 93 |
| 133.91353744505 | 98 |
| 115.087276101221 | 94 |
| 62.9229853962285 | 72 |
| 96.7705920973848 | 89 |
| 79.8994881027207 | 78 |
| 106.895825783909 | 95 |
| 102.717723155712 | 84 |
| 102.407923983429 | 94 |
| 103.282450641202 | 83 |
| 116.933325525145 | 88 |
| 95.3457695993904 | 83 |
| 88.737534720885 | 81 |
| 121.013597051967 | 95 |
| 96.091968298208 | 89 |
| 113.766611429519 | 98 |
| 94.5458876405662 | 84 |
| 99.3995620894485 | 86 |
| 106.427148722446 | 99 |
| 104.440787459687 | 88 |
| 94.7603909775635 | 85 |
| 95.8579321856422 | 78 |
| 112.818189009486 | 95 |
| 105.93860876111 | 96 |
| 123.602593986153 | 96 |
| 103.985824402366 | 94 |
| 102.107124629932 | 100 |
| 100.112922430207 | 97 |
| 107.440431524087 | 94 |
| 116.788761907516 | 97 |
| 111.37655440522 | 84 |
| 107.843345213917 | 100 |
| 100.764633662822 | 87 |
| 120.23773949944 | 93 |
| 103.339820120491 | 88 |
| 108.679951534165 | 93 |
| 117.491586652064 | 92 |
| 115.620309138924 | 88 |
| 121.275387986548 | 93 |
| 115.973624750937 | 95 |
| 123.375557515407 | 94 |
| 112.252833006847 | 90 |
| 113.831525673096 | 89 |
| 98.8147785549867 | 83 |
| 109.352608470512 | 92 |
| 114.870475138881 | 97 |
| 111.13888552818 | 88 |
| 128.879609078194 | 97 |
| 124.48145663755 | 100 |
| 99.0517356107969 | 63 |
| 118.854130128902 | 89 |
| 116.335006970459 | 90 |
| 114.351366588136 | 83 |
| 84.8491464799034 | 84 |
| 113.964679124392 | 86 |
| 109.874707515302 | 88 |
| 98.3530024605998 | 81 |
| 115.214351577199 | 92 |
| 103.929171472808 | 91 |
| 113.199556028475 | 87 |
| 106.738626646937 | 86 |
| 113.599772170299 | 90 |
| 97.2596571779863 | 74 |
| 120.333051728269 | 90 |
| 113.477265384516 | 91 |
| 114.684887128823 | 93 |
| 101.236411676243 | 85 |
| 112.541877739715 | 91 |
| 126.652051780063 | 98 |
| 125.334451203875 | 97 |
| 126.560987789194 | 94 |
| 102.168290964771 | 89 |
| 120.187858770976 | 97 |
| 106.913619350023 | 87 |
| 120.751213718855 | 95 |
| 108.999095985495 | 79 |
| 110.360655793982 | 87 |
| 112.371890191059 | 89 |
| 117.54094308228 | 98 |
| 124.511566911719 | 97 |
| 117.990581905054 | 93 |
| 113.576318800005 | 89 |
| 102.69348002004 | 88 |
| 116.11285652658 | 95 |
| 114.540269039284 | 91 |
| 128.804159798082 | 96 |
| 103.003416896536 | 80 |
| 104.793682630997 | 86 |
| 115.276022395589 | 95 |
| 106.902276821467 | 94 |
| 119.548891624959 | 94 |
| 123.109391498138 | 97 |
| 118.547068474598 | 90 |
| 104.50777696185 | 94 |
| 116.011413539402 | 100 |
| 108.729405323669 | 95 |
| 134.631375740083 | 99 |
| 120.577438837273 | 95 |
| 125.148407668591 | 98 |
| 111.912606954439 | 99 |
| 123.028869195149 | 97 |
| 128.765689228081 | 98 |
| 120.692146875605 | 98 |
| 122.11597719302 | 100 |
| 114.398575902419 | 97 |
| 91.3646998631777 | 85 |
| 108.403486606135 | 90 |
| 94.5090370891863 | 82 |
| 97.8522825588979 | 82 |
| 86.7212767903277 | 82 |
| 102.080281788785 | 85 |
| 124.978631542105 | 92 |
| 114.042184081667 | 93 |
| 107.764187691688 | 83 |
| 82.6059426879662 | 64 |
| 119.529538583117 | 89 |
| 108.594342617023 | 81 |
| 87.7983477303504 | 82 |
| 122.046519742624 | 99 |
| 85.3533986396405 | 74 |
| 114.353651501268 | 94 |
| 106.471478493831 | 80 |
| 135.875850346037 | 99 |
| 128.121936011326 | 100 |
| 114.312161100301 | 98 |
| 128.699227121195 | 99 |
| 121.684262560199 | 99 |
| 121.096731283202 | 100 |
| 108.531328004154 | 99 |
| 103.121522097183 | 82 |
| 104.284478113032 | 75 |
| 111.678206770393 | 95 |
| 98.1444473691822 | 91 |
| 102.714105545638 | 72 |
| 109.050514797486 | 91 |
| 110.49297177951 | 78 |
| 111.423356261953 | 91 |
| 96.5108534782337 | 87 |
| 130.059861201327 | 95 |
| 131.347360729547 | 93 |
| 120.913133278647 | 93 |
| 134.132040669051 | 93 |
| 160.151633811958 | 100 |
| 128.10529514723 | 89 |
| 131.705507389101 | 91 |
| 106.318363857453 | 79 |
| 118.852380014399 | 83 |
| 99.5405410919003 | 74 |
| 95.6089615119494 | 83 |
| 118.981184893192 | 87 |
| 132.434486357403 | 94 |
| 79.4963132673669 | 85 |
| 97.5014275382572 | 76 |
| 107.196810582416 | 86 |
| 100.064050886064 | 78 |
| 117.597863774707 | 75 |
| 130.999313989364 | 82 |
| 110.388581013028 | 88 |
| 125.472352816159 | 85 |
| 117.5564438956 | 91 |
| 105.191703319872 | 83 |
| 120.314857767948 | 90 |
| 121.914288079221 | 88 |
| 121.525001550377 | 94 |
| 115.916587228378 | 87 |
| 113.405929661729 | 85 |
| 96.8023331455455 | 78 |
| 150.980483770027 | 98 |
| 139.514574984183 | 96 |
| 87.9574508535515 | 76 |
| 128.981137299753 | 90 |
| 142.551984884822 | 94 |
| 136.348749374145 | 96 |
| 112.035688930588 | 94 |
| 98.3213948886915 | 88 |
| 137.697572928451 | 91 |
| 89.191807050642 | 79 |
| 87.5423930946939 | 91 |
| 90.9054478642504 | 78 |
| 126.446137916284 | 98 |
| 126.197578039518 | 97 |
| 134.211299108959 | 94 |
| 132.40171654415 | 88 |
| 100.762957783746 | 88 |
| 106.175710759644 | 85 |
| 135.533772049745 | 96 |
| 106.713819319847 | 79 |
| 103.969554617769 | 81 |
| 126.674031227265 | 85 |
| 114.010270458523 | 90 |
| 136.607667626815 | 95 |
| 138.645359535214 | 97 |
| 150.160134390825 | 99 |
| 138.592361153731 | 99 |
| 151.138058231997 | 94 |
| 141.213087395141 | 98 |
| 127.013717410614 | 93 |
| 151.660484593716 | 98 |
| 114.000150036765 | 89 |
| 130.280515197016 | 93 |
| 139.467436258953 | 98 |
| 121.341053827402 | 90 |
| 107.147007840942 | 80 |
| 135.260692838259 | 88 |
| 121.297360045009 | 87 |
| 115.451034022753 | 85 |
| 120.007151735256 | 96 |
| 88.6866108628532 | 67 |
| 132.603189565569 | 83 |
| 121.042320260083 | 86 |
| 111.014620020897 | 81 |
| 124.060517130413 | 95 |
| 148.769738292506 | 98 |
| 135.094439558135 | 93 |
| 121.821513920753 | 89 |
| 140.272832609907 | 99 |
| 129.48144269817 | 90 |
| 121.399188536001 | 78 |
| 101.860160511071 | 82 |
| 115.221821753574 | 87 |
| 118.416458435123 | 85 |
| 82.7928068584429 | 78 |
| 129.265933314997 | 92 |
| 90.4510824966794 | 83 |
| 96.9318474518073 | 78 |
| 100.105439072584 | 83 |
| 117.3395449423 | 79 |
| 147.236633033357 | 98 |
| 143.395452565196 | 100 |
| 144.651169083335 | 100 |
| 148.442119211064 | 100 |
| 139.781070810273 | 100 |
| 149.124054307238 | 100 |
| 144.532118032349 | 100 |
| 143.745047385865 | 100 |
| 141.65953029113 | 100 |
| 136.887795643313 | 100 |
| 125.372509661797 | 95 |
| 146.207750692288 | 100 |
| 148.383744002592 | 100 |
| 146.281002889293 | 100 |
| 121.006533486003 | 100 |
| 147.244372995002 | 100 |
| 140.377704138842 | 99 |
| 139.059485103401 | 88 |
| 140.596913538546 | 100 |
| 149.864462500664 | 99 |
| 142.232120591984 | 99 |
| 141.127842056851 | 100 |
| 137.233076633687 | 100 |
| 93.9406693868925 | 75 |
| 97.8935849277624 | 90 |
| 106.725771188756 | 78 |
| 112.115659870526 | 100 |
| 92.9978347323961 | 76 |
| 125.090434843199 | 96 |
| 120.423457680754 | 93 |
| 104.521383487701 | 83 |
| 135.550540794337 | 96 |
| 97.6262725552765 | 79 |
| 94.3523660558434 | 95 |
| 85.1956947942546 | 81 |
| 86.7698117802105 | 82 |
| 133.504153407942 | 99 |
| 143.079227641174 | 100 |
| 129.735171236162 | 99 |
| 131.768010376054 | 95 |
| 134.174775595558 | 100 |
| 114.944958355786 | 100 |
| 139.367163961332 | 100 |
| 138.110220853207 | 99 |
| 121.498646736304 | 100 |
| 114.459016464511 | 89 |
| 99.8168575382323 | 85 |
| 141.98998084076 | 100 |
| 121.307644932485 | 94 |
| 144.609635538512 | 100 |
| 97.2296075867006 | 87 |
| 76.0119784608054 | 70 |
| 122.169465333875 | 100 |
| 106.935208025389 | 85 |
| 113.943326095743 | 89 |
| 88.7421209556438 | 70 |
| 85.9676817506958 | 66 |
| 97.2095016286197 | 89 |
| 106.038720611349 | 81 |
| 75.8356775730647 | 91 |
| 124.239148405208 | 91 |
| 96.48450083192 | 89 |
| 111.244393354344 | 88 |
| 78.4575699628546 | 76 |
| 95.8042474791892 | 93 |
| 90.5180732194193 | 91 |
| 104.393486354096 | 92 |
| 83.955316298504 | 73 |
| 120.557711064922 | 90 |
| 86.3005072720231 | 87 |
| 122.282787947148 | 94 |
| 102.202960929935 | 79 |
| 91.8876469741759 | 85 |
| 98.4303086128771 | 90 |
| 93.1317235124835 | 88 |
| 96.9695273637244 | 92 |
| 106.331554775592 | 95 |
| 92.1142855213824 | 79 |
| 105.313807211689 | 79 |
| 106.636144655219 | 91 |
| 87.0530846363772 | 82 |
| 102.201046844325 | 78 |
| 98.0612394568333 | 77 |
| 101.553308010596 | 97 |
| 121.039042297481 | 100 |
| 122.865623765489 | 96 |
| 111.732682359156 | 100 |
| 86.8551094984867 | 82 |
| 106.330190979282 | 91 |
| 112.721694109249 | 92 |
| 105.423030197664 | 74 |
| 125.549969772343 | 95 |
| 95.5833227342283 | 91 |
| 86.7454703400511 | 76 |
| 85.3582594962368 | 69 |
| 102.842223491018 | 85 |
| 86.3098362813499 | 80 |
| 80.1344313334054 | 76 |
| 90.8611063356137 | 73 |
| 126.969903865411 | 100 |
| 118.095017217621 | 82 |
| 145.890143560788 | 100 |
| 104.783112570311 | 98 |
| 119.314380427306 | 100 |
| 118.40179733962 | 100 |
| 111.230095639096 | 99 |
| 84.2414602834166 | 88 |
| 70.4971830467848 | 89 |
| 103.242674064975 | 87 |
| 89.7151760410832 | 84 |
| 95.3759341926895 | 83 |
| 80.094524653642 | 68 |
| 101.156242475219 | 89 |
| 87.6514718955981 | 66 |
| 73.8507087697581 | 78 |
| 107.295622020915 | 85 |
| 105.761515895984 | 81 |
| 106.114945558487 | 79 |
| 132.58476743297 | 100 |
| 103.068605404568 | 90 |
| 111.942297581491 | 98 |
| 102.846702271278 | 92 |
| 85.2226671893565 | 76 |
| 99.8881188404562 | 93 |
| 100.278985577524 | 93 |
| 95.985350412996 | 83 |
| 100.021723380585 | 88 |
| 92.6421928212819 | 95 |
| 81.633680903424 | 83 |
| 107.119231994202 | 90 |
| 125.676303236113 | 98 |
| 91.7552941675158 | 88 |
| 83.4033775548171 | 76 |
| 94.8489203627788 | 90 |
| 115.555263408841 | 92 |
| 96.0035758081547 | 80 |
| 73.5348849210764 | 79 |
| 92.9018220791721 | 77 |
| 71.8272267382895 | 85 |
| 89.0460769706255 | 93 |
| 102.412945269702 | 93 |
| 71.2896636523528 | 69 |
| 94.276325019358 | 90 |
| 105.372455277981 | 94 |
| 123.743132582124 | 89 |
| 107.786699714404 | 97 |
| 93.5916556022415 | 93 |
| 101.882658894141 | 85 |
| 82.4199195669519 | 74 |
| 111.762065911004 | 97 |
| 120.601556893844 | 91 |
| 101.268921377934 | 86 |
| 92.2334027535502 | 70 |
| 107.227888334315 | 81 |
| 98.0995167484739 | 88 |
| 124.387475792834 | 91 |
| 126.616080456867 | 89 |
| 90.0432247970836 | 79 |
| 97.158698755656 | 84 |
| 117.895873431553 | 97 |
| 132.948656407215 | 97 |
| 127.6232539468 | 100 |
| 130.427737731365 | 100 |
| 108.787149860956 | 100 |
| 110.247261615556 | 88 |
| 91.9659569533967 | 78 |
| 87.3471546875797 | 68 |
| 106.90757627981 | 90 |
| 121.776784253166 | 93 |
| 88.8411336201009 | 77 |
| 75.4475231819352 | 62 |
| 134.748917432142 | 99 |
| 140.155616904487 | 94 |
| 100.920793794439 | 80 |
| 104.893604042062 | 92 |
| 117.992625484279 | 95 |
| 97.0023519873626 | 95 |
| 95.5545064148158 | 85 |
| 107.469086639834 | 90 |
| 91.5774519399785 | 83 |
| 114.157102100847 | 91 |
| 97.1137703007203 | 90 |
| 107.815541477945 | 84 |
| 113.787561681188 | 93 |
| 108.52652491945 | 86 |
| 75.4244937631829 | 93 |
| 120.045235588326 | 92 |
| 106.065837062768 | 83 |
| 116.014396700837 | 88 |
| 101.639621234093 | 83 |
| 99.3920200140185 | 89 |
| 101.862105550561 | 88 |
| 135.539549384427 | 96 |
| 73.4427069486388 | 91 |
| 109.348419908734 | 97 |
| 81.2656557349111 | 80 |
| 73.3656399343537 | 88 |
| 103.803223815804 | 97 |
| 95.3139858091213 | 88 |
| 106.118253866865 | 88 |
| 85.8151770608629 | 81 |
| 113.26102121208 | 88 |
| 114.816408886197 | 96 |
| 124.186016761662 | 97 |
| 130.004379034591 | 100 |
| 121.891597173677 | 100 |
| 135.209454149874 | 100 |
| 126.338603802912 | 98 |
| 134.475773436465 | 100 |
| 116.863741278966 | 98 |
| 88.1943242321798 | 87 |
| 94.118779944986 | 92 |
| 101.727218898722 | 87 |
| 89.8167636945687 | 83 |
| 85.0945439999842 | 88 |
| 108.902700002544 | 91 |
| 122.959488075824 | 94 |
| 93.7845573044013 | 91 |
| 109.442241148873 | 89 |
| 114.139720704669 | 87 |
| 114.225353449543 | 87 |
| 77.6033543763267 | 88 |
| 115.785342991066 | 92 |
| 104.200832470009 | 85 |
| 118.609326132925 | 86 |
| 97.6755602608417 | 86 |
| 114.479868507597 | 87 |
| 107.00283675318 | 86 |
| 87.3976960151919 | 86 |
| 87.0302295362397 | 77 |
| 101.691905193146 | 89 |
| 106.327319672811 | 88 |
| 114.043519875115 | 94 |
| 98.4757423020869 | 85 |
| 112.106184654978 | 91 |
| 81.8543989004517 | 87 |
| 111.350433733196 | 92 |
| 113.308945965766 | 95 |
| 107.302647502187 | 89 |
| 98.5626780989093 | 82 |
| 102.039698375562 | 79 |
| 92.3225011757981 | 80 |
| 116.454110155889 | 89 |
| 99.871548367579 | 88 |
| 89.1661270311184 | 76 |
| 99.7505441199042 | 83 |
| 103.068842324702 | 93 |
| 105.391651341421 | 90 |
| 98.6971632696111 | 81 |
| 125.14182441657 | 88 |
| 113.935180456729 | 90 |
| 107.3166542237 | 94 |
| 87.6333293465749 | 74 |
| 74.1677758569598 | 77 |
| 97.7434211561142 | 80 |
| 103.408212168213 | 89 |
| 97.7799051429733 | 87 |
| 104.09775705343 | 92 |
| 84.9973209328985 | 76 |
| 96.9799700124136 | 92 |
| 122.877303106015 | 97 |
| 109.123140745443 | 96 |
| 121.539872508242 | 100 |
| 133.327106877837 | 100 |
| 128.663838096329 | 100 |
| 128.133333604105 | 99 |
| 131.036241760282 | 100 |
| 127.903286084884 | 98 |
| 126.026039736443 | 98 |
| 105.900224780802 | 95 |
| 107.914752234766 | 84 |
| 96.9082311642763 | 75 |
| 103.45634677982 | 91 |
| 111.501438060719 | 95 |
| 81.2369954321843 | 85 |
| 100.940460905508 | 95 |
| 106.068090709769 | 82 |
| 117.000189627391 | 90 |
| 90.6316657163086 | 85 |
| 94.0649515094978 | 90 |
| 98.699576062409 | 82 |
| 118.17577749092 | 85 |
| 109.388039322107 | 95 |
| 104.571916991207 | 85 |
| 107.803745483493 | 94 |
| 121.487641620826 | 92 |
| 107.137913066392 | 93 |
| 113.566842947977 | 99 |
| 115.189364985298 | 85 |
| 112.742503667121 | 91 |
| 103.382597181199 | 85 |
| 109.441756915445 | 88 |
| 113.331344680353 | 83 |
| 111.764679635205 | 90 |
| 116.474171298127 | 92 |
| 103.498905188579 | 83 |
| 124.848149399322 | 91 |
| 115.883748252381 | 97 |
| 90.4761317072279 | 90 |
| 104.026240520974 | 88 |
| 101.984768176316 | 93 |
| 107.757346767185 | 80 |
| 128.30568227268 | 97 |
| 99.5745435837515 | 94 |
| 113.117573504976 | 93 |
| 128.854083730955 | 92 |
| 112.976854995482 | 96 |
| 134.641431576026 | 100 |
| 127.329427448516 | 92 |
| 130.411537998059 | 96 |
| 114.269732662608 | 94 |
| 104.258015001864 | 93 |
| 124.942834089233 | 91 |
| 110.70286083382 | 95 |
| 132.72643569126 | 90 |
| 85.9726652845098 | 66 |
| 144.680332511018 | 95 |
| 106.315963236238 | 88 |
| 117.003385131676 | 89 |
| 126.798868477383 | 96 |
| 82.1430875261874 | 64 |
| 139.225682169062 | 91 |
| 144.281706022953 | 96 |
| 78.2173037087363 | 82 |
| 114.667026687451 | 92 |
| 146.248498028689 | 92 |
| 113.385971909301 | 91 |
| 112.005020952276 | 78 |
| 79.1909310501151 | 70 |
| 125.247257541695 | 90 |
| 123.480241418158 | 90 |
| 84.5728557304987 | 83 |
| 130.348996820833 | 90 |
| 121.696394550281 | 83 |
| 122.513043902449 | 89 |
| 120.238740301431 | 91 |
| 135.091907590357 | 92 |
| 131.913672233098 | 96 |
| 84.9523001725692 | 81 |
| 127.060428251677 | 87 |
| 118.48563323995 | 92 |
| 122.80242566699 | 84 |
| 141.496263677976 | 99 |
| 104.288107153771 | 79 |
| 90.4783994461863 | 88 |
| 96.5255088310722 | 78 |
| 125.459302341386 | 92 |
| 105.337918714142 | 79 |
| 85.5063961417819 | 72 |
| 98.5706590961334 | 88 |
| 106.507339955427 | 93 |
| 127.248132142656 | 93 |
| 124.650535395334 | 93 |
| 134.76108350007 | 97 |
| 82.3343378506382 | 80 |
| 129.098609253461 | 92 |
| 113.584658352648 | 91 |
| 138.688022174389 | 99 |
| 105.108797690234 | 73 |
| 120.204226342736 | 90 |
| 111.337920644475 | 80 |
| 115.161249929544 | 97 |
| 134.032690386491 | 89 |
| 117.784928586981 | 91 |
| 133.770211645429 | 94 |
| 132.512853525542 | 90 |
| 142.901436346335 | 94 |
| 121.248299023676 | 88 |
| 115.212736313762 | 88 |
| 108.51498104666 | 85 |
| 109.340534156223 | 82 |
| 122.373013503029 | 91 |
| 117.471177988858 | 84 |
| 128.519591084727 | 77 |
| 135.212627846198 | 95 |
| 115.644829666101 | 85 |
| 106.730281681091 | 94 |
| 123.100150425425 | 92 |
| 151.576475279126 | 97 |
| 144.496937683685 | 91 |
| 130.929158847399 | 91 |
| 87.6049036974865 | 78 |
| 116.139127369254 | 92 |
| 143.930336795892 | 99 |
| 130.004489086771 | 90 |
| 140.10701113024 | 92 |
| 116.06084026728 | 88 |
| 145.167787838311 | 100 |
| 146.29263378659 | 93 |
| 141.203672680387 | 100 |
| 143.13798427889 | 100 |
| 145.467511640261 | 100 |
| 134.908947297965 | 98 |
| 142.455654033963 | 100 |
| 145.743786246327 | 99 |
| 147.311955898648 | 100 |
| 88.1162551544809 | 76 |
| 146.989671141674 | 100 |
| 144.974593360393 | 96 |
| 144.564030412565 | 100 |
| 140.692116508446 | 89 |
| 111.08365263276 | 93 |
| 137.473339188295 | 93 |
| 112.592773368466 | 89 |
| 122.111395648828 | 91 |
| 134.697041453838 | 93 |
| 117.139883521462 | 84 |
| 143.804048964513 | 92 |
| 130.650112543404 | 91 |
| 114.366972085238 | 89 |
| 125.212251405172 | 89 |
| 75.8138531828682 | 79 |
| 82.7054637560459 | 65 |
| 115.372184412933 | 85 |
| 103.426749038304 | 81 |
| 127.912463675841 | 92 |
| 73.676840445279 | 81 |
| 76.6266634705945 | 76 |
| 112.468255421417 | 76 |
| 80.8462614442938 | 63 |
| 138.510042485228 | 99 |
| 128.214178724923 | 86 |
| 104.281386288291 | 87 |
| 137.182830526624 | 91 |
| 103.264417152816 | 84 |
| 104.318639651187 | 93 |
| 117.565739936585 | 88 |
| 131.912912072997 | 97 |
| 128.459381438203 | 87 |
| 139.113128853096 | 99 |
| 138.217098209965 | 99 |
| 120.09691767337 | 100 |
| 141.284422674367 | 99 |
| 148.222764392246 | 100 |
| 138.738944853549 | 100 |
| 133.059628566649 | 98 |
| 115.165430517598 | 97 |
| 134.131847590182 | 100 |
| 106.567203371586 | 80 |
| 115.007376122415 | 84 |
| 95.9943024676263 | 75 |
| 116.850647966598 | 86 |
| 151.514997852719 | 100 |
| 103.015924036717 | 88 |
| 73.1650597428896 | 68 |
| 89.5028786834191 | 96 |
| 84.1485437154986 | 88 |
| 105.910687438451 | 92 |
| 113.957923040075 | 96 |
| 114.904411428803 | 95 |
| 94.5685796744661 | 92 |
| 104.82055669852 | 96 |
| 110.404437205376 | 89 |
| 97.5207265418765 | 76 |
| 95.4863531308035 | 80 |
| 103.096169831556 | 81 |
| 104.932209124799 | 86 |
| 97.4159880647605 | 88 |
| 92.8736353728799 | 95 |
| 106.38623518905 | 80 |
| 95.2819666404406 | 96 |
| 97.8783483837909 | 82 |
| 110.645301379815 | 89 |
| 104.838606252115 | 93 |
| 97.8431030302534 | 94 |
| 98.7803194530911 | 90 |
| 102.38691715771 | 100 |
| 114.844352121104 | 97 |
| 96.2897959073087 | 88 |
| 116.502331561391 | 92 |
| 112.521826100452 | 82 |
| 103.988915644214 | 100 |
| 95.6696230927988 | 97 |
| 131.376904321476 | 91 |
| 118.993464519744 | 92 |
| 102.603834000174 | 91 |
| 117.647705688179 | 82 |
| 101.707492670459 | 84 |
| 117.311915565718 | 93 |
| 114.364604918445 | 97 |
| 94.2623138544295 | 82 |
| 96.5820560999158 | 90 |
| 95.2729016301136 | 78 |
| 114.199677481165 | 99 |
| 101.940937796354 | 91 |
| 101.608918542415 | 82 |
| 107.039482749679 | 95 |
| 111.561743897666 | 98 |
| 99.7940503997963 | 84 |
| 90.0856431175392 | 85 |
| 66.6027287273037 | 70 |
| 103.955011233294 | 78 |
| 75.2447366435837 | 94 |
| 90.8238783875295 | 83 |
| 116.23141243598 | 94 |
| 95.2121927345242 | 74 |
| 84.9290119023183 | 87 |
| 86.0794954161841 | 83 |
| 90.2269556677832 | 91 |
| 82.2062412312889 | 92 |
| 103.981125286743 | 93 |
| 104.327102494685 | 100 |
| 83.7638529487836 | 98 |
| 94.7794525094939 | 76 |
| 90.1928995475326 | 76 |
| 87.7454682506013 | 76 |
| 85.0192867319059 | 87 |
| 112.30963289795 | 96 |
| 114.448288925235 | 100 |
| 119.450103380497 | 92 |
| 124.628012052507 | 99 |
| 131.915771103152 | 96 |
| 116.359834077984 | 98 |
| 107.570110286537 | 98 |
| 123.206797907618 | 99 |
| 123.859874653848 | 99 |
| 104.855365692514 | 99 |
| 103.918571489391 | 95 |
| 104.250674430045 | 95 |
| 112.162764710241 | 96 |
| 105.942306638959 | 94 |
| 73.5901711689708 | 84 |
| 61.5819258490744 | 64 |
| 101.600752779928 | 88 |
| 100.714016805482 | 81 |
| 114.751252929952 | 96 |
| 85.7547094627367 | 90 |
| 118.005873048424 | 97 |
| 87.8456190612327 | 92 |
| 92.8532309512425 | 81 |
| 103.17138487084 | 78 |
| 104.625320447795 | 88 |
| 91.754876759577 | 86 |
| 129.174399807719 | 100 |
| 97.0121024066269 | 81 |
| 81.2336931133254 | 75 |
| 101.336873581478 | 100 |
| 82.2452286454548 | 92 |
| 81.6893711757762 | 83 |
| 94.7739021405279 | 84 |
| 83.5293204612238 | 72 |
| 93.9406846726307 | 86 |
| 99.0239507232649 | 94 |
| 91.5367693161615 | 71 |
| 96.8591408457133 | 86 |
| 110.808676049692 | 89 |
| 81.0553082386066 | 78 |
| 88.6748657465366 | 72 |
| 84.0193577353948 | 79 |
| 114.741836429391 | 100 |
| 85.3170194229017 | 93 |
| 95.7354085436462 | 97 |
| 96.1460631949752 | 89 |
| 101.711900502382 | 94 |
| 110.012697680159 | 94 |
| 105.754327824757 | 85 |
| 98.6140373742137 | 100 |
| 95.8115072811232 | 86 |
| 97.6986490424392 | 95 |
| 108.860384522474 | 87 |
| 113.780141539352 | 98 |
| 110.812228306532 | 91 |
| 100.334663071797 | 91 |
| 123.602223843532 | 96 |
| 106.108477060451 | 93 |
| 101.620561090197 | 88 |
| 110.433574776242 | 93 |
| 107.129333435585 | 75 |
| 98.8972548200622 | 93 |
| 101.267729912823 | 97 |
| 122.980595911054 | 100 |
| 108.984079629087 | 73 |
| 108.067283004653 | 94 |
| 98.1396817024191 | 81 |
| 86.3224965039156 | 70 |
| 95.1779319679133 | 90 |
| 102.430500098228 | 94 |
| 101.612141243716 | 88 |
| 110.453162183535 | 85 |
| 78.1770964021699 | 78 |
| 110.964647105516 | 91 |
| 115.341540874089 | 92 |
| 115.857157864842 | 85 |
| 113.845528724379 | 96 |
| 122.598987231328 | 96 |
| 117.631128381957 | 98 |
| 113.644264273264 | 98 |
| 118.909025092794 | 96 |
| 106.691393186194 | 97 |
| 102.96632381494 | 90 |
| 107.887121746847 | 89 |
| 115.213582157356 | 96 |
| 91.9118542234334 | 74 |
| 110.598153279269 | 87 |
| 107.275579617601 | 83 |
| 92.6879868622453 | 87 |
| 102.648654525145 | 87 |
| 93.8667854069179 | 84 |
| 109.733105465282 | 95 |
| 100.488098506778 | 100 |
| 116.372060158007 | 96 |
| 101.636742487684 | 82 |
| 105.531187020112 | 89 |
| 100.907647766008 | 85 |
| 109.243563015048 | 90 |
| 100.875615857664 | 85 |
| 109.484700671908 | 97 |
| 91.3747351708763 | 80 |
| 104.281699335364 | 83 |
| 120.010584121224 | 99 |
| 117.555213294014 | 96 |
| 102.014468229523 | 94 |
| 93.6544080584197 | 90 |
| 105.529462511986 | 88 |
| 99.4492200981993 | 88 |
| 105.058446299365 | 91 |
| 100.141105545816 | 90 |
| 99.0848304153183 | 90 |
| 112.49104169957 | 90 |
| 107.192076746935 | 95 |
| 110.044960515222 | 96 |
| 105.105711502401 | 87 |
| 117.012279650962 | 96 |
| 102.337405532984 | 92 |
| 98.0979095910935 | 84 |
| 119.043127323194 | 91 |
| 101.993603817856 | 78 |
| 117.808516727841 | 94 |
| 83.4496867504277 | 82 |
| 129.228211762331 | 93 |
| 99.1039398884968 | 88 |
| 107.194071782424 | 87 |
| 122.602475056463 | 100 |
| 129.470707880921 | 100 |
| 129.403210942995 | 100 |
| 124.389708324959 | 99 |
| 124.075812607477 | 100 |
| 106.531776029193 | 91 |
| 116.449029600412 | 92 |
| 82.5925469423731 | 82 |
| 117.316546974261 | 88 |
| 94.7655917539947 | 82 |
| 103.363238005783 | 88 |
| 116.273309707101 | 86 |
| 100.964976744712 | 95 |
| 71.535213492271 | 74 |
| 69.637072868406 | 73 |
| 112.996556315079 | 92 |
| 90.9928101442313 | 77 |
| 85.6163071629815 | 88 |
| 88.0795957065678 | 89 |
| 104.658457595953 | 90 |
| 94.7380610603998 | 87 |
| 94.4625579193123 | 84 |
| 83.3952146130263 | 98 |
| 118.221305323172 | 97 |
| 92.4389657925297 | 88 |
| 100.187129426456 | 79 |
| 113.390564892384 | 89 |
| 98.4880393463105 | 82 |
| 105.431289051361 | 90 |
| 100.748535671093 | 87 |
| 102.303366358929 | 82 |
| 91.2884955583068 | 89 |
| 86.5174265707088 | 81 |
| 86.9091728735641 | 81 |
| 97.3744341723071 | 81 |
| 91.9879937508616 | 82 |
| 117.479977065838 | 99 |
| 98.2932480852851 | 96 |
| 109.145674760024 | 85 |
| 89.847688275745 | 83 |
| 89.9788788554689 | 80 |
| 110.369072332538 | 91 |
| 82.909366702559 | 84 |
| 106.485456263034 | 93 |
| 129.395457648131 | 100 |
| 121.925572229526 | 100 |
| 129.914528014108 | 97 |
| 129.496978297885 | 100 |
| 118.420595072589 | 96 |
| 101.921181267558 | 81 |
| 97.0406821806611 | 92 |
| 117.501023939024 | 99 |
| 97.2796589471407 | 93 |
| 98.570373652865 | 86 |
| 107.097231951797 | 93 |
| 118.64006499606501 | 100 |
| 116.437143544699 | 98 |
| 109.017827184715 | 93 |
| 112.877816900128 | 98 |
| 112.713560534284 | 96 |
| 99.573885081933 | 95 |
| 109.144077226255 | 87 |
| 100.017694013558 | 97 |
| 116.569287490452 | 94 |
| 104.39825709538 | 86 |
| 116.130267933054 | 90 |
| 105.075548454865 | 92 |
| 115.082570557081 | 94 |
| 104.459317335319 | 84 |
| 89.3855490241071 | 91 |
| 79.0772607486446 | 74 |
| 99.322045134232 | 85 |
| 120.281214980762 | 95 |
| 73.6110804900304 | 99 |
| 101.661842267185 | 86 |
| 104.081731875722 | 87 |
| 111.177145102684 | 89 |
| 107.371580211409 | 83 |
| 77.5899019376042 | 93 |
| 101.480158114526 | 96 |
| 82.2139344150623 | 82 |
| 116.825237573008 | 100 |
| 127.683155385688 | 98 |
| 115.926407849639 | 99 |
| 111.308171905788 | 98 |
| 119.274906758752 | 98 |
| 100.096370187845 | 89 |
| 127.759790604731 | 100 |
| 118.507055826238 | 99 |
| 67.9159888057231 | 89 |
| 94.701596137342 | 90 |
| 97.2274966306086 | 81 |
| 91.7490887001694 | 89 |
| 98.1580966274648 | 87 |
| 105.450277203357 | 89 |
| 79.4224775310695 | 82 |
| 98.9038595571298 | 76 |
| 94.2424664958036 | 91 |
| 80.252838655469 | 79 |
| 103.660105423912 | 92 |
| 90.9276385289141 | 94 |
| 82.9181737781765 | 79 |
| 90.7797473570431 | 92 |
| 100.213946857452 | 83 |
| 100.68294896273 | 90 |
| 75.3873607651104 | 69 |
| 85.9344295779033 | 73 |
| 100.364483786903 | 91 |
| 104.818763676691 | 88 |
| 113.806056831516 | 100 |
| 116.110348386858 | 99 |
| 116.551017559163 | 95 |
| 123.625198267811 | 99 |
| 115.788147694165 | 90 |
| 78.0365649829445 | 74 |
| 112.184334533418 | 94 |
| 119.569414323796 | 99 |
| 105.827026620754 | 92 |
| 95.8928807269344 | 89 |
| 104.932284849159 | 87 |
| 110.298554684031 | 95 |
| 113.407186814507 | 97 |
| 98.7060675978977 | 75 |
| 92.3996365606631 | 74 |
| 103.485911526131 | 87 |
| 111.645762604551 | 89 |
| 108.700012560774 | 79 |
| 94.9386638758912 | 86 |
| 97.8400749126228 | 69 |
| 92.8488044001526 | 76 |
| 96.4174190125636 | 97 |
| 111.515398979292 | 97 |
| 114.98306979164 | 95 |
| 116.80712906647 | 93 |
| 104.896148600674 | 97 |
| 101.130911452468 | 99 |
| 111.503579257997 | 95 |
| 97.1837542482866 | 92 |
| 102.959079904211 | 97 |
| 102.3400163413 | 98 |
| 110.078687213953 | 99 |
| 108.02907051345 | 100 |
| 99.2489769211467 | 95 |
| 113.654040356114 | 94 |
| 99.3061085442985 | 93 |
| 131.025035568994 | 99 |
| 117.786836614501 | 97 |
| 103.592785627028 | 96 |
| 103.430658818031 | 94 |
| 94.14895080072 | 80 |
| 96.8958394414578 | 86 |
| 113.505616117876 | 90 |
| 103.305696619509 | 76 |
| 109.416661900599 | 85 |
| 107.842829666909 | 84 |
| 92.89346169493 | 83 |
| 109.521945665046 | 91 |
| 105.523542109593 | 86 |
| 92.3981697492332 | 84 |
| 95.7792618534778 | 89 |
| 101.022665729962 | 84 |
| 88.3504967193509 | 81 |
| 106.666630877772 | 97 |
| 112.683362204009 | 98 |
| 97.3336156720865 | 98 |
| 88.9905472825987 | 88 |
| 103.793114653687 | 96 |
| 107.899163052885 | 98 |
| 96.0792286884639 | 76 |
| 102.973148729838 | 94 |
| 107.695019126334 | 88 |
| 119.389695181641 | 93 |
| 105.62912146768 | 94 |
| 97.3871075693521 | 84 |
| 103.811665687258 | 96 |
| 105.046929945436 | 86 |
| 99.8612702755983 | 89 |
| 106.023864721172 | 87 |
| 92.2149009311292 | 87 |
| 104.021874210736 | 88 |
| 105.81194290303 | 88 |
| 96.2894809191515 | 97 |
| 106.240491742152 | 81 |
| 103.743599535701 | 76 |
| 109.690250978823 | 83 |
| 97.0285120975964 | 90 |
| 108.974508358349 | 98 |
| 94.6911222327641 | 75 |
| 99.2759641956405 | 63 |
| 105.343304284988 | 77 |
| 101.146160081579 | 72 |
| 99.8504465183227 | 72 |
| 118.048854373284 | 91 |
| 127.698837652597 | 93 |
| 106.762876641579 | 92 |
| 99.439651826471 | 96 |
| 91.9915749018448 | 86 |
| 94.7606477999812 | 80 |
| 111.172187124062 | 86 |
| 107.151913388462 | 90 |
| 107.076220707572 | 84 |
| 103.669616525962 | 84 |
| 100.544670126713 | 84 |
| 103.320535794294 | 81 |
| 115.559327756217 | 96 |
| 127.129683710253 | 96 |
| 136.958907842946 | 100 |
| 128.245469653038 | 100 |
| 99.235652747746 | 88 |
| 119.508986861814 | 96 |
| 121.288213563639 | 85 |
| 116.357955488143 | 82 |
| 82.6769326438654 | 82 |
| 78.377284502159 | 80 |
| 97.680115066891 | 71 |
| 106.62262739746 | 85 |
| 103.65940581866 | 82 |
| 112.609310997532 | 84 |
| 106.906532800933 | 84 |
| 121.591452398126 | 91 |
| 114.615564426267 | 89 |
| 122.557243407954 | 99 |
| 114.06874421141 | 81 |
| 101.326420396029 | 88 |
| 98.9706531249439 | 90 |
| 102.359170948625 | 93 |
| 101.794510216389 | 90 |
| 100.49012607383 | 77 |
| 100.375722405508 | 76 |
| 105.742550827981 | 96 |
| 110.654362482393 | 87 |
| 117.288599196221 | 97 |
| 98.8699466333286 | 83 |
| 110.235887169026 | 85 |
| 108.650935096851 | 90 |
| 101.182864254619 | 95 |
| 113.327936112315 | 94 |
| 88.8648658814298 | 88 |
| 118.83239242602 | 86 |
| 84.6298936416466 | 71 |
| 125.51638764155 | 100 |
| 103.05177388193 | 82 |
| 93.9256121688761 | 90 |
| 112.817382821122 | 88 |
| 108.14081108626 | 91 |
| 72.6620592147492 | 47 |
| 101.708321274863 | 84 |
| 111.442206169623 | 82 |
| 83.231398620162 | 68 |
| 123.662353419475 | 83 |
| 104.126646381265 | 83 |
| 93.1446541845818 | 85 |
| 107.169220084031 | 86 |
| 106.006415553406 | 92 |
| 130.013017224224 | 100 |
| 113.195389202182 | 86 |
| 118.57311266571 | 97 |
| 82.4834694085649 | 62 |
| 92.4488130722885 | 88 |
| 96.6819510760688 | 97 |
| 100.222937908395 | 91 |
| 108.937007290812 | 81 |
| 104.290043287099 | 85 |
| 94.6171569043072 | 85 |
| 93.4841531210897 | 78 |
| 98.743993608994 | 84 |
| 101.924773908569 | 100 |
| 96.336127667285 | 84 |
| 109.729541601308 | 94 |
| 111.675558585575 | 97 |
| 116.859885883292 | 92 |
| 111.681530367608 | 83 |
| 104.215688725186 | 100 |
| 70.537511041344 | 66 |
| 111.216382121374 | 94 |
| 96.2613254010086 | 87 |
| 104.3463653114 | 86 |
| 111.224584140031 | 89 |
| 101.170505694922 | 94 |
| 97.3446541562125 | 86 |
| 103.386155241947 | 89 |
| 95.5815157547911 | 87 |
| 86.1800551685365 | 95 |
| 94.1370049258663 | 84 |
| 91.5275985933483 | 100 |
| 94.5807314025195 | 91 |
| 97.4874605033575 | 69 |
| 98.9115989266519 | 89 |
| 104.160016701813 | 89 |
| 109.461754845279 | 100 |
| 102.219560544428 | 84 |
| 108.409232798543 | 90 |
| 93.9015116044809 | 75 |
| 103.017563304173 | 98 |
| 95.1647624326591 | 84 |
| 113.736335882138 | 89 |
| 92.6131257154141 | 75 |
| 128.2608678287 | 100 |
| 102.750665539948 | 81 |
| 107.439564312824 | 91 |
| 100.460317406201 | 91 |
| 103.212030306591 | 74 |
| 99.0557433894527 | 80 |
| 83.5157453182712 | 86 |
| 95.8870293842799 | 82 |
| 97.779556139665 | 87 |
| 86.6157082640085 | 92 |
| 98.6204976511164 | 90 |
| 83.0336441345849 | 69 |
| 106.631129518071 | 93 |
| 103.911659125137 | 90 |
| 91.3061189435009 | 72 |
| 117.60381139253 | 99 |
| 102.015651582353 | 87 |
| 96.8389909562089 | 79 |
| 95.3503107150199 | 91 |
| 100.189664072984 | 97 |
| 96.3159358994626 | 79 |
| 89.3966155120601 | 79 |
| 89.2440071364869 | 73 |
| 92.7777954619856 | 84 |
| 98.3614411321977 | 77 |
| 104.993625169824 | 87 |
| 122.744129589672 | 98 |
| 111.50287713418 | 100 |
| 90.798909364896 | 77 |
| 99.7191478379733 | 69 |
| 103.532662838206 | 87 |
| 103.545887008156 | 87 |
| 89.9139697864147 | 83 |
| 87.6973528721447 | 82 |
| 102.751459705834 | 85 |
| 113.164576930969 | 93 |
| 111.408722386341 | 92 |
| 111.272591503114 | 88 |
| 84.8441829288465 | 77 |
| 103.302713670307 | 88 |
| 98.6112673947303 | 97 |
| 108.263051318104 | 99 |
| 110.349733740352 | 90 |
| 105.137034047541 | 85 |
| 105.109796609756 | 95 |
| 108.98066178715 | 83 |
| 132.410876101572 | 96 |
| 74.9924895451964 | 70 |
| 121.352474600719 | 95 |
| 113.327810082655 | 81 |
| 131.15765375964 | 94 |
| 139.109267905972 | 92 |
| 97.1771470225985 | 75 |
| 134.609408421407 | 98 |
| 104.536742298856 | 88 |
| 104.791419934769 | 92 |
| 137.009825932143 | 94 |
| 111.933293702373 | 85 |
| 83.5073469105192 | 81 |
| 81.5006438423492 | 74 |
| 132.246554905235 | 83 |
| 98.8546980213288 | 90 |
| 118.710467567777 | 90 |
| 89.2857086106487 | 91 |
| 96.3955727935869 | 79 |
| 82.0330862969251 | 91 |
| 93.5603145233487 | 88 |
| 89.5582187906108 | 78 |
| 107.901350665798 | 85 |
| 90.7693804895037 | 87 |
| 89.365483318606 | 83 |
| 108.375052592192 | 81 |
| 88.8516327198065 | 77 |
| 86.5984661944102 | 81 |
| 97.5076262117273 | 75 |
| 137.954281816793 | 100 |
| 138.547584322782 | 98 |
| 130.852968451374 | 100 |
| 126.808132516472 | 100 |
| 123.062029029312 | 100 |
| 126.835995932284 | 100 |
| 93.0167305634281 | 84 |
| 119.277844587536 | 83 |
| 137.612349514986 | 93 |
| 144.781623054687 | 98 |
| 135.411867257964 | 87 |
| 84.4166204745519 | 68 |
| 98.5136843769435 | 82 |
| 109.722905414534 | 85 |
| 117.948664029543 | 91 |
| 132.06463821904 | 99 |
| 108.130771914139 | 91 |
| 78.264575337697 | 79 |
| 84.9127326492679 | 89 |
| 82.0912568370201 | 66 |
| 104.267496889908 | 82 |
| 108.762106810571 | 84 |
| 112.556168348469 | 90 |
| 108.584671642079 | 90 |
| 120.613253756963 | 91 |
| 67.3994186968335 | 66 |
| 111.95370021436 | 97 |
| 98.2434543932758 | 80 |
| 88.3343459762327 | 81 |
| 93.8142987156435 | 80 |
| 143.992912214414 | 94 |
| 117.679978205089 | 94 |
| 100.329654080325 | 89 |
| 103.721585999103 | 79 |
| 100.417750330128 | 82 |
| 116.58594726621 | 92 |
| 94.0949868274383 | 86 |
| 120.521940979875 | 91 |
| 114.486539838921 | 88 |
| 113.310373368721 | 97 |
| 80.0676400680217 | 81 |
| 120.534373860463 | 90 |
| 114.722227258067 | 82 |
| 115.219609744542 | 96 |
| 112.235675390025 | 86 |
| 143.341964752582 | 95 |
| 106.918563848203 | 75 |
| 84.3555053450891 | 81 |
| 85.762589744164 | 92 |
| 101.874699255792 | 76 |
| 116.00015426434 | 88 |
| 102.594652154949 | 86 |
| 83.4686017487572 | 77 |
| 83.0232471487952 | 79 |
| 121.745970162902 | 89 |
| 102.618324299019 | 80 |
| 100.249271603504 | 84 |
| 116.520131456631 | 83 |
| 70.2355345790932 | 71 |
| 125.30310385149 | 85 |
| 125.882649227585 | 97 |
| 88.4313571317564 | 83 |
| 124.037116944287 | 100 |
| 134.246622828795 | 100 |
| 124.174652276785 | 99 |
| 129.823777431414 | 99 |
| 127.183438101129 | 98 |
| 133.288409220367 | 100 |
| 131.363925586227 | 99 |
| 111.885445177682 | 82 |
| 127.613574025349 | 100 |
| 86.6061363649085 | 70 |
| 100.855873313091 | 85 |
| 134.455361571851 | 86 |
| 104.38777256397 | 90 |
| 126.629916056321 | 94 |
| 124.905841835352 | 90 |
| 88.1033169446922 | 83 |
| 113.757479316316 | 92 |
| 120.302400679891 | 86 |
| 78.9925955336891 | 86 |
| 114.95685393143 | 96 |
| 98.3578031693216 | 90 |
| 121.084793879182 | 86 |
| 140.680785993286 | 95 |
| 107.53539202984 | 95 |
| 117.762051527225 | 88 |
| 91.9035548851523 | 86 |
| 90.5521659524593 | 91 |
| 132.576039294108 | 96 |
| 124.391772599987 | 87 |
| 131.393227590621 | 91 |
| 129.226289527996 | 92 |
| 104.020254920408 | 82 |
| 93.882642436181 | 77 |
| 121.499044909288 | 90 |
| 128.940004234829 | 87 |
| 119.878528854037 | 84 |
| 130.144041683127 | 95 |
| 91.2068580871894 | 85 |
| 123.778545478641 | 89 |
| 126.673826283061 | 93 |
| 106.28087712913 | 87 |
| 144.918619806695 | 96 |
| 147.581348172804 | 100 |
| 146.838897037948 | 100 |
| 142.13003673966 | 100 |
| 130.72852574371 | 100 |
| 146.058425194922 | 100 |
| 114.6137059985 | 96 |
| 145.919814876966 | 100 |
| 128.435614254077 | 100 |
| 146.923313376146 | 99 |
| 146.984931964771 | 100 |
| 93.5653682533238 | 88 |
| 75.2101333140655 | 81 |
| 87.7179626317003 | 83 |
| 123.558675767476 | 93 |
| 116.085992678005 | 99 |
| 90.6447851772757 | 91 |
| 145.259223898915 | 93 |
| 108.547309787582 | 96 |
| 96.8950813524389 | 90 |
| 93.8843739941457 | 79 |
| 126.456820693711 | 95 |
| 109.79834514095 | 80 |
| 106.832710692898 | 93 |
| 87.7822344024639 | 89 |
| 115.156620743316 | 88 |
| 113.882827202489 | 92 |
| 137.434630632376 | 94 |
| 129.698319394811 | 89 |
| 116.28175213618 | 92 |
| 114.808048390734 | 78 |
| 129.778349758362 | 91 |
| 114.743928926417 | 94 |
| 125.962747502066 | 96 |
| 111.216034757463 | 87 |
| 133.612190520083 | 89 |
| 105.701055126475 | 84 |
| 131.868397053114 | 96 |
| 116.095063963431 | 95 |
| 119.348219147292 | 91 |
| 84.5094957837176 | 93 |
| 125.944273172479 | 94 |
| 92.9691061081266 | 87 |
| 126.002516095129 | 96 |
| 134.49618690164 | 94 |
| 121.153930660681 | 91 |
| 140.628389703914 | 94 |
| 128.089542051088 | 90 |
| 149.900273547412 | 98 |
| 90.1740948546796 | 88 |
| 89.1122306575963 | 79 |
| 82.5351044543224 | 82 |
| 102.71995198148 | 87 |
| 120.762967040612 | 85 |
| 137.648450289415 | 98 |
| 89.3634966259054 | 84 |
| 143.496117323088 | 95 |
| 144.049219462128 | 95 |
| 85.5183985292884 | 85 |
| 92.8918753534758 | 74 |
| 81.7796598297176 | 88 |
| 93.5118508256223 | 88 |
| 89.9774532662345 | 80 |
| 91.0588148340761 | 90 |
| 136.80519845827 | 93 |
| 149.325637625415 | 94 |
| 135.832468317494 | 96 |
| 134.829689537505 | 93 |
| 141.228585924065 | 99 |
| 147.382060625459 | 96 |
| 139.365727922199 | 92 |
| 131.063859256389 | 90 |
| 114.934858905292 | 95 |
| 144.510993636104 | 100 |
| 145.288450777723 | 100 |
| 106.336936979814 | 88 |
| 140.352125806366 | 100 |
| 145.397195550957 | 100 |
| 147.252479562479 | 100 |
| 143.85105094218 | 100 |
| 147.591669785044 | 100 |
| 137.798700013645 | 100 |
| 145.010363598664 | 100 |
| 148.781502984982 | 100 |
| 148.166956785371 | 100 |
| 147.114137758584 | 100 |
| 148.880533164432 | 100 |
| 135.547000825047 | 98 |
| 88.3308577669606 | 90 |
| 116.873094462005 | 95 |
| 138.897774241659 | 97 |
| 132.811667387367 | 93 |
| 127.455213615215 | 100 |
| 143.842690199974 | 100 |
| 136.59029921271 | 97 |
| 128.4743597466 | 92 |
| 115.258006642812 | 93 |
| 91.0170224959414 | 75 |
| 133.099001381812 | 91 |
| 130.182167643033 | 94 |
| 126.431080766356 | 89 |
| 115.807264034819 | 91 |
| 114.579101621768 | 84 |
| 96.1966544774677 | 76 |
| 136.560616695214 | 99 |
| 93.4828590683048 | 91 |
| 91.955487616573 | 86 |
| 108.558273903719 | 84 |
| 101.171998786184 | 86 |
| 75.8255021450542 | 73 |
| 72.2944671857977 | 87 |
| 102.533060494451 | 84 |
| 101.787184958459 | 85 |
| 110.876901842835 | 87 |
| 129.46746508943 | 90 |
| 94.8608596676191 | 89 |
| 92.414606065421 | 69 |
| 79.0699153784901 | 78 |
| 111.412732323954 | 86 |
| 83.4151717720122 | 92 |
| 79.4309545467762 | 63 |
| 89.4642707673454 | 88 |
| 78.4079367233743 | 85 |
| 93.0971495765768 | 87 |
| 74.7449056076285 | 85 |
| 98.9451933833756 | 87 |
| 81.6580215870738 | 80 |
| 100.412205071493 | 97 |
| 97.9241257350496 | 99 |
| 111.422956005391 | 100 |
| 117.631548619543 | 99 |
| 111.307079882351 | 96 |
| 129.125030927913 | 98 |
| 108.552031539519 | 93 |
| 124.030969139302 | 99 |
| 112.108956124463 | 99 |
| 110.473993597524 | 88 |
| 128.919248767473 | 100 |
| 125.780927266662 | 96 |
| 86.3972666995767 | 80 |
| 105.434022740246 | 95 |
| 92.4087422217674 | 80 |
| 82.8238510110699 | 85 |
| 74.0929712422262 | 78 |
| 82.0009898568392 | 84 |
| 87.2415598128892 | 87 |
| 94.6049219679604 | 75 |
| 87.538542222043 | 78 |
| 74.0448111866923 | 84 |
| 76.2067723726359 | 85 |
| 88.893538948647 | 87 |
| 85.9887845130521 | 84 |
| 85.3772192453007 | 79 |
| 102.322042480384 | 87 |
| 74.5164909055658 | 65 |
| 99.2655978673363 | 83 |
| 83.1943748445652 | 77 |
| 76.8044757241699 | 73 |
| 78.3525793692899 | 77 |
| 81.9346024852165 | 89 |
| 77.0743494880056 | 88 |
| 83.484768262248 | 89 |
| 82.0433269279658 | 82 |
| 75.2571561298146 | 84 |
| 72.1774532234328 | 63 |
| 88.0034239704911 | 85 |
| 75.0593644265106 | 91 |
| 120.266914569642 | 89 |
| 99.8769318004373 | 82 |
| 76.144554616417 | 79 |
| 114.398683068252 | 90 |
| 80.0929784427846 | 81 |
| 87.4282834088341 | 85 |
| 89.4286662029392 | 76 |
| 100.925318376274 | 81 |
| 85.6136797072182 | 85 |
| 79.5902385521973 | 76 |
| 94.7964162317349 | 86 |
| 76.8653116676639 | 81 |
| 84.2491731339981 | 83 |
| 78.800349190044 | 73 |
| 78.286352848445 | 85 |
| 106.347190604791 | 85 |
| 101.495459006065 | 89 |
| 84.7338740180315 | 78 |
| 84.2032990888009 | 61 |
| 83.2107713479901 | 76 |
| 76.5412661244147 | 76 |
| 76.7396436714829 | 93 |
| 93.1796815164145 | 90 |
| 128.911837211162 | 90 |
| 74.8458123324589 | 84 |
| 78.5038209889793 | 82 |
| 76.2614897637152 | 85 |
| 78.8740853395521 | 81 |
| 112.942014310609 | 90 |
| 113.327696326025 | 77 |
| 83.282482671852 | 84 |
| 76.8002023762981 | 74 |
| 86.7277083765639 | 91 |
| 107.164911918669 | 100 |
| 87.1642424270139 | 70 |
| 82.5880242460104 | 65 |
| 90.8869955518294 | 73 |
| 74.7490105822245 | 80 |
| 88.7724248284234 | 82 |
| 134.970839817741 | 99 |
| 90.6474812494875 | 80 |
| 76.5067663541573 | 73 |
| 91.089892838083 | 87 |
| 82.5522674784306 | 75 |
| 115.225109449283 | 93 |
| 93.3451846744468 | 92 |
| 88.8340309955292 | 79 |
| 79.1186977302311 | 70 |
| 94.34301786375 | 80 |
| 122.871050276234 | 100 |
| 101.440003234627 | 100 |
| 129.813565543568 | 98 |
| 137.06303926903 | 100 |
| 83.2326039657751 | 76 |
| 90.1806732944708 | 90 |
| 85.4431012206939 | 86 |
| 92.5958456285138 | 86 |
| 83.2094268881164 | 83 |
| 80.6893908353949 | 79 |
| 82.2912871732516 | 83 |
| 83.4934478056789 | 85 |
| 100.5669558798 | 72 |
| 78.3612592903397 | 83 |
| 96.6719898154183 | 91 |
| 101.636875775626 | 96 |
| 80.8199462549474 | 72 |
| 80.3440578722817 | 77 |
| 104.68245368034 | 75 |
| 100.785662565233 | 86 |
| 91.5303610290792 | 79 |
| 87.1206202620454 | 90 |
| 128.449666570582 | 100 |
| 78.3718018692376 | 84 |
| 108.781911968409 | 98 |
| 117.207508855907 | 93 |
| 77.7251689629603 | 75 |
| 96.0007783147201 | 91 |
| 105.00549635029 | 86 |
| 85.8250976463083 | 83 |
| 78.9805519093801 | 88 |
| 74.5892596831877 | 84 |
| 91.2495086942922 | 82 |
| 129.835966313203 | 89 |
| 93.6195311938478 | 79 |
| 117.130773353387 | 90 |
| 124.157685194246 | 96 |
| 94.9627087018828 | 91 |
| 105.51091243634 | 91 |
| 123.151789131139 | 93 |
| 112.611234243728 | 93 |
| 99.3536061101093 | 86 |
| 100.753090271988 | 93 |
| 117.106469668391 | 91 |
| 111.271884194574 | 90 |
| 88.8722116558599 | 85 |
| 141.127523116099 | 97 |
| 136.811499175184 | 99 |
| 92.592951046092 | 86 |
| 91.9698618816033 | 84 |
| 127.417245513544 | 89 |
| 95.5511466271787 | 88 |
| 108.175846245734 | 84 |
| 96.6678410311475 | 84 |
| 122.639156114609 | 90 |
| 73.8221908829112 | 64 |
| 78.1189854491992 | 64 |
| 86.167235576318 | 90 |
| 125.587270409223 | 85 |
| 123.053587609017 | 88 |
| 123.149296692312 | 88 |
| 85.5107033669939 | 83 |
| 80.8699976647037 | 81 |
| 143.881524696559 | 98 |
| 87.9497389472862 | 70 |
| 118.046016300275 | 97 |
| 122.803126992052 | 95 |
| 137.559796649334 | 100 |
| 129.653463332341 | 99 |
| 135.195898172741 | 100 |
| 137.146193583299 | 100 |
| 132.370455595504 | 100 |
| 129.15670173214 | 100 |
| 126.090792201703 | 99 |
| 134.229614962283 | 99 |
| 129.778597736269 | 91 |
| 92.0042178010636 | 85 |
| 115.690238020808 | 91 |
| 97.8360961682365 | 76 |
| 83.1965963677438 | 86 |
| 101.317872799584 | 90 |
| 125.713593608043 | 93 |
| 93.6712447399098 | 77 |
| 77.1091771583858 | 78 |
| 90.5817083627843 | 94 |
| 83.3043594870809 | 80 |
| 82.5984293430556 | 85 |
| 88.978063465045 | 90 |
| 89.1518656187225 | 88 |
| 90.4980144613678 | 83 |
| 85.455554256607 | 82 |
| 97.1699445688913 | 93 |
| 98.0723485687024 | 79 |
| 84.4099494152481 | 77 |
| 86.5526173588649 | 89 |
| 92.7655235256614 | 74 |
| 75.6175851035363 | 79 |
| 125.625478810052 | 94 |
| 83.890866181599 | 85 |
| 124.200736246548 | 99 |
| 116.723683470257 | 90 |
| 78.8708660256694 | 60 |
| 139.009032344205 | 98 |
| 76.9832462349147 | 89 |
| 92.5510743618818 | 86 |
| 125.888542640169 | 86 |
| 99.7157408056287 | 91 |
| 84.6630186245699 | 84 |
| 128.622405013178 | 94 |
| 111.251769973085 | 89 |
| 77.081239376793 | 86 |
| 95.0872168574135 | 88 |
| 90.6992440361417 | 92 |
| 85.6935341895961 | 76 |
| 101.262820819211 | 95 |
| 91.5104369153011 | 79 |
| 96.9061312115209 | 83 |
| 112.185704909529 | 88 |
| 94.5874001075441 | 84 |
| 118.492452387988 | 89 |
| 106.863988464204 | 83 |
| 101.416840113414 | 77 |
| 114.178030798297 | 84 |
| 97.7983032727346 | 82 |
| 82.2221802321621 | 82 |
| 121.54769288439 | 97 |
| 115.823221940855 | 97 |
| 141.506107461396 | 99 |
| 138.573138014392 | 94 |
| 133.161525986034 | 99 |
| 88.7724644352844 | 75 |
| 98.7266838183832 | 74 |
| 88.9048524162006 | 77 |
| 123.502437841844 | 100 |
| 97.795180773938 | 84 |
| 123.74395700063 | 96 |
| 115.266868778466 | 99 |
| 132.260287310821 | 100 |
| 141.727746563248 | 100 |
| 144.122490934607 | 100 |
| 131.461176789486 | 99 |
| 142.789104883 | 100 |
| 84.4616166788449 | 88 |
| 119.169122756984 | 97 |
| 94.004963291926 | 83 |
| 130.44241876504 | 79 |
| 99.491732482286 | 82 |
| 88.6766464842246 | 73 |
| 122.403682813565 | 95 |
| 133.090605360072 | 94 |
| 93.5614218029931 | 92 |
| 114.656710726118 | 91 |
| 117.592090044869 | 87 |
| 91.1904885758886 | 77 |
| 74.6965054494336 | 85 |
| 89.6944712986195 | 86 |
| 79.0793315557682 | 87 |
| 93.0406707073245 | 83 |
| 85.207462021842 | 84 |
| 83.3128155214848 | 82 |
| 119.460865873256 | 92 |
| 111.924551474825 | 87 |
| 71.6174715904932 | 78 |
| 88.6852190825625 | 70 |
| 75.9263908503558 | 77 |
| 88.5788033574374 | 81 |
| 116.631169015398 | 91 |
| 72.1739759298729 | 77 |
| 122.487643963173 | 94 |
| 132.581217311078 | 100 |
| 137.206775999684 | 99 |
| 127.616321564809 | 100 |
| 121.450995832733 | 100 |
| 137.821832552979 | 99 |
| 127.399334661797 | 99 |
| 108.539385751061 | 99 |
| 126.965525816581 | 100 |
| 99.5462114051506 | 87 |
| 80.5751592800248 | 88 |
| 78.5858349094791 | 75 |
| 89.6821027541527 | 87 |
| 89.9426212185 | 76 |
| 116.648552264179 | 84 |
| 124.659050006944 | 97 |
| 102.429641576203 | 89 |
| 122.967880084433 | 89 |
| 89.9737853937215 | 87 |
| 97.0615356379742 | 86 |
| 113.903347542852 | 87 |
| 69.5513759070754 | 84 |
| 101.058507899725 | 85 |
| 100.354298054112 | 84 |
| 122.789646141656 | 94 |
| 96.4763050830958 | 86 |
| 118.320026721742 | 90 |
| 107.908226950437 | 90 |
| 86.6439296954585 | 79 |
| 125.388887798033 | 87 |
| 108.972616187398 | 81 |
| 77.5403296773359 | 71 |
| 105.395672697035 | 89 |
| 72.2565671615549 | 83 |
| 109.201535583813 | 85 |
| 88.4347471825858 | 88 |
| 124.118233213457 | 93 |
| 116.849660820884 | 86 |
| 96.2603287180486 | 81 |
| 79.3482027006185 | 86 |
| 120.723928764393 | 96 |
| 107.254205191417 | 74 |
| 116.00437150279 | 89 |
| 93.220645270265 | 83 |
| 87.0437028133271 | 73 |
| 102.722470797755 | 85 |
| 81.8845670556386 | 82 |
| 86.400388178315 | 69 |
| 100.476247348356 | 82 |
| 110.240098925234 | 93 |
| 103.618042928934 | 85 |
| 98.3484069383332 | 90 |
| 78.1556084147333 | 84 |
| 111.172129119776 | 85 |
| 86.5779860359181 | 78 |
| 128.885843158826 | 98 |
| 120.686663820543 | 91 |
| 124.525627908395 | 97 |
| 117.588895420313 | 89 |
| 105.971038678322 | 82 |
| 81.4535241841875 | 69 |
| 113.624939937109 | 86 |
| 113.084030550808 | 91 |
| 87.5321395541766 | 63 |
| 102.749648616346 | 80 |
| 133.659979297787 | 100 |
| 142.403783765409 | 100 |
| 135.401687511405 | 99 |
| 133.909526245814 | 100 |
| 117.28652210054 | 85 |
| 91.0218440286311 | 85 |
| 105.319057215822 | 80 |
| 101.940887550506 | 80 |
| 116.549591257623 | 92 |
| 89.2849822518072 | 80 |
| 117.127550892792 | 93 |
| 122.236816428721 | 93 |
| 105.996413375781 | 74 |
| 103.080760765726 | 87 |
| 114.328089322051 | 86 |
| 130.386776365297 | 87 |
| 91.5367858488308 | 80 |
| 112.300517601433 | 82 |
| 113.746930802943 | 95 |
| 107.013775180058 | 81 |
| 124.440062040282 | 92 |
| 100.496431941146 | 80 |
| 124.333840160466 | 97 |
| 110.978350198536 | 86 |
| 78.9944559986533 | 75 |
| 87.7374571578848 | 85 |
| 135.811099461341 | 100 |
| 89.6380841763046 | 89 |
| 96.1234699211274 | 77 |
| 127.357488097183 | 95 |
| 78.4213331912343 | 81 |
| 77.5345500915731 | 75 |
| 117.446623197216 | 89 |
| 115.527415982742 | 76 |
| 127.69696255564 | 92 |
| 116.320100238134 | 92 |
| 105.449186570816 | 83 |
| 103.221031797445 | 87 |
| 97.0673900056652 | 83 |
| 114.382247099563 | 84 |
| 75.7292109453989 | 68 |
| 99.336589076682 | 78 |
| 120.288474753219 | 88 |
| 115.969702092877 | 89 |
| 129.077709405094 | 93 |
| 86.1712028328223 | 89 |
| 125.961406998364 | 96 |
| 108.834201201277 | 88 |
| 106.446700642277 | 86 |
| 101.015713278302 | 83 |
| 98.3639111052681 | 74 |
| 95.8517566437243 | 86 |
| 99.2495429193508 | 91 |
| 104.035268121839 | 68 |
| 122.396232024442 | 89 |
| 100.543036053778 | 87 |
| 111.555077851618 | 88 |
| 109.330817516408 | 94 |
| 102.815555321918 | 91 |
| 107.010779426987 | 84 |
| 81.4239229743071 | 91 |
| 96.8374640827873 | 94 |
| 97.1909631717358 | 86 |
| 102.750780984336 | 88 |
| 105.204003727847 | 96 |
| 105.256478405914 | 100 |
| 114.211642133782 | 98 |
| 103.631186057788 | 90 |
| 97.9809078052953 | 82 |
| 123.279364405398 | 97 |
| 93.6956639652158 | 79 |
| 117.202352071146 | 93 |
| 115.236878831761 | 92 |
| 108.854756824034 | 86 |
| 85.4808535433834 | 87 |
| 105.526978107728 | 86 |
| 102.481465990842 | 80 |
| 82.4222597603507 | 93 |
| 96.536973575412 | 96 |
| 92.7846764729291 | 97 |
| 94.6989841759625 | 90 |
| 85.285048304751 | 89 |
| 98.4111008632779 | 89 |
| 92.8203524962136 | 88 |
| 99.6351703658891 | 96 |
| 113.054298720597 | 98 |
| 97.749186945506 | 79 |
| 100.2624850279 | 95 |
| 82.3799224377521 | 82 |
| 90.5796589020669 | 94 |
| 94.1568331472774 | 96 |
| 80.6143517621224 | 59 |
| 83.9822993665099 | 91 |
| 90.3099375419241 | 83 |
| 93.6893020255338 | 78 |
| 89.8225561892658 | 74 |
| 83.719789527657 | 95 |
| 96.5387283587327 | 99 |
| 94.7654556155811 | 91 |
| 102.552223198919 | 87 |
| 91.1531374538278 | 69 |
| 68.3150107352473 | 84 |
| 86.0329394788445 | 91 |
| 100.719393983561 | 86 |
| 100.914434032397 | 85 |
| 94.8285024279802 | 79 |
| 97.4892713163915 | 86 |
| 92.2857199369838 | 96 |
| 86.9000507713049 | 79 |
| 130.751649068808 | 97 |
| 113.546587279768 | 99 |
| 114.795871719517 | 86 |
| 78.4221277804951 | 76 |
| 86.4950340551948 | 94 |
| 112.482867350325 | 100 |
| 101.575652722202 | 84 |
| 86.6731485376795 | 87 |
| 91.8328340722083 | 95 |
| 75.7724579419924 | 88 |
| 106.647173722286 | 97 |
| 117.541544602749 | 96 |
| 89.6840064823527 | 94 |
| 87.6072523789469 | 98 |
| 93.7906207309819 | 91 |
| 92.2941556217628 | 81 |
| 96.1439910655805 | 96 |
| 100.901246126777 | 88 |
| 106.32308110443 | 94 |
| 90.56982016456 | 100 |
| 89.1346261418392 | 94 |
| 116.623344712333 | 94 |
| 98.6072825012363 | 91 |
| 83.3144004129159 | 68 |
| 130.149006834518 | 100 |
| 111.563791325437 | 88 |
| 83.2023924182766 | 86 |
| 98.4741989016679 | 98 |
| 93.7315023283562 | 95 |
| 119.596012233844 | 93 |
| 90.5973973629092 | 69 |
| 87.6999603143942 | 85 |
| 68.9791166953822 | 83 |
| 78.9214003622333 | 83 |
| 82.6955189116515 | 91 |
| 98.0747329731981 | 81 |
| 111.101393032498 | 83 |
| 113.706450100433 | 90 |
| 107.862788163259 | 94 |
| 106.206340450373 | 94 |
| 79.8573115783402 | 92 |
| 107.750302269594 | 94 |
| 87.3644843712787 | 78 |
| 96.3644615192962 | 100 |
| 92.3780245873928 | 94 |
| 96.7815000371073 | 90 |
| 113.174582874154 | 92 |
| 81.4132507805995 | 93 |
| 129.084016291782 | 100 |
| 115.470171469172 | 100 |
| 88.265149631465 | 94 |
| 94.6905375804862 | 84 |
| 93.9680241209059 | 97 |
| 86.0502717085776 | 89 |
| 67.5253311705079 | 77 |
| 116.464054465701 | 93 |
| 77.5032767064455 | 91 |
| 81.1832865253599 | 80 |
| 135.368281458475 | 98 |
| 92.565511335609 | 82 |
| 85.2931076810915 | 81 |
| 68.7080229452602 | 60 |
| 90.8129858648659 | 79 |
| 113.685104531116 | 100 |
| 102.954788585 | 94 |
| 89.1175442986725 | 97 |
| 86.6632839500024 | 80 |
| 86.7185405433417 | 88 |
| 76.9177453538757 | 84 |
| 79.6548691636751 | 79 |
| 84.4667163242516 | 82 |
| 74.1110625464983 | 100 |
| 87.6556347109337 | 81 |
| 79.3132490457908 | 75 |
| 85.8492085542739 | 83 |
| 109.224242019167 | 93 |
| 75.1712442114565 | 92 |
| 87.5574225916985 | 89 |
| 77.265277607264 | 87 |
| 86.2128155772577 | 77 |
| 86.082929423353 | 93 |
| 130.199055013846 | 99 |
| 128.737193104277 | 100 |
| 69.8130851873859 | 74 |
| 106.382436551789 | 88 |
| 75.0548242835033 | 88 |
| 97.9823081740081 | 85 |
| 75.7836642524126 | 80 |
| 79.2878657124037 | 82 |
| 100.620024127474 | 83 |
| 82.824741670706 | 82 |
| 83.1840768080895 | 75 |
| 74.9675823637532 | 99 |
| 124.534807964263 | 100 |
| 88.5535691317883 | 69 |
| 80.1995354760913 | 80 |
| 79.8292463061878 | 83 |
| 64.4766894518922 | 86 |
| 76.3013187815611 | 89 |
| 79.819541117217 | 83 |
| 85.1338998907574 | 77 |
| 75.4996455037074 | 69 |
| 87.6567245295308 | 76 |
| 80.9171567698826 | 81 |
| 77.5605771508941 | 75 |
| 83.7754144727176 | 78 |
| 80.2308200723004 | 88 |
| 75.4633853505509 | 83 |
| 75.5691987915348 | 78 |
| 91.9700945594348 | 87 |
| 91.4594704765248 | 89 |
| 82.3081776708763 | 82 |
| 77.2557849930591 | 79 |
| 72.637095488823 | 89 |
| 101.838767242335 | 89 |
| 86.0047096437421 | 81 |
| 81.5747738726153 | 78 |
| 70.5690394824623 | 83 |
| 97.3506328987978 | 93 |
| 115.455392186343 | 98 |
| 65.0502312274518 | 77 |
| 99.6851373595992 | 79 |
| 115.254895589051 | 89 |
| 88.3330610707089 | 88 |
| 74.4100467194914 | 82 |
| 85.6859097782303 | 82 |
| 102.593562421768 | 82 |
| 76.4323843323071 | 90 |
| 111.187734504441 | 98 |
| 90.8654826339073 | 79 |
| 70.6989894703032 | 62 |
| 80.5521187989053 | 73 |
| 73.1272587356012 | 83 |
| 94.9822927624865 | 75 |
| 84.0482049187466 | 83 |
| 90.1789134679042 | 94 |
| 111.822889888454 | 79 |
| 69.4640047032292 | 79 |
| 87.112085115709 | 78 |
| 84.8027317458237 | 83 |
| 93.7127332785589 | 85 |
| 77.5406897851784 | 73 |
| 77.3836795003703 | 81 |
| 113.193353229539 | 96 |
| 118.760393714697 | 98 |
| 95.904007949829 | 93 |
| 117.075710105093 | 92 |
| 123.080794085331 | 100 |
| 95.8536576233725 | 66 |